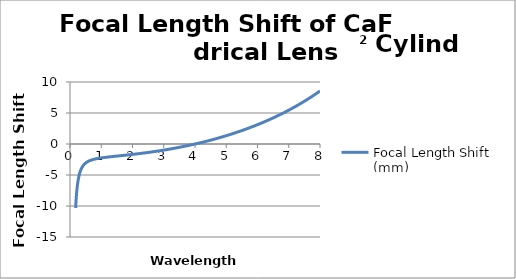
| Category | Focal Length Shift (mm) |
|---|---|
| 0.18 | -10.332 |
| 0.181 | -10.232 |
| 0.182 | -10.133 |
| 0.183 | -10.036 |
| 0.184 | -9.941 |
| 0.185 | -9.848 |
| 0.186 | -9.756 |
| 0.187 | -9.667 |
| 0.188 | -9.579 |
| 0.189 | -9.492 |
| 0.19 | -9.407 |
| 0.191 | -9.324 |
| 0.192 | -9.242 |
| 0.193 | -9.161 |
| 0.194 | -9.082 |
| 0.195 | -9.004 |
| 0.196 | -8.928 |
| 0.197 | -8.853 |
| 0.198 | -8.779 |
| 0.199 | -8.707 |
| 0.2 | -8.635 |
| 0.201 | -8.565 |
| 0.202 | -8.496 |
| 0.203 | -8.428 |
| 0.204 | -8.362 |
| 0.205 | -8.296 |
| 0.206 | -8.232 |
| 0.207 | -8.168 |
| 0.208 | -8.106 |
| 0.209 | -8.044 |
| 0.21 | -7.984 |
| 0.211 | -7.924 |
| 0.212 | -7.865 |
| 0.213 | -7.808 |
| 0.214 | -7.751 |
| 0.215 | -7.695 |
| 0.216 | -7.64 |
| 0.217 | -7.585 |
| 0.218 | -7.532 |
| 0.219 | -7.479 |
| 0.22 | -7.427 |
| 0.221 | -7.376 |
| 0.222 | -7.326 |
| 0.223 | -7.276 |
| 0.224 | -7.227 |
| 0.225 | -7.179 |
| 0.226 | -7.132 |
| 0.227 | -7.085 |
| 0.228 | -7.039 |
| 0.229 | -6.993 |
| 0.23 | -6.948 |
| 0.231 | -6.904 |
| 0.232 | -6.861 |
| 0.233 | -6.818 |
| 0.234 | -6.775 |
| 0.235 | -6.733 |
| 0.236 | -6.692 |
| 0.237 | -6.651 |
| 0.238 | -6.611 |
| 0.239 | -6.572 |
| 0.24 | -6.533 |
| 0.241 | -6.494 |
| 0.242 | -6.456 |
| 0.243 | -6.419 |
| 0.244 | -6.382 |
| 0.245 | -6.345 |
| 0.246 | -6.309 |
| 0.247 | -6.273 |
| 0.248 | -6.238 |
| 0.249 | -6.203 |
| 0.25 | -6.169 |
| 0.251 | -6.135 |
| 0.252 | -6.102 |
| 0.253 | -6.069 |
| 0.254 | -6.036 |
| 0.255 | -6.004 |
| 0.256 | -5.973 |
| 0.257 | -5.941 |
| 0.258 | -5.91 |
| 0.259 | -5.88 |
| 0.26 | -5.849 |
| 0.261 | -5.82 |
| 0.262 | -5.79 |
| 0.263 | -5.761 |
| 0.264 | -5.732 |
| 0.265 | -5.704 |
| 0.266 | -5.676 |
| 0.267 | -5.648 |
| 0.268 | -5.62 |
| 0.269 | -5.593 |
| 0.27 | -5.566 |
| 0.271 | -5.54 |
| 0.272 | -5.514 |
| 0.273 | -5.488 |
| 0.274 | -5.462 |
| 0.275 | -5.437 |
| 0.276 | -5.412 |
| 0.277 | -5.387 |
| 0.278 | -5.363 |
| 0.279 | -5.339 |
| 0.28 | -5.315 |
| 0.281 | -5.291 |
| 0.282 | -5.268 |
| 0.283 | -5.245 |
| 0.284 | -5.222 |
| 0.285 | -5.199 |
| 0.286 | -5.177 |
| 0.287 | -5.155 |
| 0.288 | -5.133 |
| 0.289 | -5.111 |
| 0.29 | -5.09 |
| 0.291 | -5.069 |
| 0.292 | -5.048 |
| 0.293 | -5.027 |
| 0.294 | -5.007 |
| 0.295 | -4.986 |
| 0.296 | -4.966 |
| 0.297 | -4.946 |
| 0.298 | -4.927 |
| 0.299 | -4.907 |
| 0.3 | -4.888 |
| 0.301 | -4.869 |
| 0.302 | -4.85 |
| 0.303 | -4.831 |
| 0.304 | -4.813 |
| 0.305 | -4.795 |
| 0.306 | -4.777 |
| 0.307 | -4.759 |
| 0.308 | -4.741 |
| 0.309 | -4.723 |
| 0.31 | -4.706 |
| 0.311 | -4.689 |
| 0.312 | -4.672 |
| 0.313 | -4.655 |
| 0.314 | -4.638 |
| 0.315 | -4.622 |
| 0.316 | -4.605 |
| 0.317 | -4.589 |
| 0.318 | -4.573 |
| 0.319 | -4.557 |
| 0.32 | -4.541 |
| 0.321 | -4.526 |
| 0.322 | -4.51 |
| 0.323 | -4.495 |
| 0.324 | -4.48 |
| 0.325 | -4.465 |
| 0.326 | -4.45 |
| 0.327 | -4.435 |
| 0.328 | -4.421 |
| 0.329 | -4.406 |
| 0.33 | -4.392 |
| 0.331 | -4.378 |
| 0.332 | -4.364 |
| 0.333 | -4.35 |
| 0.334 | -4.336 |
| 0.335 | -4.322 |
| 0.336 | -4.309 |
| 0.337 | -4.295 |
| 0.338 | -4.282 |
| 0.339 | -4.269 |
| 0.34 | -4.256 |
| 0.341 | -4.243 |
| 0.342 | -4.23 |
| 0.343 | -4.217 |
| 0.344 | -4.205 |
| 0.345 | -4.192 |
| 0.346 | -4.18 |
| 0.347 | -4.168 |
| 0.348 | -4.156 |
| 0.349 | -4.144 |
| 0.35 | -4.132 |
| 0.351 | -4.12 |
| 0.352 | -4.108 |
| 0.353 | -4.096 |
| 0.354 | -4.085 |
| 0.355 | -4.073 |
| 0.356 | -4.062 |
| 0.357 | -4.051 |
| 0.358 | -4.04 |
| 0.359 | -4.029 |
| 0.36 | -4.018 |
| 0.361 | -4.007 |
| 0.362 | -3.996 |
| 0.363 | -3.985 |
| 0.364 | -3.975 |
| 0.365 | -3.964 |
| 0.366 | -3.954 |
| 0.367 | -3.943 |
| 0.368 | -3.933 |
| 0.369 | -3.923 |
| 0.37 | -3.913 |
| 0.371 | -3.903 |
| 0.372 | -3.893 |
| 0.373 | -3.883 |
| 0.374 | -3.873 |
| 0.375 | -3.864 |
| 0.376 | -3.854 |
| 0.377 | -3.845 |
| 0.378 | -3.835 |
| 0.379 | -3.826 |
| 0.38 | -3.817 |
| 0.381 | -3.807 |
| 0.382 | -3.798 |
| 0.383 | -3.789 |
| 0.384 | -3.78 |
| 0.385 | -3.771 |
| 0.386 | -3.762 |
| 0.387 | -3.754 |
| 0.388 | -3.745 |
| 0.389 | -3.736 |
| 0.39 | -3.728 |
| 0.391 | -3.719 |
| 0.392 | -3.711 |
| 0.393 | -3.702 |
| 0.394 | -3.694 |
| 0.395 | -3.686 |
| 0.396 | -3.677 |
| 0.397 | -3.669 |
| 0.398 | -3.661 |
| 0.399 | -3.653 |
| 0.4 | -3.645 |
| 0.401 | -3.637 |
| 0.402 | -3.63 |
| 0.403 | -3.622 |
| 0.404 | -3.614 |
| 0.405 | -3.606 |
| 0.406 | -3.599 |
| 0.407 | -3.591 |
| 0.408 | -3.584 |
| 0.409 | -3.576 |
| 0.41 | -3.569 |
| 0.411 | -3.562 |
| 0.412 | -3.554 |
| 0.413 | -3.547 |
| 0.414 | -3.54 |
| 0.415 | -3.533 |
| 0.416 | -3.526 |
| 0.417 | -3.519 |
| 0.418 | -3.512 |
| 0.419 | -3.505 |
| 0.42 | -3.498 |
| 0.421 | -3.491 |
| 0.422 | -3.484 |
| 0.423 | -3.478 |
| 0.424 | -3.471 |
| 0.425 | -3.464 |
| 0.426 | -3.458 |
| 0.427 | -3.451 |
| 0.428 | -3.445 |
| 0.429 | -3.438 |
| 0.43 | -3.432 |
| 0.431 | -3.426 |
| 0.432 | -3.419 |
| 0.433 | -3.413 |
| 0.434 | -3.407 |
| 0.435 | -3.401 |
| 0.436 | -3.394 |
| 0.437 | -3.388 |
| 0.438 | -3.382 |
| 0.439 | -3.376 |
| 0.44 | -3.37 |
| 0.441 | -3.364 |
| 0.442 | -3.358 |
| 0.443 | -3.353 |
| 0.444 | -3.347 |
| 0.445 | -3.341 |
| 0.446 | -3.335 |
| 0.447 | -3.33 |
| 0.448 | -3.324 |
| 0.449 | -3.318 |
| 0.45 | -3.313 |
| 0.451 | -3.307 |
| 0.452 | -3.302 |
| 0.453 | -3.296 |
| 0.454 | -3.291 |
| 0.455 | -3.285 |
| 0.456 | -3.28 |
| 0.457 | -3.275 |
| 0.458 | -3.269 |
| 0.459 | -3.264 |
| 0.46 | -3.259 |
| 0.461 | -3.254 |
| 0.462 | -3.248 |
| 0.463 | -3.243 |
| 0.464 | -3.238 |
| 0.465 | -3.233 |
| 0.466 | -3.228 |
| 0.467 | -3.223 |
| 0.468 | -3.218 |
| 0.469 | -3.213 |
| 0.47 | -3.208 |
| 0.471 | -3.203 |
| 0.472 | -3.199 |
| 0.473 | -3.194 |
| 0.474 | -3.189 |
| 0.475 | -3.184 |
| 0.476 | -3.179 |
| 0.477 | -3.175 |
| 0.478 | -3.17 |
| 0.479 | -3.165 |
| 0.48 | -3.161 |
| 0.481 | -3.156 |
| 0.482 | -3.152 |
| 0.483 | -3.147 |
| 0.484 | -3.143 |
| 0.485 | -3.138 |
| 0.486 | -3.134 |
| 0.487 | -3.129 |
| 0.488 | -3.125 |
| 0.489 | -3.121 |
| 0.49 | -3.116 |
| 0.491 | -3.112 |
| 0.492 | -3.108 |
| 0.493 | -3.103 |
| 0.494 | -3.099 |
| 0.495 | -3.095 |
| 0.496 | -3.091 |
| 0.497 | -3.086 |
| 0.498 | -3.082 |
| 0.499 | -3.078 |
| 0.5 | -3.074 |
| 0.501 | -3.07 |
| 0.502 | -3.066 |
| 0.503 | -3.062 |
| 0.504 | -3.058 |
| 0.505 | -3.054 |
| 0.506 | -3.05 |
| 0.507 | -3.046 |
| 0.508 | -3.042 |
| 0.509 | -3.038 |
| 0.51 | -3.034 |
| 0.511 | -3.031 |
| 0.512 | -3.027 |
| 0.513 | -3.023 |
| 0.514 | -3.019 |
| 0.515 | -3.015 |
| 0.516 | -3.012 |
| 0.517 | -3.008 |
| 0.518 | -3.004 |
| 0.519 | -3.001 |
| 0.52 | -2.997 |
| 0.521 | -2.993 |
| 0.522 | -2.99 |
| 0.523 | -2.986 |
| 0.524 | -2.983 |
| 0.525 | -2.979 |
| 0.526 | -2.975 |
| 0.527 | -2.972 |
| 0.528 | -2.968 |
| 0.529 | -2.965 |
| 0.53 | -2.962 |
| 0.531 | -2.958 |
| 0.532 | -2.955 |
| 0.533 | -2.951 |
| 0.534 | -2.948 |
| 0.535 | -2.945 |
| 0.536 | -2.941 |
| 0.537 | -2.938 |
| 0.538 | -2.935 |
| 0.539 | -2.931 |
| 0.54 | -2.928 |
| 0.541 | -2.925 |
| 0.542 | -2.921 |
| 0.543 | -2.918 |
| 0.544 | -2.915 |
| 0.545 | -2.912 |
| 0.546 | -2.909 |
| 0.547 | -2.906 |
| 0.548 | -2.902 |
| 0.549 | -2.899 |
| 0.55 | -2.896 |
| 0.551 | -2.893 |
| 0.552 | -2.89 |
| 0.553 | -2.887 |
| 0.554 | -2.884 |
| 0.555 | -2.881 |
| 0.556 | -2.878 |
| 0.557 | -2.875 |
| 0.558 | -2.872 |
| 0.559 | -2.869 |
| 0.56 | -2.866 |
| 0.561 | -2.863 |
| 0.562 | -2.86 |
| 0.563 | -2.857 |
| 0.564 | -2.854 |
| 0.565 | -2.851 |
| 0.566 | -2.849 |
| 0.567 | -2.846 |
| 0.568 | -2.843 |
| 0.569 | -2.84 |
| 0.57 | -2.837 |
| 0.571 | -2.834 |
| 0.572 | -2.832 |
| 0.573 | -2.829 |
| 0.574 | -2.826 |
| 0.575 | -2.823 |
| 0.576 | -2.821 |
| 0.577 | -2.818 |
| 0.578 | -2.815 |
| 0.579 | -2.813 |
| 0.58 | -2.81 |
| 0.581 | -2.807 |
| 0.582 | -2.805 |
| 0.583 | -2.802 |
| 0.584 | -2.799 |
| 0.585 | -2.797 |
| 0.586 | -2.794 |
| 0.587 | -2.792 |
| 0.588 | -2.789 |
| 0.589 | -2.786 |
| 0.59 | -2.784 |
| 0.591 | -2.781 |
| 0.592 | -2.779 |
| 0.593 | -2.776 |
| 0.594 | -2.774 |
| 0.595 | -2.771 |
| 0.596 | -2.769 |
| 0.597 | -2.766 |
| 0.598 | -2.764 |
| 0.599 | -2.761 |
| 0.6 | -2.759 |
| 0.601 | -2.757 |
| 0.602 | -2.754 |
| 0.603 | -2.752 |
| 0.604 | -2.749 |
| 0.605 | -2.747 |
| 0.606 | -2.745 |
| 0.607 | -2.742 |
| 0.608 | -2.74 |
| 0.609 | -2.738 |
| 0.61 | -2.735 |
| 0.611 | -2.733 |
| 0.612 | -2.731 |
| 0.613 | -2.728 |
| 0.614 | -2.726 |
| 0.615 | -2.724 |
| 0.616 | -2.722 |
| 0.617 | -2.719 |
| 0.618 | -2.717 |
| 0.619 | -2.715 |
| 0.62 | -2.713 |
| 0.621 | -2.71 |
| 0.622 | -2.708 |
| 0.623 | -2.706 |
| 0.624 | -2.704 |
| 0.625 | -2.702 |
| 0.626 | -2.699 |
| 0.627 | -2.697 |
| 0.628 | -2.695 |
| 0.629 | -2.693 |
| 0.63 | -2.691 |
| 0.631 | -2.689 |
| 0.632 | -2.687 |
| 0.633 | -2.685 |
| 0.634 | -2.683 |
| 0.635 | -2.68 |
| 0.636 | -2.678 |
| 0.637 | -2.676 |
| 0.638 | -2.674 |
| 0.639 | -2.672 |
| 0.64 | -2.67 |
| 0.641 | -2.668 |
| 0.642 | -2.666 |
| 0.643 | -2.664 |
| 0.644 | -2.662 |
| 0.645 | -2.66 |
| 0.646 | -2.658 |
| 0.647 | -2.656 |
| 0.648 | -2.654 |
| 0.649 | -2.652 |
| 0.65 | -2.65 |
| 0.651 | -2.648 |
| 0.652 | -2.646 |
| 0.653 | -2.644 |
| 0.654 | -2.643 |
| 0.655 | -2.641 |
| 0.656 | -2.639 |
| 0.657 | -2.637 |
| 0.658 | -2.635 |
| 0.659 | -2.633 |
| 0.66 | -2.631 |
| 0.661 | -2.629 |
| 0.662 | -2.627 |
| 0.663 | -2.626 |
| 0.664 | -2.624 |
| 0.665 | -2.622 |
| 0.666 | -2.62 |
| 0.667 | -2.618 |
| 0.668 | -2.616 |
| 0.669 | -2.615 |
| 0.67 | -2.613 |
| 0.671 | -2.611 |
| 0.672 | -2.609 |
| 0.673 | -2.607 |
| 0.674 | -2.606 |
| 0.675 | -2.604 |
| 0.676 | -2.602 |
| 0.677 | -2.6 |
| 0.678 | -2.599 |
| 0.679 | -2.597 |
| 0.68 | -2.595 |
| 0.681 | -2.593 |
| 0.682 | -2.592 |
| 0.683 | -2.59 |
| 0.684 | -2.588 |
| 0.685 | -2.587 |
| 0.686 | -2.585 |
| 0.687 | -2.583 |
| 0.688 | -2.582 |
| 0.689 | -2.58 |
| 0.69 | -2.578 |
| 0.691 | -2.577 |
| 0.692 | -2.575 |
| 0.693 | -2.573 |
| 0.694 | -2.572 |
| 0.695 | -2.57 |
| 0.696 | -2.568 |
| 0.697 | -2.567 |
| 0.698 | -2.565 |
| 0.699 | -2.563 |
| 0.7 | -2.562 |
| 0.701 | -2.56 |
| 0.702 | -2.559 |
| 0.703 | -2.557 |
| 0.704 | -2.556 |
| 0.705 | -2.554 |
| 0.706 | -2.552 |
| 0.707 | -2.551 |
| 0.708 | -2.549 |
| 0.709 | -2.548 |
| 0.71 | -2.546 |
| 0.711 | -2.545 |
| 0.712 | -2.543 |
| 0.713 | -2.542 |
| 0.714 | -2.54 |
| 0.715 | -2.538 |
| 0.716 | -2.537 |
| 0.717 | -2.535 |
| 0.718 | -2.534 |
| 0.719 | -2.532 |
| 0.72 | -2.531 |
| 0.721 | -2.529 |
| 0.722 | -2.528 |
| 0.723 | -2.526 |
| 0.724 | -2.525 |
| 0.725 | -2.524 |
| 0.726 | -2.522 |
| 0.727 | -2.521 |
| 0.728 | -2.519 |
| 0.729 | -2.518 |
| 0.73 | -2.516 |
| 0.731 | -2.515 |
| 0.732 | -2.513 |
| 0.733 | -2.512 |
| 0.734 | -2.511 |
| 0.735 | -2.509 |
| 0.736 | -2.508 |
| 0.737 | -2.506 |
| 0.738 | -2.505 |
| 0.739 | -2.503 |
| 0.74 | -2.502 |
| 0.741 | -2.501 |
| 0.742 | -2.499 |
| 0.743 | -2.498 |
| 0.744 | -2.497 |
| 0.745 | -2.495 |
| 0.746 | -2.494 |
| 0.747 | -2.492 |
| 0.748 | -2.491 |
| 0.749 | -2.49 |
| 0.75 | -2.488 |
| 0.751 | -2.487 |
| 0.752 | -2.486 |
| 0.753 | -2.484 |
| 0.754 | -2.483 |
| 0.755 | -2.482 |
| 0.756 | -2.48 |
| 0.757 | -2.479 |
| 0.758 | -2.478 |
| 0.759 | -2.476 |
| 0.76 | -2.475 |
| 0.761 | -2.474 |
| 0.762 | -2.473 |
| 0.763 | -2.471 |
| 0.764 | -2.47 |
| 0.765 | -2.469 |
| 0.766 | -2.467 |
| 0.767 | -2.466 |
| 0.768 | -2.465 |
| 0.769 | -2.464 |
| 0.77 | -2.462 |
| 0.771 | -2.461 |
| 0.772 | -2.46 |
| 0.773 | -2.458 |
| 0.774 | -2.457 |
| 0.775 | -2.456 |
| 0.776 | -2.455 |
| 0.777 | -2.454 |
| 0.778 | -2.452 |
| 0.779 | -2.451 |
| 0.78 | -2.45 |
| 0.781 | -2.449 |
| 0.782 | -2.447 |
| 0.783 | -2.446 |
| 0.784 | -2.445 |
| 0.785 | -2.444 |
| 0.786 | -2.443 |
| 0.787 | -2.441 |
| 0.788 | -2.44 |
| 0.789 | -2.439 |
| 0.79 | -2.438 |
| 0.791 | -2.437 |
| 0.792 | -2.435 |
| 0.793 | -2.434 |
| 0.794 | -2.433 |
| 0.795 | -2.432 |
| 0.796 | -2.431 |
| 0.797 | -2.429 |
| 0.798 | -2.428 |
| 0.799 | -2.427 |
| 0.8 | -2.426 |
| 0.801 | -2.425 |
| 0.802 | -2.424 |
| 0.803 | -2.423 |
| 0.804 | -2.421 |
| 0.805 | -2.42 |
| 0.806 | -2.419 |
| 0.807 | -2.418 |
| 0.808 | -2.417 |
| 0.809 | -2.416 |
| 0.81 | -2.415 |
| 0.811 | -2.413 |
| 0.812 | -2.412 |
| 0.813 | -2.411 |
| 0.814 | -2.41 |
| 0.815 | -2.409 |
| 0.816 | -2.408 |
| 0.817 | -2.407 |
| 0.818 | -2.406 |
| 0.819 | -2.405 |
| 0.82 | -2.404 |
| 0.821 | -2.402 |
| 0.822 | -2.401 |
| 0.823 | -2.4 |
| 0.824 | -2.399 |
| 0.825 | -2.398 |
| 0.826 | -2.397 |
| 0.827 | -2.396 |
| 0.828 | -2.395 |
| 0.829 | -2.394 |
| 0.83 | -2.393 |
| 0.831 | -2.392 |
| 0.832 | -2.391 |
| 0.833 | -2.39 |
| 0.834 | -2.389 |
| 0.835 | -2.387 |
| 0.836 | -2.386 |
| 0.837 | -2.385 |
| 0.838 | -2.384 |
| 0.839 | -2.383 |
| 0.84 | -2.382 |
| 0.841 | -2.381 |
| 0.842 | -2.38 |
| 0.843 | -2.379 |
| 0.844 | -2.378 |
| 0.845 | -2.377 |
| 0.846 | -2.376 |
| 0.847 | -2.375 |
| 0.848 | -2.374 |
| 0.849 | -2.373 |
| 0.85 | -2.372 |
| 0.851 | -2.371 |
| 0.852 | -2.37 |
| 0.853 | -2.369 |
| 0.854 | -2.368 |
| 0.855 | -2.367 |
| 0.856 | -2.366 |
| 0.857 | -2.365 |
| 0.858 | -2.364 |
| 0.859 | -2.363 |
| 0.86 | -2.362 |
| 0.861 | -2.361 |
| 0.862 | -2.36 |
| 0.863 | -2.359 |
| 0.864 | -2.358 |
| 0.865 | -2.357 |
| 0.866 | -2.356 |
| 0.867 | -2.355 |
| 0.868 | -2.354 |
| 0.869 | -2.353 |
| 0.87 | -2.352 |
| 0.871 | -2.351 |
| 0.872 | -2.35 |
| 0.873 | -2.349 |
| 0.874 | -2.349 |
| 0.875 | -2.348 |
| 0.876 | -2.347 |
| 0.877 | -2.346 |
| 0.878 | -2.345 |
| 0.879 | -2.344 |
| 0.88 | -2.343 |
| 0.881 | -2.342 |
| 0.882 | -2.341 |
| 0.883 | -2.34 |
| 0.884 | -2.339 |
| 0.885 | -2.338 |
| 0.886 | -2.337 |
| 0.887 | -2.336 |
| 0.888 | -2.335 |
| 0.889 | -2.335 |
| 0.89 | -2.334 |
| 0.891 | -2.333 |
| 0.892 | -2.332 |
| 0.893 | -2.331 |
| 0.894 | -2.33 |
| 0.895 | -2.329 |
| 0.896 | -2.328 |
| 0.897 | -2.327 |
| 0.898 | -2.326 |
| 0.899 | -2.325 |
| 0.9 | -2.325 |
| 0.901 | -2.324 |
| 0.902 | -2.323 |
| 0.903 | -2.322 |
| 0.904 | -2.321 |
| 0.905 | -2.32 |
| 0.906 | -2.319 |
| 0.907 | -2.318 |
| 0.908 | -2.317 |
| 0.909 | -2.317 |
| 0.91 | -2.316 |
| 0.911 | -2.315 |
| 0.912 | -2.314 |
| 0.913 | -2.313 |
| 0.914 | -2.312 |
| 0.915 | -2.311 |
| 0.916 | -2.31 |
| 0.917 | -2.31 |
| 0.918 | -2.309 |
| 0.919 | -2.308 |
| 0.92 | -2.307 |
| 0.921 | -2.306 |
| 0.922 | -2.305 |
| 0.923 | -2.304 |
| 0.924 | -2.304 |
| 0.925 | -2.303 |
| 0.926 | -2.302 |
| 0.927 | -2.301 |
| 0.928 | -2.3 |
| 0.929 | -2.299 |
| 0.93 | -2.298 |
| 0.931 | -2.298 |
| 0.932 | -2.297 |
| 0.933 | -2.296 |
| 0.934 | -2.295 |
| 0.935 | -2.294 |
| 0.936 | -2.293 |
| 0.937 | -2.293 |
| 0.938 | -2.292 |
| 0.939 | -2.291 |
| 0.94 | -2.29 |
| 0.941 | -2.289 |
| 0.942 | -2.289 |
| 0.943 | -2.288 |
| 0.944 | -2.287 |
| 0.945 | -2.286 |
| 0.946 | -2.285 |
| 0.947 | -2.284 |
| 0.948 | -2.284 |
| 0.949 | -2.283 |
| 0.95 | -2.282 |
| 0.951 | -2.281 |
| 0.952 | -2.28 |
| 0.953 | -2.28 |
| 0.954 | -2.279 |
| 0.955 | -2.278 |
| 0.956 | -2.277 |
| 0.957 | -2.276 |
| 0.958 | -2.276 |
| 0.959 | -2.275 |
| 0.96 | -2.274 |
| 0.961 | -2.273 |
| 0.962 | -2.272 |
| 0.963 | -2.272 |
| 0.964 | -2.271 |
| 0.965 | -2.27 |
| 0.966 | -2.269 |
| 0.967 | -2.268 |
| 0.968 | -2.268 |
| 0.969 | -2.267 |
| 0.97 | -2.266 |
| 0.971 | -2.265 |
| 0.972 | -2.265 |
| 0.973 | -2.264 |
| 0.974 | -2.263 |
| 0.975 | -2.262 |
| 0.976 | -2.261 |
| 0.977 | -2.261 |
| 0.978 | -2.26 |
| 0.979 | -2.259 |
| 0.98 | -2.258 |
| 0.981 | -2.258 |
| 0.982 | -2.257 |
| 0.983 | -2.256 |
| 0.984 | -2.255 |
| 0.985 | -2.255 |
| 0.986 | -2.254 |
| 0.987 | -2.253 |
| 0.988 | -2.252 |
| 0.989 | -2.252 |
| 0.99 | -2.251 |
| 0.991 | -2.25 |
| 0.992 | -2.249 |
| 0.993 | -2.249 |
| 0.994 | -2.248 |
| 0.995 | -2.247 |
| 0.996 | -2.246 |
| 0.997 | -2.246 |
| 0.998 | -2.245 |
| 0.999 | -2.244 |
| 1.0 | -2.243 |
| 1.001 | -2.243 |
| 1.002 | -2.242 |
| 1.003 | -2.241 |
| 1.004 | -2.24 |
| 1.005 | -2.24 |
| 1.006 | -2.239 |
| 1.007 | -2.238 |
| 1.008 | -2.237 |
| 1.009 | -2.237 |
| 1.01 | -2.236 |
| 1.011 | -2.235 |
| 1.012 | -2.235 |
| 1.013 | -2.234 |
| 1.014 | -2.233 |
| 1.015 | -2.232 |
| 1.016 | -2.232 |
| 1.017 | -2.231 |
| 1.018 | -2.23 |
| 1.019 | -2.23 |
| 1.02 | -2.229 |
| 1.021 | -2.228 |
| 1.022 | -2.227 |
| 1.023 | -2.227 |
| 1.024 | -2.226 |
| 1.025 | -2.225 |
| 1.026 | -2.224 |
| 1.027 | -2.224 |
| 1.028 | -2.223 |
| 1.029 | -2.222 |
| 1.03 | -2.222 |
| 1.031 | -2.221 |
| 1.032 | -2.22 |
| 1.033 | -2.22 |
| 1.034 | -2.219 |
| 1.035 | -2.218 |
| 1.036 | -2.217 |
| 1.037 | -2.217 |
| 1.038 | -2.216 |
| 1.039 | -2.215 |
| 1.04 | -2.215 |
| 1.041 | -2.214 |
| 1.042 | -2.213 |
| 1.043 | -2.213 |
| 1.044 | -2.212 |
| 1.045 | -2.211 |
| 1.046 | -2.21 |
| 1.047 | -2.21 |
| 1.048 | -2.209 |
| 1.049 | -2.208 |
| 1.05 | -2.208 |
| 1.051 | -2.207 |
| 1.052 | -2.206 |
| 1.053 | -2.206 |
| 1.054 | -2.205 |
| 1.055 | -2.204 |
| 1.056 | -2.204 |
| 1.057 | -2.203 |
| 1.058 | -2.202 |
| 1.059 | -2.202 |
| 1.06 | -2.201 |
| 1.061 | -2.2 |
| 1.062 | -2.2 |
| 1.063 | -2.199 |
| 1.064 | -2.198 |
| 1.065 | -2.198 |
| 1.066 | -2.197 |
| 1.067 | -2.196 |
| 1.068 | -2.196 |
| 1.069 | -2.195 |
| 1.07 | -2.194 |
| 1.071 | -2.194 |
| 1.072 | -2.193 |
| 1.073 | -2.192 |
| 1.074 | -2.192 |
| 1.075 | -2.191 |
| 1.076 | -2.19 |
| 1.077 | -2.19 |
| 1.078 | -2.189 |
| 1.079 | -2.188 |
| 1.08 | -2.188 |
| 1.081 | -2.187 |
| 1.082 | -2.186 |
| 1.083 | -2.186 |
| 1.084 | -2.185 |
| 1.085 | -2.184 |
| 1.086 | -2.184 |
| 1.087 | -2.183 |
| 1.088 | -2.182 |
| 1.089 | -2.182 |
| 1.09 | -2.181 |
| 1.091 | -2.18 |
| 1.092 | -2.18 |
| 1.093 | -2.179 |
| 1.094 | -2.178 |
| 1.095 | -2.178 |
| 1.096 | -2.177 |
| 1.097 | -2.176 |
| 1.098 | -2.176 |
| 1.099 | -2.175 |
| 1.1 | -2.175 |
| 1.101 | -2.174 |
| 1.102 | -2.173 |
| 1.103 | -2.173 |
| 1.104 | -2.172 |
| 1.105 | -2.171 |
| 1.106 | -2.171 |
| 1.107 | -2.17 |
| 1.108 | -2.169 |
| 1.109 | -2.169 |
| 1.11 | -2.168 |
| 1.111 | -2.167 |
| 1.112 | -2.167 |
| 1.113 | -2.166 |
| 1.114 | -2.166 |
| 1.115 | -2.165 |
| 1.116 | -2.164 |
| 1.117 | -2.164 |
| 1.118 | -2.163 |
| 1.119 | -2.162 |
| 1.12 | -2.162 |
| 1.121 | -2.161 |
| 1.122 | -2.16 |
| 1.123 | -2.16 |
| 1.124 | -2.159 |
| 1.125 | -2.159 |
| 1.126 | -2.158 |
| 1.127 | -2.157 |
| 1.128 | -2.157 |
| 1.129 | -2.156 |
| 1.13 | -2.155 |
| 1.131 | -2.155 |
| 1.132 | -2.154 |
| 1.133 | -2.154 |
| 1.134 | -2.153 |
| 1.135 | -2.152 |
| 1.136 | -2.152 |
| 1.137 | -2.151 |
| 1.138 | -2.151 |
| 1.139 | -2.15 |
| 1.14 | -2.149 |
| 1.141 | -2.149 |
| 1.142 | -2.148 |
| 1.143 | -2.147 |
| 1.144 | -2.147 |
| 1.145 | -2.146 |
| 1.146 | -2.146 |
| 1.147 | -2.145 |
| 1.148 | -2.144 |
| 1.149 | -2.144 |
| 1.15 | -2.143 |
| 1.151 | -2.143 |
| 1.152 | -2.142 |
| 1.153 | -2.141 |
| 1.154 | -2.141 |
| 1.155 | -2.14 |
| 1.156 | -2.139 |
| 1.157 | -2.139 |
| 1.158 | -2.138 |
| 1.159 | -2.138 |
| 1.16 | -2.137 |
| 1.161 | -2.136 |
| 1.162 | -2.136 |
| 1.163 | -2.135 |
| 1.164 | -2.135 |
| 1.165 | -2.134 |
| 1.166 | -2.133 |
| 1.167 | -2.133 |
| 1.168 | -2.132 |
| 1.169 | -2.132 |
| 1.17 | -2.131 |
| 1.171 | -2.13 |
| 1.172 | -2.13 |
| 1.173 | -2.129 |
| 1.174 | -2.129 |
| 1.175 | -2.128 |
| 1.176 | -2.127 |
| 1.177 | -2.127 |
| 1.178 | -2.126 |
| 1.179 | -2.126 |
| 1.18 | -2.125 |
| 1.181 | -2.124 |
| 1.182 | -2.124 |
| 1.183 | -2.123 |
| 1.184 | -2.123 |
| 1.185 | -2.122 |
| 1.186 | -2.121 |
| 1.187 | -2.121 |
| 1.188 | -2.12 |
| 1.189 | -2.12 |
| 1.19 | -2.119 |
| 1.191 | -2.119 |
| 1.192 | -2.118 |
| 1.193 | -2.117 |
| 1.194 | -2.117 |
| 1.195 | -2.116 |
| 1.196 | -2.116 |
| 1.197 | -2.115 |
| 1.198 | -2.114 |
| 1.199 | -2.114 |
| 1.2 | -2.113 |
| 1.201 | -2.113 |
| 1.202 | -2.112 |
| 1.203 | -2.111 |
| 1.204 | -2.111 |
| 1.205 | -2.11 |
| 1.206 | -2.11 |
| 1.207 | -2.109 |
| 1.208 | -2.109 |
| 1.209 | -2.108 |
| 1.21 | -2.107 |
| 1.211 | -2.107 |
| 1.212 | -2.106 |
| 1.213 | -2.106 |
| 1.214 | -2.105 |
| 1.215 | -2.104 |
| 1.216 | -2.104 |
| 1.217 | -2.103 |
| 1.218 | -2.103 |
| 1.219 | -2.102 |
| 1.22 | -2.102 |
| 1.221 | -2.101 |
| 1.222 | -2.1 |
| 1.223 | -2.1 |
| 1.224 | -2.099 |
| 1.225 | -2.099 |
| 1.226 | -2.098 |
| 1.227 | -2.098 |
| 1.228 | -2.097 |
| 1.229 | -2.096 |
| 1.23 | -2.096 |
| 1.231 | -2.095 |
| 1.232 | -2.095 |
| 1.233 | -2.094 |
| 1.234 | -2.094 |
| 1.235 | -2.093 |
| 1.236 | -2.092 |
| 1.237 | -2.092 |
| 1.238 | -2.091 |
| 1.239 | -2.091 |
| 1.24 | -2.09 |
| 1.241 | -2.09 |
| 1.242 | -2.089 |
| 1.243 | -2.088 |
| 1.244 | -2.088 |
| 1.245 | -2.087 |
| 1.246 | -2.087 |
| 1.247 | -2.086 |
| 1.248 | -2.086 |
| 1.249 | -2.085 |
| 1.25 | -2.084 |
| 1.251 | -2.084 |
| 1.252 | -2.083 |
| 1.253 | -2.083 |
| 1.254 | -2.082 |
| 1.255 | -2.082 |
| 1.256 | -2.081 |
| 1.257 | -2.08 |
| 1.258 | -2.08 |
| 1.259 | -2.079 |
| 1.26 | -2.079 |
| 1.261 | -2.078 |
| 1.262 | -2.078 |
| 1.263 | -2.077 |
| 1.264 | -2.077 |
| 1.265 | -2.076 |
| 1.266 | -2.075 |
| 1.267 | -2.075 |
| 1.268 | -2.074 |
| 1.269 | -2.074 |
| 1.27 | -2.073 |
| 1.271 | -2.073 |
| 1.272 | -2.072 |
| 1.273 | -2.071 |
| 1.274 | -2.071 |
| 1.275 | -2.07 |
| 1.276 | -2.07 |
| 1.277 | -2.069 |
| 1.278 | -2.069 |
| 1.279 | -2.068 |
| 1.28 | -2.068 |
| 1.281 | -2.067 |
| 1.282 | -2.066 |
| 1.283 | -2.066 |
| 1.284 | -2.065 |
| 1.285 | -2.065 |
| 1.286 | -2.064 |
| 1.287 | -2.064 |
| 1.288 | -2.063 |
| 1.289 | -2.063 |
| 1.29 | -2.062 |
| 1.291 | -2.061 |
| 1.292 | -2.061 |
| 1.293 | -2.06 |
| 1.294 | -2.06 |
| 1.295 | -2.059 |
| 1.296 | -2.059 |
| 1.297 | -2.058 |
| 1.298 | -2.058 |
| 1.299 | -2.057 |
| 1.3 | -2.056 |
| 1.301 | -2.056 |
| 1.302 | -2.055 |
| 1.303 | -2.055 |
| 1.304 | -2.054 |
| 1.305 | -2.054 |
| 1.306 | -2.053 |
| 1.307 | -2.053 |
| 1.308 | -2.052 |
| 1.309 | -2.052 |
| 1.31 | -2.051 |
| 1.311 | -2.05 |
| 1.312 | -2.05 |
| 1.313 | -2.049 |
| 1.314 | -2.049 |
| 1.315 | -2.048 |
| 1.316 | -2.048 |
| 1.317 | -2.047 |
| 1.318 | -2.047 |
| 1.319 | -2.046 |
| 1.32 | -2.045 |
| 1.321 | -2.045 |
| 1.322 | -2.044 |
| 1.323 | -2.044 |
| 1.324 | -2.043 |
| 1.325 | -2.043 |
| 1.326 | -2.042 |
| 1.327 | -2.042 |
| 1.328 | -2.041 |
| 1.329 | -2.041 |
| 1.33 | -2.04 |
| 1.331 | -2.039 |
| 1.332 | -2.039 |
| 1.333 | -2.038 |
| 1.334 | -2.038 |
| 1.335 | -2.037 |
| 1.336 | -2.037 |
| 1.337 | -2.036 |
| 1.338 | -2.036 |
| 1.339 | -2.035 |
| 1.34 | -2.035 |
| 1.341 | -2.034 |
| 1.342 | -2.033 |
| 1.343 | -2.033 |
| 1.344 | -2.032 |
| 1.345 | -2.032 |
| 1.346 | -2.031 |
| 1.347 | -2.031 |
| 1.348 | -2.03 |
| 1.349 | -2.03 |
| 1.35 | -2.029 |
| 1.351 | -2.029 |
| 1.352 | -2.028 |
| 1.353 | -2.028 |
| 1.354 | -2.027 |
| 1.355 | -2.026 |
| 1.356 | -2.026 |
| 1.357 | -2.025 |
| 1.358 | -2.025 |
| 1.359 | -2.024 |
| 1.36 | -2.024 |
| 1.361 | -2.023 |
| 1.362 | -2.023 |
| 1.363 | -2.022 |
| 1.364 | -2.022 |
| 1.365 | -2.021 |
| 1.366 | -2.021 |
| 1.367 | -2.02 |
| 1.368 | -2.019 |
| 1.369 | -2.019 |
| 1.37 | -2.018 |
| 1.371 | -2.018 |
| 1.372 | -2.017 |
| 1.373 | -2.017 |
| 1.374 | -2.016 |
| 1.375 | -2.016 |
| 1.376 | -2.015 |
| 1.377 | -2.015 |
| 1.378 | -2.014 |
| 1.379 | -2.014 |
| 1.38 | -2.013 |
| 1.381 | -2.012 |
| 1.382 | -2.012 |
| 1.383 | -2.011 |
| 1.384 | -2.011 |
| 1.385 | -2.01 |
| 1.386 | -2.01 |
| 1.387 | -2.009 |
| 1.388 | -2.009 |
| 1.389 | -2.008 |
| 1.39 | -2.008 |
| 1.391 | -2.007 |
| 1.392 | -2.007 |
| 1.393 | -2.006 |
| 1.394 | -2.005 |
| 1.395 | -2.005 |
| 1.396 | -2.004 |
| 1.397 | -2.004 |
| 1.398 | -2.003 |
| 1.399 | -2.003 |
| 1.4 | -2.002 |
| 1.401 | -2.002 |
| 1.402 | -2.001 |
| 1.403 | -2.001 |
| 1.404 | -2 |
| 1.405 | -2 |
| 1.406 | -1.999 |
| 1.407 | -1.999 |
| 1.408 | -1.998 |
| 1.409 | -1.997 |
| 1.41 | -1.997 |
| 1.411 | -1.996 |
| 1.412 | -1.996 |
| 1.413 | -1.995 |
| 1.414 | -1.995 |
| 1.415 | -1.994 |
| 1.416 | -1.994 |
| 1.417 | -1.993 |
| 1.418 | -1.993 |
| 1.419 | -1.992 |
| 1.42 | -1.992 |
| 1.421 | -1.991 |
| 1.422 | -1.991 |
| 1.423 | -1.99 |
| 1.424 | -1.989 |
| 1.425 | -1.989 |
| 1.426 | -1.988 |
| 1.427 | -1.988 |
| 1.428 | -1.987 |
| 1.429 | -1.987 |
| 1.43 | -1.986 |
| 1.431 | -1.986 |
| 1.432 | -1.985 |
| 1.433 | -1.985 |
| 1.434 | -1.984 |
| 1.435 | -1.984 |
| 1.436 | -1.983 |
| 1.437 | -1.983 |
| 1.438 | -1.982 |
| 1.439 | -1.982 |
| 1.44 | -1.981 |
| 1.441 | -1.98 |
| 1.442 | -1.98 |
| 1.443 | -1.979 |
| 1.444 | -1.979 |
| 1.445 | -1.978 |
| 1.446 | -1.978 |
| 1.447 | -1.977 |
| 1.448 | -1.977 |
| 1.449 | -1.976 |
| 1.45 | -1.976 |
| 1.451 | -1.975 |
| 1.452 | -1.975 |
| 1.453 | -1.974 |
| 1.454 | -1.974 |
| 1.455 | -1.973 |
| 1.456 | -1.973 |
| 1.457 | -1.972 |
| 1.458 | -1.971 |
| 1.459 | -1.971 |
| 1.46 | -1.97 |
| 1.461 | -1.97 |
| 1.462 | -1.969 |
| 1.463 | -1.969 |
| 1.464 | -1.968 |
| 1.465 | -1.968 |
| 1.466 | -1.967 |
| 1.467 | -1.967 |
| 1.468 | -1.966 |
| 1.469 | -1.966 |
| 1.47 | -1.965 |
| 1.471 | -1.965 |
| 1.472 | -1.964 |
| 1.473 | -1.964 |
| 1.474 | -1.963 |
| 1.475 | -1.962 |
| 1.476 | -1.962 |
| 1.477 | -1.961 |
| 1.478 | -1.961 |
| 1.479 | -1.96 |
| 1.48 | -1.96 |
| 1.481 | -1.959 |
| 1.482 | -1.959 |
| 1.483 | -1.958 |
| 1.484 | -1.958 |
| 1.485 | -1.957 |
| 1.486 | -1.957 |
| 1.487 | -1.956 |
| 1.488 | -1.956 |
| 1.489 | -1.955 |
| 1.49 | -1.955 |
| 1.491 | -1.954 |
| 1.492 | -1.954 |
| 1.493 | -1.953 |
| 1.494 | -1.952 |
| 1.495 | -1.952 |
| 1.496 | -1.951 |
| 1.497 | -1.951 |
| 1.498 | -1.95 |
| 1.499 | -1.95 |
| 1.5 | -1.949 |
| 1.501 | -1.949 |
| 1.502 | -1.948 |
| 1.503 | -1.948 |
| 1.504 | -1.947 |
| 1.505 | -1.947 |
| 1.506 | -1.946 |
| 1.507 | -1.946 |
| 1.508 | -1.945 |
| 1.509 | -1.945 |
| 1.51 | -1.944 |
| 1.511 | -1.943 |
| 1.512 | -1.943 |
| 1.513 | -1.942 |
| 1.514 | -1.942 |
| 1.515 | -1.941 |
| 1.516 | -1.941 |
| 1.517 | -1.94 |
| 1.518 | -1.94 |
| 1.519 | -1.939 |
| 1.52 | -1.939 |
| 1.521 | -1.938 |
| 1.522 | -1.938 |
| 1.523 | -1.937 |
| 1.524 | -1.937 |
| 1.525 | -1.936 |
| 1.526 | -1.936 |
| 1.527 | -1.935 |
| 1.528 | -1.935 |
| 1.529 | -1.934 |
| 1.53 | -1.933 |
| 1.531 | -1.933 |
| 1.532 | -1.932 |
| 1.533 | -1.932 |
| 1.534 | -1.931 |
| 1.535 | -1.931 |
| 1.536 | -1.93 |
| 1.537 | -1.93 |
| 1.538 | -1.929 |
| 1.539 | -1.929 |
| 1.54 | -1.928 |
| 1.541 | -1.928 |
| 1.542 | -1.927 |
| 1.543 | -1.927 |
| 1.544 | -1.926 |
| 1.545 | -1.926 |
| 1.546 | -1.925 |
| 1.547 | -1.925 |
| 1.548 | -1.924 |
| 1.549 | -1.923 |
| 1.55 | -1.923 |
| 1.551 | -1.922 |
| 1.552 | -1.922 |
| 1.553 | -1.921 |
| 1.554 | -1.921 |
| 1.555 | -1.92 |
| 1.556 | -1.92 |
| 1.557 | -1.919 |
| 1.558 | -1.919 |
| 1.559 | -1.918 |
| 1.56 | -1.918 |
| 1.561 | -1.917 |
| 1.562 | -1.917 |
| 1.563 | -1.916 |
| 1.564 | -1.916 |
| 1.565 | -1.915 |
| 1.566 | -1.914 |
| 1.567 | -1.914 |
| 1.568 | -1.913 |
| 1.569 | -1.913 |
| 1.57 | -1.912 |
| 1.571 | -1.912 |
| 1.572 | -1.911 |
| 1.573 | -1.911 |
| 1.574 | -1.91 |
| 1.575 | -1.91 |
| 1.576 | -1.909 |
| 1.577 | -1.909 |
| 1.578 | -1.908 |
| 1.579 | -1.908 |
| 1.58 | -1.907 |
| 1.581 | -1.907 |
| 1.582 | -1.906 |
| 1.583 | -1.906 |
| 1.584 | -1.905 |
| 1.585 | -1.904 |
| 1.586 | -1.904 |
| 1.587 | -1.903 |
| 1.588 | -1.903 |
| 1.589 | -1.902 |
| 1.59 | -1.902 |
| 1.591 | -1.901 |
| 1.592 | -1.901 |
| 1.593 | -1.9 |
| 1.594 | -1.9 |
| 1.595 | -1.899 |
| 1.596 | -1.899 |
| 1.597 | -1.898 |
| 1.598 | -1.898 |
| 1.599 | -1.897 |
| 1.6 | -1.897 |
| 1.601 | -1.896 |
| 1.602 | -1.895 |
| 1.603 | -1.895 |
| 1.604 | -1.894 |
| 1.605 | -1.894 |
| 1.606 | -1.893 |
| 1.607 | -1.893 |
| 1.608 | -1.892 |
| 1.609 | -1.892 |
| 1.61 | -1.891 |
| 1.611 | -1.891 |
| 1.612 | -1.89 |
| 1.613 | -1.89 |
| 1.614 | -1.889 |
| 1.615 | -1.889 |
| 1.616 | -1.888 |
| 1.617 | -1.888 |
| 1.618 | -1.887 |
| 1.619 | -1.886 |
| 1.62 | -1.886 |
| 1.621 | -1.885 |
| 1.622 | -1.885 |
| 1.623 | -1.884 |
| 1.624 | -1.884 |
| 1.625 | -1.883 |
| 1.626 | -1.883 |
| 1.627 | -1.882 |
| 1.628 | -1.882 |
| 1.629 | -1.881 |
| 1.63 | -1.881 |
| 1.631 | -1.88 |
| 1.632 | -1.88 |
| 1.633 | -1.879 |
| 1.634 | -1.879 |
| 1.635 | -1.878 |
| 1.636 | -1.877 |
| 1.637 | -1.877 |
| 1.638 | -1.876 |
| 1.639 | -1.876 |
| 1.64 | -1.875 |
| 1.641 | -1.875 |
| 1.642 | -1.874 |
| 1.643 | -1.874 |
| 1.644 | -1.873 |
| 1.645 | -1.873 |
| 1.646 | -1.872 |
| 1.647 | -1.872 |
| 1.648 | -1.871 |
| 1.649 | -1.871 |
| 1.65 | -1.87 |
| 1.651 | -1.87 |
| 1.652 | -1.869 |
| 1.653 | -1.868 |
| 1.654 | -1.868 |
| 1.655 | -1.867 |
| 1.656 | -1.867 |
| 1.657 | -1.866 |
| 1.658 | -1.866 |
| 1.659 | -1.865 |
| 1.66 | -1.865 |
| 1.661 | -1.864 |
| 1.662 | -1.864 |
| 1.663 | -1.863 |
| 1.664 | -1.863 |
| 1.665 | -1.862 |
| 1.666 | -1.862 |
| 1.667 | -1.861 |
| 1.668 | -1.86 |
| 1.669 | -1.86 |
| 1.67 | -1.859 |
| 1.671 | -1.859 |
| 1.672 | -1.858 |
| 1.673 | -1.858 |
| 1.674 | -1.857 |
| 1.675 | -1.857 |
| 1.676 | -1.856 |
| 1.677 | -1.856 |
| 1.678 | -1.855 |
| 1.679 | -1.855 |
| 1.68 | -1.854 |
| 1.681 | -1.854 |
| 1.682 | -1.853 |
| 1.683 | -1.852 |
| 1.684 | -1.852 |
| 1.685 | -1.851 |
| 1.686 | -1.851 |
| 1.687 | -1.85 |
| 1.688 | -1.85 |
| 1.689 | -1.849 |
| 1.69 | -1.849 |
| 1.691 | -1.848 |
| 1.692 | -1.848 |
| 1.693 | -1.847 |
| 1.694 | -1.847 |
| 1.695 | -1.846 |
| 1.696 | -1.846 |
| 1.697 | -1.845 |
| 1.698 | -1.844 |
| 1.699 | -1.844 |
| 1.7 | -1.843 |
| 1.701 | -1.843 |
| 1.702 | -1.842 |
| 1.703 | -1.842 |
| 1.704 | -1.841 |
| 1.705 | -1.841 |
| 1.706 | -1.84 |
| 1.707 | -1.84 |
| 1.708 | -1.839 |
| 1.709 | -1.839 |
| 1.71 | -1.838 |
| 1.711 | -1.837 |
| 1.712 | -1.837 |
| 1.713 | -1.836 |
| 1.714 | -1.836 |
| 1.715 | -1.835 |
| 1.716 | -1.835 |
| 1.717 | -1.834 |
| 1.718 | -1.834 |
| 1.719 | -1.833 |
| 1.72 | -1.833 |
| 1.721 | -1.832 |
| 1.722 | -1.832 |
| 1.723 | -1.831 |
| 1.724 | -1.831 |
| 1.725 | -1.83 |
| 1.726 | -1.829 |
| 1.727 | -1.829 |
| 1.728 | -1.828 |
| 1.729 | -1.828 |
| 1.73 | -1.827 |
| 1.731 | -1.827 |
| 1.732 | -1.826 |
| 1.733 | -1.826 |
| 1.734 | -1.825 |
| 1.735 | -1.825 |
| 1.736 | -1.824 |
| 1.737 | -1.824 |
| 1.738 | -1.823 |
| 1.739 | -1.822 |
| 1.74 | -1.822 |
| 1.741 | -1.821 |
| 1.742 | -1.821 |
| 1.743 | -1.82 |
| 1.744 | -1.82 |
| 1.745 | -1.819 |
| 1.746 | -1.819 |
| 1.747 | -1.818 |
| 1.748 | -1.818 |
| 1.749 | -1.817 |
| 1.75 | -1.816 |
| 1.751 | -1.816 |
| 1.752 | -1.815 |
| 1.753 | -1.815 |
| 1.754 | -1.814 |
| 1.755 | -1.814 |
| 1.756 | -1.813 |
| 1.757 | -1.813 |
| 1.758 | -1.812 |
| 1.759 | -1.812 |
| 1.76 | -1.811 |
| 1.761 | -1.811 |
| 1.762 | -1.81 |
| 1.763 | -1.809 |
| 1.764 | -1.809 |
| 1.765 | -1.808 |
| 1.766 | -1.808 |
| 1.767 | -1.807 |
| 1.768 | -1.807 |
| 1.769 | -1.806 |
| 1.77 | -1.806 |
| 1.771 | -1.805 |
| 1.772 | -1.805 |
| 1.773 | -1.804 |
| 1.774 | -1.803 |
| 1.775 | -1.803 |
| 1.776 | -1.802 |
| 1.777 | -1.802 |
| 1.778 | -1.801 |
| 1.779 | -1.801 |
| 1.78 | -1.8 |
| 1.781 | -1.8 |
| 1.782 | -1.799 |
| 1.783 | -1.799 |
| 1.784 | -1.798 |
| 1.785 | -1.797 |
| 1.786 | -1.797 |
| 1.787 | -1.796 |
| 1.788 | -1.796 |
| 1.789 | -1.795 |
| 1.79 | -1.795 |
| 1.791 | -1.794 |
| 1.792 | -1.794 |
| 1.793 | -1.793 |
| 1.794 | -1.793 |
| 1.795 | -1.792 |
| 1.796 | -1.791 |
| 1.797 | -1.791 |
| 1.798 | -1.79 |
| 1.799 | -1.79 |
| 1.8 | -1.789 |
| 1.801 | -1.789 |
| 1.802 | -1.788 |
| 1.803 | -1.788 |
| 1.804 | -1.787 |
| 1.805 | -1.787 |
| 1.806 | -1.786 |
| 1.807 | -1.785 |
| 1.808 | -1.785 |
| 1.809 | -1.784 |
| 1.81 | -1.784 |
| 1.811 | -1.783 |
| 1.812 | -1.783 |
| 1.813 | -1.782 |
| 1.814 | -1.782 |
| 1.815 | -1.781 |
| 1.816 | -1.781 |
| 1.817 | -1.78 |
| 1.818 | -1.779 |
| 1.819 | -1.779 |
| 1.82 | -1.778 |
| 1.821 | -1.778 |
| 1.822 | -1.777 |
| 1.823 | -1.777 |
| 1.824 | -1.776 |
| 1.825 | -1.776 |
| 1.826 | -1.775 |
| 1.827 | -1.774 |
| 1.828 | -1.774 |
| 1.829 | -1.773 |
| 1.83 | -1.773 |
| 1.831 | -1.772 |
| 1.832 | -1.772 |
| 1.833 | -1.771 |
| 1.834 | -1.771 |
| 1.835 | -1.77 |
| 1.836 | -1.77 |
| 1.837 | -1.769 |
| 1.838 | -1.768 |
| 1.839 | -1.768 |
| 1.84 | -1.767 |
| 1.841 | -1.767 |
| 1.842 | -1.766 |
| 1.843 | -1.766 |
| 1.844 | -1.765 |
| 1.845 | -1.765 |
| 1.846 | -1.764 |
| 1.847 | -1.763 |
| 1.848 | -1.763 |
| 1.849 | -1.762 |
| 1.85 | -1.762 |
| 1.851 | -1.761 |
| 1.852 | -1.761 |
| 1.853 | -1.76 |
| 1.854 | -1.76 |
| 1.855 | -1.759 |
| 1.856 | -1.758 |
| 1.857 | -1.758 |
| 1.858 | -1.757 |
| 1.859 | -1.757 |
| 1.86 | -1.756 |
| 1.861 | -1.756 |
| 1.862 | -1.755 |
| 1.863 | -1.755 |
| 1.864 | -1.754 |
| 1.865 | -1.753 |
| 1.866 | -1.753 |
| 1.867 | -1.752 |
| 1.868 | -1.752 |
| 1.869 | -1.751 |
| 1.87 | -1.751 |
| 1.871 | -1.75 |
| 1.872 | -1.75 |
| 1.873 | -1.749 |
| 1.874 | -1.748 |
| 1.875 | -1.748 |
| 1.876 | -1.747 |
| 1.877 | -1.747 |
| 1.878 | -1.746 |
| 1.879 | -1.746 |
| 1.88 | -1.745 |
| 1.881 | -1.745 |
| 1.882 | -1.744 |
| 1.883 | -1.743 |
| 1.884 | -1.743 |
| 1.885 | -1.742 |
| 1.886 | -1.742 |
| 1.887 | -1.741 |
| 1.888 | -1.741 |
| 1.889 | -1.74 |
| 1.89 | -1.74 |
| 1.891 | -1.739 |
| 1.892 | -1.738 |
| 1.893 | -1.738 |
| 1.894 | -1.737 |
| 1.895 | -1.737 |
| 1.896 | -1.736 |
| 1.897 | -1.736 |
| 1.898 | -1.735 |
| 1.899 | -1.734 |
| 1.9 | -1.734 |
| 1.901 | -1.733 |
| 1.902 | -1.733 |
| 1.903 | -1.732 |
| 1.904 | -1.732 |
| 1.905 | -1.731 |
| 1.906 | -1.731 |
| 1.907 | -1.73 |
| 1.908 | -1.729 |
| 1.909 | -1.729 |
| 1.91 | -1.728 |
| 1.911 | -1.728 |
| 1.912 | -1.727 |
| 1.913 | -1.727 |
| 1.914 | -1.726 |
| 1.915 | -1.725 |
| 1.916 | -1.725 |
| 1.917 | -1.724 |
| 1.918 | -1.724 |
| 1.919 | -1.723 |
| 1.92 | -1.723 |
| 1.921 | -1.722 |
| 1.922 | -1.722 |
| 1.923 | -1.721 |
| 1.924 | -1.72 |
| 1.925 | -1.72 |
| 1.926 | -1.719 |
| 1.927 | -1.719 |
| 1.928 | -1.718 |
| 1.929 | -1.718 |
| 1.93 | -1.717 |
| 1.931 | -1.716 |
| 1.932 | -1.716 |
| 1.933 | -1.715 |
| 1.934 | -1.715 |
| 1.935 | -1.714 |
| 1.936 | -1.714 |
| 1.937 | -1.713 |
| 1.938 | -1.712 |
| 1.939 | -1.712 |
| 1.94 | -1.711 |
| 1.941 | -1.711 |
| 1.942 | -1.71 |
| 1.943 | -1.71 |
| 1.944 | -1.709 |
| 1.945 | -1.708 |
| 1.946 | -1.708 |
| 1.947 | -1.707 |
| 1.948 | -1.707 |
| 1.949 | -1.706 |
| 1.95 | -1.706 |
| 1.951 | -1.705 |
| 1.952 | -1.704 |
| 1.953 | -1.704 |
| 1.954 | -1.703 |
| 1.955 | -1.703 |
| 1.956 | -1.702 |
| 1.957 | -1.702 |
| 1.958 | -1.701 |
| 1.959 | -1.7 |
| 1.96 | -1.7 |
| 1.961 | -1.699 |
| 1.962 | -1.699 |
| 1.963 | -1.698 |
| 1.964 | -1.698 |
| 1.965 | -1.697 |
| 1.966 | -1.696 |
| 1.967 | -1.696 |
| 1.968 | -1.695 |
| 1.969 | -1.695 |
| 1.97 | -1.694 |
| 1.971 | -1.694 |
| 1.972 | -1.693 |
| 1.973 | -1.692 |
| 1.974 | -1.692 |
| 1.975 | -1.691 |
| 1.976 | -1.691 |
| 1.977 | -1.69 |
| 1.978 | -1.69 |
| 1.979 | -1.689 |
| 1.98 | -1.688 |
| 1.981 | -1.688 |
| 1.982 | -1.687 |
| 1.983 | -1.687 |
| 1.984 | -1.686 |
| 1.985 | -1.686 |
| 1.986 | -1.685 |
| 1.987 | -1.684 |
| 1.988 | -1.684 |
| 1.989 | -1.683 |
| 1.99 | -1.683 |
| 1.991 | -1.682 |
| 1.992 | -1.682 |
| 1.993 | -1.681 |
| 1.994 | -1.68 |
| 1.995 | -1.68 |
| 1.996 | -1.679 |
| 1.997 | -1.679 |
| 1.998 | -1.678 |
| 1.999 | -1.677 |
| 2.0 | -1.677 |
| 2.001 | -1.676 |
| 2.002 | -1.676 |
| 2.003 | -1.675 |
| 2.004 | -1.675 |
| 2.005 | -1.674 |
| 2.006 | -1.673 |
| 2.007 | -1.673 |
| 2.008 | -1.672 |
| 2.009 | -1.672 |
| 2.01 | -1.671 |
| 2.011 | -1.671 |
| 2.012 | -1.67 |
| 2.013 | -1.669 |
| 2.014 | -1.669 |
| 2.015 | -1.668 |
| 2.016 | -1.668 |
| 2.017 | -1.667 |
| 2.018 | -1.666 |
| 2.019 | -1.666 |
| 2.02 | -1.665 |
| 2.021 | -1.665 |
| 2.022 | -1.664 |
| 2.023 | -1.664 |
| 2.024 | -1.663 |
| 2.025 | -1.662 |
| 2.026 | -1.662 |
| 2.027 | -1.661 |
| 2.028 | -1.661 |
| 2.029 | -1.66 |
| 2.03 | -1.659 |
| 2.031 | -1.659 |
| 2.032 | -1.658 |
| 2.033 | -1.658 |
| 2.034 | -1.657 |
| 2.035 | -1.657 |
| 2.036 | -1.656 |
| 2.037 | -1.655 |
| 2.038 | -1.655 |
| 2.039 | -1.654 |
| 2.04 | -1.654 |
| 2.041 | -1.653 |
| 2.042 | -1.652 |
| 2.043 | -1.652 |
| 2.044 | -1.651 |
| 2.045 | -1.651 |
| 2.046 | -1.65 |
| 2.047 | -1.649 |
| 2.048 | -1.649 |
| 2.049 | -1.648 |
| 2.05 | -1.648 |
| 2.051 | -1.647 |
| 2.052 | -1.647 |
| 2.053 | -1.646 |
| 2.054 | -1.645 |
| 2.055 | -1.645 |
| 2.056 | -1.644 |
| 2.057 | -1.644 |
| 2.058 | -1.643 |
| 2.059 | -1.642 |
| 2.06 | -1.642 |
| 2.061 | -1.641 |
| 2.062 | -1.641 |
| 2.063 | -1.64 |
| 2.064 | -1.639 |
| 2.065 | -1.639 |
| 2.066 | -1.638 |
| 2.067 | -1.638 |
| 2.068 | -1.637 |
| 2.069 | -1.636 |
| 2.07 | -1.636 |
| 2.071 | -1.635 |
| 2.072 | -1.635 |
| 2.073 | -1.634 |
| 2.074 | -1.634 |
| 2.075 | -1.633 |
| 2.076 | -1.632 |
| 2.077 | -1.632 |
| 2.078 | -1.631 |
| 2.079 | -1.631 |
| 2.08 | -1.63 |
| 2.081 | -1.629 |
| 2.082 | -1.629 |
| 2.083 | -1.628 |
| 2.084 | -1.628 |
| 2.085 | -1.627 |
| 2.086 | -1.626 |
| 2.087 | -1.626 |
| 2.088 | -1.625 |
| 2.089 | -1.625 |
| 2.09 | -1.624 |
| 2.091 | -1.623 |
| 2.092 | -1.623 |
| 2.093 | -1.622 |
| 2.094 | -1.622 |
| 2.095 | -1.621 |
| 2.096 | -1.62 |
| 2.097 | -1.62 |
| 2.098 | -1.619 |
| 2.099 | -1.619 |
| 2.1 | -1.618 |
| 2.101 | -1.617 |
| 2.102 | -1.617 |
| 2.103 | -1.616 |
| 2.104 | -1.616 |
| 2.105 | -1.615 |
| 2.106 | -1.614 |
| 2.107 | -1.614 |
| 2.108 | -1.613 |
| 2.109 | -1.613 |
| 2.11 | -1.612 |
| 2.111 | -1.611 |
| 2.112 | -1.611 |
| 2.113 | -1.61 |
| 2.114 | -1.61 |
| 2.115 | -1.609 |
| 2.116 | -1.608 |
| 2.117 | -1.608 |
| 2.118 | -1.607 |
| 2.119 | -1.607 |
| 2.12 | -1.606 |
| 2.121 | -1.605 |
| 2.122 | -1.605 |
| 2.123 | -1.604 |
| 2.124 | -1.604 |
| 2.125 | -1.603 |
| 2.126 | -1.602 |
| 2.127 | -1.602 |
| 2.128 | -1.601 |
| 2.129 | -1.601 |
| 2.13 | -1.6 |
| 2.131 | -1.599 |
| 2.132 | -1.599 |
| 2.133 | -1.598 |
| 2.134 | -1.598 |
| 2.135 | -1.597 |
| 2.136 | -1.596 |
| 2.137 | -1.596 |
| 2.138 | -1.595 |
| 2.139 | -1.595 |
| 2.14 | -1.594 |
| 2.141 | -1.593 |
| 2.142 | -1.593 |
| 2.143 | -1.592 |
| 2.144 | -1.592 |
| 2.145 | -1.591 |
| 2.146 | -1.59 |
| 2.147 | -1.59 |
| 2.148 | -1.589 |
| 2.149 | -1.588 |
| 2.15 | -1.588 |
| 2.151 | -1.587 |
| 2.152 | -1.587 |
| 2.153 | -1.586 |
| 2.154 | -1.585 |
| 2.155 | -1.585 |
| 2.156 | -1.584 |
| 2.157 | -1.584 |
| 2.158 | -1.583 |
| 2.159 | -1.582 |
| 2.16 | -1.582 |
| 2.161 | -1.581 |
| 2.162 | -1.581 |
| 2.163 | -1.58 |
| 2.164 | -1.579 |
| 2.165 | -1.579 |
| 2.166 | -1.578 |
| 2.167 | -1.578 |
| 2.168 | -1.577 |
| 2.169 | -1.576 |
| 2.17 | -1.576 |
| 2.171 | -1.575 |
| 2.172 | -1.574 |
| 2.173 | -1.574 |
| 2.174 | -1.573 |
| 2.175 | -1.573 |
| 2.176 | -1.572 |
| 2.177 | -1.571 |
| 2.178 | -1.571 |
| 2.179 | -1.57 |
| 2.18 | -1.57 |
| 2.181 | -1.569 |
| 2.182 | -1.568 |
| 2.183 | -1.568 |
| 2.184 | -1.567 |
| 2.185 | -1.566 |
| 2.186 | -1.566 |
| 2.187 | -1.565 |
| 2.188 | -1.565 |
| 2.189 | -1.564 |
| 2.19 | -1.563 |
| 2.191 | -1.563 |
| 2.192 | -1.562 |
| 2.193 | -1.562 |
| 2.194 | -1.561 |
| 2.195 | -1.56 |
| 2.196 | -1.56 |
| 2.197 | -1.559 |
| 2.198 | -1.558 |
| 2.199 | -1.558 |
| 2.2 | -1.557 |
| 2.201 | -1.557 |
| 2.202 | -1.556 |
| 2.203 | -1.555 |
| 2.204 | -1.555 |
| 2.205 | -1.554 |
| 2.206 | -1.553 |
| 2.207 | -1.553 |
| 2.208 | -1.552 |
| 2.209 | -1.552 |
| 2.21 | -1.551 |
| 2.211 | -1.55 |
| 2.212 | -1.55 |
| 2.213 | -1.549 |
| 2.214 | -1.548 |
| 2.215 | -1.548 |
| 2.216 | -1.547 |
| 2.217 | -1.547 |
| 2.218 | -1.546 |
| 2.219 | -1.545 |
| 2.22 | -1.545 |
| 2.221 | -1.544 |
| 2.222 | -1.544 |
| 2.223 | -1.543 |
| 2.224 | -1.542 |
| 2.225 | -1.542 |
| 2.226 | -1.541 |
| 2.227 | -1.54 |
| 2.228 | -1.54 |
| 2.229 | -1.539 |
| 2.23 | -1.538 |
| 2.231 | -1.538 |
| 2.232 | -1.537 |
| 2.233 | -1.537 |
| 2.234 | -1.536 |
| 2.235 | -1.535 |
| 2.236 | -1.535 |
| 2.237 | -1.534 |
| 2.238 | -1.533 |
| 2.239 | -1.533 |
| 2.24 | -1.532 |
| 2.241 | -1.532 |
| 2.242 | -1.531 |
| 2.243 | -1.53 |
| 2.244 | -1.53 |
| 2.245 | -1.529 |
| 2.246 | -1.528 |
| 2.247 | -1.528 |
| 2.248 | -1.527 |
| 2.249 | -1.527 |
| 2.25 | -1.526 |
| 2.251 | -1.525 |
| 2.252 | -1.525 |
| 2.253 | -1.524 |
| 2.254 | -1.523 |
| 2.255 | -1.523 |
| 2.256 | -1.522 |
| 2.257 | -1.522 |
| 2.258 | -1.521 |
| 2.259 | -1.52 |
| 2.26 | -1.52 |
| 2.261 | -1.519 |
| 2.262 | -1.518 |
| 2.263 | -1.518 |
| 2.264 | -1.517 |
| 2.265 | -1.516 |
| 2.266 | -1.516 |
| 2.267 | -1.515 |
| 2.268 | -1.515 |
| 2.269 | -1.514 |
| 2.27 | -1.513 |
| 2.271 | -1.513 |
| 2.272 | -1.512 |
| 2.273 | -1.511 |
| 2.274 | -1.511 |
| 2.275 | -1.51 |
| 2.276 | -1.509 |
| 2.277 | -1.509 |
| 2.278 | -1.508 |
| 2.279 | -1.508 |
| 2.28 | -1.507 |
| 2.281 | -1.506 |
| 2.282 | -1.506 |
| 2.283 | -1.505 |
| 2.284 | -1.504 |
| 2.285 | -1.504 |
| 2.286 | -1.503 |
| 2.287 | -1.502 |
| 2.288 | -1.502 |
| 2.289 | -1.501 |
| 2.29 | -1.501 |
| 2.291 | -1.5 |
| 2.292 | -1.499 |
| 2.293 | -1.499 |
| 2.294 | -1.498 |
| 2.295 | -1.497 |
| 2.296 | -1.497 |
| 2.297 | -1.496 |
| 2.298 | -1.495 |
| 2.299 | -1.495 |
| 2.3 | -1.494 |
| 2.301 | -1.493 |
| 2.302 | -1.493 |
| 2.303 | -1.492 |
| 2.304 | -1.492 |
| 2.305 | -1.491 |
| 2.306 | -1.49 |
| 2.307 | -1.49 |
| 2.308 | -1.489 |
| 2.309 | -1.488 |
| 2.31 | -1.488 |
| 2.311 | -1.487 |
| 2.312 | -1.486 |
| 2.313 | -1.486 |
| 2.314 | -1.485 |
| 2.315 | -1.484 |
| 2.316 | -1.484 |
| 2.317 | -1.483 |
| 2.318 | -1.483 |
| 2.319 | -1.482 |
| 2.32 | -1.481 |
| 2.321 | -1.481 |
| 2.322 | -1.48 |
| 2.323 | -1.479 |
| 2.324 | -1.479 |
| 2.325 | -1.478 |
| 2.326 | -1.477 |
| 2.327 | -1.477 |
| 2.328 | -1.476 |
| 2.329 | -1.475 |
| 2.33 | -1.475 |
| 2.331 | -1.474 |
| 2.332 | -1.473 |
| 2.333 | -1.473 |
| 2.334 | -1.472 |
| 2.335 | -1.472 |
| 2.336 | -1.471 |
| 2.337 | -1.47 |
| 2.338 | -1.47 |
| 2.339 | -1.469 |
| 2.34 | -1.468 |
| 2.341 | -1.468 |
| 2.342 | -1.467 |
| 2.343 | -1.466 |
| 2.344 | -1.466 |
| 2.345 | -1.465 |
| 2.346 | -1.464 |
| 2.347 | -1.464 |
| 2.348 | -1.463 |
| 2.349 | -1.462 |
| 2.35 | -1.462 |
| 2.351 | -1.461 |
| 2.352 | -1.46 |
| 2.353 | -1.46 |
| 2.354 | -1.459 |
| 2.355 | -1.458 |
| 2.356 | -1.458 |
| 2.357 | -1.457 |
| 2.358 | -1.456 |
| 2.359 | -1.456 |
| 2.36 | -1.455 |
| 2.361 | -1.455 |
| 2.362 | -1.454 |
| 2.363 | -1.453 |
| 2.364 | -1.453 |
| 2.365 | -1.452 |
| 2.366 | -1.451 |
| 2.367 | -1.451 |
| 2.368 | -1.45 |
| 2.369 | -1.449 |
| 2.37 | -1.449 |
| 2.371 | -1.448 |
| 2.372 | -1.447 |
| 2.373 | -1.447 |
| 2.374 | -1.446 |
| 2.375 | -1.445 |
| 2.376 | -1.445 |
| 2.377 | -1.444 |
| 2.378 | -1.443 |
| 2.379 | -1.443 |
| 2.38 | -1.442 |
| 2.381 | -1.441 |
| 2.382 | -1.441 |
| 2.383 | -1.44 |
| 2.384 | -1.439 |
| 2.385 | -1.439 |
| 2.386 | -1.438 |
| 2.387 | -1.437 |
| 2.388 | -1.437 |
| 2.389 | -1.436 |
| 2.39 | -1.435 |
| 2.391 | -1.435 |
| 2.392 | -1.434 |
| 2.393 | -1.433 |
| 2.394 | -1.433 |
| 2.395 | -1.432 |
| 2.396 | -1.431 |
| 2.397 | -1.431 |
| 2.398 | -1.43 |
| 2.399 | -1.429 |
| 2.4 | -1.429 |
| 2.401 | -1.428 |
| 2.402 | -1.427 |
| 2.403 | -1.427 |
| 2.404 | -1.426 |
| 2.405 | -1.425 |
| 2.406 | -1.425 |
| 2.407 | -1.424 |
| 2.408 | -1.423 |
| 2.409 | -1.423 |
| 2.41 | -1.422 |
| 2.411 | -1.421 |
| 2.412 | -1.421 |
| 2.413 | -1.42 |
| 2.414 | -1.419 |
| 2.415 | -1.419 |
| 2.416 | -1.418 |
| 2.417 | -1.417 |
| 2.418 | -1.417 |
| 2.419 | -1.416 |
| 2.42 | -1.415 |
| 2.421 | -1.415 |
| 2.422 | -1.414 |
| 2.423 | -1.413 |
| 2.424 | -1.413 |
| 2.425 | -1.412 |
| 2.426 | -1.411 |
| 2.427 | -1.411 |
| 2.428 | -1.41 |
| 2.429 | -1.409 |
| 2.43 | -1.409 |
| 2.431 | -1.408 |
| 2.432 | -1.407 |
| 2.433 | -1.407 |
| 2.434 | -1.406 |
| 2.435 | -1.405 |
| 2.436 | -1.405 |
| 2.437 | -1.404 |
| 2.438 | -1.403 |
| 2.439 | -1.403 |
| 2.44 | -1.402 |
| 2.441 | -1.401 |
| 2.442 | -1.401 |
| 2.443 | -1.4 |
| 2.444 | -1.399 |
| 2.445 | -1.399 |
| 2.446 | -1.398 |
| 2.447 | -1.397 |
| 2.448 | -1.397 |
| 2.449 | -1.396 |
| 2.45 | -1.395 |
| 2.451 | -1.394 |
| 2.452 | -1.394 |
| 2.453 | -1.393 |
| 2.454 | -1.392 |
| 2.455 | -1.392 |
| 2.456 | -1.391 |
| 2.457 | -1.39 |
| 2.458 | -1.39 |
| 2.459 | -1.389 |
| 2.46 | -1.388 |
| 2.461 | -1.388 |
| 2.462 | -1.387 |
| 2.463 | -1.386 |
| 2.464 | -1.386 |
| 2.465 | -1.385 |
| 2.466 | -1.384 |
| 2.467 | -1.384 |
| 2.468 | -1.383 |
| 2.469 | -1.382 |
| 2.47 | -1.382 |
| 2.471 | -1.381 |
| 2.472 | -1.38 |
| 2.473 | -1.38 |
| 2.474 | -1.379 |
| 2.475 | -1.378 |
| 2.476 | -1.377 |
| 2.477 | -1.377 |
| 2.478 | -1.376 |
| 2.479 | -1.375 |
| 2.48 | -1.375 |
| 2.481 | -1.374 |
| 2.482 | -1.373 |
| 2.483 | -1.373 |
| 2.484 | -1.372 |
| 2.485 | -1.371 |
| 2.486 | -1.371 |
| 2.487 | -1.37 |
| 2.488 | -1.369 |
| 2.489 | -1.369 |
| 2.49 | -1.368 |
| 2.491 | -1.367 |
| 2.492 | -1.366 |
| 2.493 | -1.366 |
| 2.494 | -1.365 |
| 2.495 | -1.364 |
| 2.496 | -1.364 |
| 2.497 | -1.363 |
| 2.498 | -1.362 |
| 2.499 | -1.362 |
| 2.5 | -1.361 |
| 2.501 | -1.36 |
| 2.502 | -1.36 |
| 2.503 | -1.359 |
| 2.504 | -1.358 |
| 2.505 | -1.358 |
| 2.506 | -1.357 |
| 2.507 | -1.356 |
| 2.508 | -1.355 |
| 2.509 | -1.355 |
| 2.51 | -1.354 |
| 2.511 | -1.353 |
| 2.512 | -1.353 |
| 2.513 | -1.352 |
| 2.514 | -1.351 |
| 2.515 | -1.351 |
| 2.516 | -1.35 |
| 2.517 | -1.349 |
| 2.518 | -1.348 |
| 2.519 | -1.348 |
| 2.52 | -1.347 |
| 2.521 | -1.346 |
| 2.522 | -1.346 |
| 2.523 | -1.345 |
| 2.524 | -1.344 |
| 2.525 | -1.344 |
| 2.526 | -1.343 |
| 2.527 | -1.342 |
| 2.528 | -1.342 |
| 2.529 | -1.341 |
| 2.53 | -1.34 |
| 2.531 | -1.339 |
| 2.532 | -1.339 |
| 2.533 | -1.338 |
| 2.534 | -1.337 |
| 2.535 | -1.337 |
| 2.536 | -1.336 |
| 2.537 | -1.335 |
| 2.538 | -1.335 |
| 2.539 | -1.334 |
| 2.54 | -1.333 |
| 2.541 | -1.332 |
| 2.542 | -1.332 |
| 2.543 | -1.331 |
| 2.544 | -1.33 |
| 2.545 | -1.33 |
| 2.546 | -1.329 |
| 2.547 | -1.328 |
| 2.548 | -1.328 |
| 2.549 | -1.327 |
| 2.55 | -1.326 |
| 2.551 | -1.325 |
| 2.552 | -1.325 |
| 2.553 | -1.324 |
| 2.554 | -1.323 |
| 2.555 | -1.323 |
| 2.556 | -1.322 |
| 2.557 | -1.321 |
| 2.558 | -1.32 |
| 2.559 | -1.32 |
| 2.56 | -1.319 |
| 2.561 | -1.318 |
| 2.562 | -1.318 |
| 2.563 | -1.317 |
| 2.564 | -1.316 |
| 2.565 | -1.316 |
| 2.566 | -1.315 |
| 2.567 | -1.314 |
| 2.568 | -1.313 |
| 2.569 | -1.313 |
| 2.57 | -1.312 |
| 2.571 | -1.311 |
| 2.572 | -1.311 |
| 2.573 | -1.31 |
| 2.574 | -1.309 |
| 2.575 | -1.308 |
| 2.576 | -1.308 |
| 2.577 | -1.307 |
| 2.578 | -1.306 |
| 2.579 | -1.306 |
| 2.58 | -1.305 |
| 2.581 | -1.304 |
| 2.582 | -1.303 |
| 2.583 | -1.303 |
| 2.584 | -1.302 |
| 2.585 | -1.301 |
| 2.586 | -1.301 |
| 2.587 | -1.3 |
| 2.588 | -1.299 |
| 2.589 | -1.298 |
| 2.59 | -1.298 |
| 2.591 | -1.297 |
| 2.592 | -1.296 |
| 2.593 | -1.296 |
| 2.594 | -1.295 |
| 2.595 | -1.294 |
| 2.596 | -1.294 |
| 2.597 | -1.293 |
| 2.598 | -1.292 |
| 2.599 | -1.291 |
| 2.6 | -1.291 |
| 2.601 | -1.29 |
| 2.602 | -1.289 |
| 2.603 | -1.288 |
| 2.604 | -1.288 |
| 2.605 | -1.287 |
| 2.606 | -1.286 |
| 2.607 | -1.286 |
| 2.608 | -1.285 |
| 2.609 | -1.284 |
| 2.61 | -1.283 |
| 2.611 | -1.283 |
| 2.612 | -1.282 |
| 2.613 | -1.281 |
| 2.614 | -1.281 |
| 2.615 | -1.28 |
| 2.616 | -1.279 |
| 2.617 | -1.278 |
| 2.618 | -1.278 |
| 2.619 | -1.277 |
| 2.62 | -1.276 |
| 2.621 | -1.276 |
| 2.622 | -1.275 |
| 2.623 | -1.274 |
| 2.624 | -1.273 |
| 2.625 | -1.273 |
| 2.626 | -1.272 |
| 2.627 | -1.271 |
| 2.628 | -1.27 |
| 2.629 | -1.27 |
| 2.63 | -1.269 |
| 2.631 | -1.268 |
| 2.632 | -1.268 |
| 2.633 | -1.267 |
| 2.634 | -1.266 |
| 2.635 | -1.265 |
| 2.636 | -1.265 |
| 2.637 | -1.264 |
| 2.638 | -1.263 |
| 2.639 | -1.262 |
| 2.64 | -1.262 |
| 2.641 | -1.261 |
| 2.642 | -1.26 |
| 2.643 | -1.26 |
| 2.644 | -1.259 |
| 2.645 | -1.258 |
| 2.646 | -1.257 |
| 2.647 | -1.257 |
| 2.648 | -1.256 |
| 2.649 | -1.255 |
| 2.65 | -1.254 |
| 2.651 | -1.254 |
| 2.652 | -1.253 |
| 2.653 | -1.252 |
| 2.654 | -1.252 |
| 2.655 | -1.251 |
| 2.656 | -1.25 |
| 2.657 | -1.249 |
| 2.658 | -1.249 |
| 2.659 | -1.248 |
| 2.66 | -1.247 |
| 2.661 | -1.246 |
| 2.662 | -1.246 |
| 2.663 | -1.245 |
| 2.664 | -1.244 |
| 2.665 | -1.244 |
| 2.666 | -1.243 |
| 2.667 | -1.242 |
| 2.668 | -1.241 |
| 2.669 | -1.241 |
| 2.67 | -1.24 |
| 2.671 | -1.239 |
| 2.672 | -1.238 |
| 2.673 | -1.238 |
| 2.674 | -1.237 |
| 2.675 | -1.236 |
| 2.676 | -1.235 |
| 2.677 | -1.235 |
| 2.678 | -1.234 |
| 2.679 | -1.233 |
| 2.68 | -1.232 |
| 2.681 | -1.232 |
| 2.682 | -1.231 |
| 2.683 | -1.23 |
| 2.684 | -1.23 |
| 2.685 | -1.229 |
| 2.686 | -1.228 |
| 2.687 | -1.227 |
| 2.688 | -1.227 |
| 2.689 | -1.226 |
| 2.69 | -1.225 |
| 2.691 | -1.224 |
| 2.692 | -1.224 |
| 2.693 | -1.223 |
| 2.694 | -1.222 |
| 2.695 | -1.221 |
| 2.696 | -1.221 |
| 2.697 | -1.22 |
| 2.698 | -1.219 |
| 2.699 | -1.218 |
| 2.7 | -1.218 |
| 2.701 | -1.217 |
| 2.702 | -1.216 |
| 2.703 | -1.215 |
| 2.704 | -1.215 |
| 2.705 | -1.214 |
| 2.706 | -1.213 |
| 2.707 | -1.212 |
| 2.708 | -1.212 |
| 2.709 | -1.211 |
| 2.71 | -1.21 |
| 2.711 | -1.21 |
| 2.712 | -1.209 |
| 2.713 | -1.208 |
| 2.714 | -1.207 |
| 2.715 | -1.207 |
| 2.716 | -1.206 |
| 2.717 | -1.205 |
| 2.718 | -1.204 |
| 2.719 | -1.204 |
| 2.72 | -1.203 |
| 2.721 | -1.202 |
| 2.722 | -1.201 |
| 2.723 | -1.201 |
| 2.724 | -1.2 |
| 2.725 | -1.199 |
| 2.726 | -1.198 |
| 2.727 | -1.198 |
| 2.728 | -1.197 |
| 2.729 | -1.196 |
| 2.73 | -1.195 |
| 2.731 | -1.195 |
| 2.732 | -1.194 |
| 2.733 | -1.193 |
| 2.734 | -1.192 |
| 2.735 | -1.192 |
| 2.736 | -1.191 |
| 2.737 | -1.19 |
| 2.738 | -1.189 |
| 2.739 | -1.189 |
| 2.74 | -1.188 |
| 2.741 | -1.187 |
| 2.742 | -1.186 |
| 2.743 | -1.186 |
| 2.744 | -1.185 |
| 2.745 | -1.184 |
| 2.746 | -1.183 |
| 2.747 | -1.182 |
| 2.748 | -1.182 |
| 2.749 | -1.181 |
| 2.75 | -1.18 |
| 2.751 | -1.179 |
| 2.752 | -1.179 |
| 2.753 | -1.178 |
| 2.754 | -1.177 |
| 2.755 | -1.176 |
| 2.756 | -1.176 |
| 2.757 | -1.175 |
| 2.758 | -1.174 |
| 2.759 | -1.173 |
| 2.76 | -1.173 |
| 2.761 | -1.172 |
| 2.762 | -1.171 |
| 2.763 | -1.17 |
| 2.764 | -1.17 |
| 2.765 | -1.169 |
| 2.766 | -1.168 |
| 2.767 | -1.167 |
| 2.768 | -1.167 |
| 2.769 | -1.166 |
| 2.77 | -1.165 |
| 2.771 | -1.164 |
| 2.772 | -1.164 |
| 2.773 | -1.163 |
| 2.774 | -1.162 |
| 2.775 | -1.161 |
| 2.776 | -1.16 |
| 2.777 | -1.16 |
| 2.778 | -1.159 |
| 2.779 | -1.158 |
| 2.78 | -1.157 |
| 2.781 | -1.157 |
| 2.782 | -1.156 |
| 2.783 | -1.155 |
| 2.784 | -1.154 |
| 2.785 | -1.154 |
| 2.786 | -1.153 |
| 2.787 | -1.152 |
| 2.788 | -1.151 |
| 2.789 | -1.151 |
| 2.79 | -1.15 |
| 2.791 | -1.149 |
| 2.792 | -1.148 |
| 2.793 | -1.147 |
| 2.794 | -1.147 |
| 2.795 | -1.146 |
| 2.796 | -1.145 |
| 2.797 | -1.144 |
| 2.798 | -1.144 |
| 2.799 | -1.143 |
| 2.8 | -1.142 |
| 2.801 | -1.141 |
| 2.802 | -1.141 |
| 2.803 | -1.14 |
| 2.804 | -1.139 |
| 2.805 | -1.138 |
| 2.806 | -1.137 |
| 2.807 | -1.137 |
| 2.808 | -1.136 |
| 2.809 | -1.135 |
| 2.81 | -1.134 |
| 2.811 | -1.134 |
| 2.812 | -1.133 |
| 2.813 | -1.132 |
| 2.814 | -1.131 |
| 2.815 | -1.13 |
| 2.816 | -1.13 |
| 2.817 | -1.129 |
| 2.818 | -1.128 |
| 2.819 | -1.127 |
| 2.82 | -1.127 |
| 2.821 | -1.126 |
| 2.822 | -1.125 |
| 2.823 | -1.124 |
| 2.824 | -1.124 |
| 2.825 | -1.123 |
| 2.826 | -1.122 |
| 2.827 | -1.121 |
| 2.828 | -1.12 |
| 2.829 | -1.12 |
| 2.83 | -1.119 |
| 2.831 | -1.118 |
| 2.832 | -1.117 |
| 2.833 | -1.117 |
| 2.834 | -1.116 |
| 2.835 | -1.115 |
| 2.836 | -1.114 |
| 2.837 | -1.113 |
| 2.838 | -1.113 |
| 2.839 | -1.112 |
| 2.84 | -1.111 |
| 2.841 | -1.11 |
| 2.842 | -1.109 |
| 2.843 | -1.109 |
| 2.844 | -1.108 |
| 2.845 | -1.107 |
| 2.846 | -1.106 |
| 2.847 | -1.106 |
| 2.848 | -1.105 |
| 2.849 | -1.104 |
| 2.85 | -1.103 |
| 2.851 | -1.102 |
| 2.852 | -1.102 |
| 2.853 | -1.101 |
| 2.854 | -1.1 |
| 2.855 | -1.099 |
| 2.856 | -1.099 |
| 2.857 | -1.098 |
| 2.858 | -1.097 |
| 2.859 | -1.096 |
| 2.86 | -1.095 |
| 2.861 | -1.095 |
| 2.862 | -1.094 |
| 2.863 | -1.093 |
| 2.864 | -1.092 |
| 2.865 | -1.091 |
| 2.866 | -1.091 |
| 2.867 | -1.09 |
| 2.868 | -1.089 |
| 2.869 | -1.088 |
| 2.87 | -1.087 |
| 2.871 | -1.087 |
| 2.872 | -1.086 |
| 2.873 | -1.085 |
| 2.874 | -1.084 |
| 2.875 | -1.084 |
| 2.876 | -1.083 |
| 2.877 | -1.082 |
| 2.878 | -1.081 |
| 2.879 | -1.08 |
| 2.88 | -1.08 |
| 2.881 | -1.079 |
| 2.882 | -1.078 |
| 2.883 | -1.077 |
| 2.884 | -1.076 |
| 2.885 | -1.076 |
| 2.886 | -1.075 |
| 2.887 | -1.074 |
| 2.888 | -1.073 |
| 2.889 | -1.072 |
| 2.89 | -1.072 |
| 2.891 | -1.071 |
| 2.892 | -1.07 |
| 2.893 | -1.069 |
| 2.894 | -1.068 |
| 2.895 | -1.068 |
| 2.896 | -1.067 |
| 2.897 | -1.066 |
| 2.898 | -1.065 |
| 2.899 | -1.064 |
| 2.9 | -1.064 |
| 2.901 | -1.063 |
| 2.902 | -1.062 |
| 2.903 | -1.061 |
| 2.904 | -1.06 |
| 2.905 | -1.06 |
| 2.906 | -1.059 |
| 2.907 | -1.058 |
| 2.908 | -1.057 |
| 2.909 | -1.056 |
| 2.91 | -1.056 |
| 2.911 | -1.055 |
| 2.912 | -1.054 |
| 2.913 | -1.053 |
| 2.914 | -1.052 |
| 2.915 | -1.052 |
| 2.916 | -1.051 |
| 2.917 | -1.05 |
| 2.918 | -1.049 |
| 2.919 | -1.048 |
| 2.92 | -1.048 |
| 2.921 | -1.047 |
| 2.922 | -1.046 |
| 2.923 | -1.045 |
| 2.924 | -1.044 |
| 2.925 | -1.044 |
| 2.926 | -1.043 |
| 2.927 | -1.042 |
| 2.928 | -1.041 |
| 2.929 | -1.04 |
| 2.93 | -1.04 |
| 2.931 | -1.039 |
| 2.932 | -1.038 |
| 2.933 | -1.037 |
| 2.934 | -1.036 |
| 2.935 | -1.036 |
| 2.936 | -1.035 |
| 2.937 | -1.034 |
| 2.938 | -1.033 |
| 2.939 | -1.032 |
| 2.94 | -1.032 |
| 2.941 | -1.031 |
| 2.942 | -1.03 |
| 2.943 | -1.029 |
| 2.944 | -1.028 |
| 2.945 | -1.027 |
| 2.946 | -1.027 |
| 2.947 | -1.026 |
| 2.948 | -1.025 |
| 2.949 | -1.024 |
| 2.95 | -1.023 |
| 2.951 | -1.023 |
| 2.952 | -1.022 |
| 2.953 | -1.021 |
| 2.954 | -1.02 |
| 2.955 | -1.019 |
| 2.956 | -1.019 |
| 2.957 | -1.018 |
| 2.958 | -1.017 |
| 2.959 | -1.016 |
| 2.96 | -1.015 |
| 2.961 | -1.014 |
| 2.962 | -1.014 |
| 2.963 | -1.013 |
| 2.964 | -1.012 |
| 2.965 | -1.011 |
| 2.966 | -1.01 |
| 2.967 | -1.01 |
| 2.968 | -1.009 |
| 2.969 | -1.008 |
| 2.97 | -1.007 |
| 2.971 | -1.006 |
| 2.972 | -1.005 |
| 2.973 | -1.005 |
| 2.974 | -1.004 |
| 2.975 | -1.003 |
| 2.976 | -1.002 |
| 2.977 | -1.001 |
| 2.978 | -1.001 |
| 2.979 | -1 |
| 2.98 | -0.999 |
| 2.981 | -0.998 |
| 2.982 | -0.997 |
| 2.983 | -0.996 |
| 2.984 | -0.996 |
| 2.985 | -0.995 |
| 2.986 | -0.994 |
| 2.987 | -0.993 |
| 2.988 | -0.992 |
| 2.989 | -0.992 |
| 2.99 | -0.991 |
| 2.991 | -0.99 |
| 2.992 | -0.989 |
| 2.993 | -0.988 |
| 2.994 | -0.987 |
| 2.995 | -0.987 |
| 2.996 | -0.986 |
| 2.997 | -0.985 |
| 2.998 | -0.984 |
| 2.999 | -0.983 |
| 3.0 | -0.982 |
| 3.001 | -0.982 |
| 3.002 | -0.981 |
| 3.003 | -0.98 |
| 3.004 | -0.979 |
| 3.005 | -0.978 |
| 3.006 | -0.977 |
| 3.007 | -0.977 |
| 3.008 | -0.976 |
| 3.009 | -0.975 |
| 3.01 | -0.974 |
| 3.011 | -0.973 |
| 3.012 | -0.973 |
| 3.013 | -0.972 |
| 3.014 | -0.971 |
| 3.015 | -0.97 |
| 3.016 | -0.969 |
| 3.017 | -0.968 |
| 3.018 | -0.968 |
| 3.019 | -0.967 |
| 3.02 | -0.966 |
| 3.021 | -0.965 |
| 3.022 | -0.964 |
| 3.023 | -0.963 |
| 3.024 | -0.963 |
| 3.025 | -0.962 |
| 3.026 | -0.961 |
| 3.027 | -0.96 |
| 3.028 | -0.959 |
| 3.029 | -0.958 |
| 3.03 | -0.958 |
| 3.031 | -0.957 |
| 3.032 | -0.956 |
| 3.033 | -0.955 |
| 3.034 | -0.954 |
| 3.035 | -0.953 |
| 3.036 | -0.952 |
| 3.037 | -0.952 |
| 3.038 | -0.951 |
| 3.039 | -0.95 |
| 3.04 | -0.949 |
| 3.041 | -0.948 |
| 3.042 | -0.947 |
| 3.043 | -0.947 |
| 3.044 | -0.946 |
| 3.045 | -0.945 |
| 3.046 | -0.944 |
| 3.047 | -0.943 |
| 3.048 | -0.942 |
| 3.049 | -0.942 |
| 3.05 | -0.941 |
| 3.051 | -0.94 |
| 3.052 | -0.939 |
| 3.053 | -0.938 |
| 3.054 | -0.937 |
| 3.055 | -0.937 |
| 3.056 | -0.936 |
| 3.057 | -0.935 |
| 3.058 | -0.934 |
| 3.059 | -0.933 |
| 3.06 | -0.932 |
| 3.061 | -0.931 |
| 3.062 | -0.931 |
| 3.063 | -0.93 |
| 3.064 | -0.929 |
| 3.065 | -0.928 |
| 3.066 | -0.927 |
| 3.067 | -0.926 |
| 3.068 | -0.926 |
| 3.069 | -0.925 |
| 3.07 | -0.924 |
| 3.071 | -0.923 |
| 3.072 | -0.922 |
| 3.073 | -0.921 |
| 3.074 | -0.92 |
| 3.075 | -0.92 |
| 3.076 | -0.919 |
| 3.077 | -0.918 |
| 3.078 | -0.917 |
| 3.079 | -0.916 |
| 3.08 | -0.915 |
| 3.081 | -0.915 |
| 3.082 | -0.914 |
| 3.083 | -0.913 |
| 3.084 | -0.912 |
| 3.085 | -0.911 |
| 3.086 | -0.91 |
| 3.087 | -0.909 |
| 3.088 | -0.909 |
| 3.089 | -0.908 |
| 3.09 | -0.907 |
| 3.091 | -0.906 |
| 3.092 | -0.905 |
| 3.093 | -0.904 |
| 3.094 | -0.903 |
| 3.095 | -0.903 |
| 3.096 | -0.902 |
| 3.097 | -0.901 |
| 3.098 | -0.9 |
| 3.099 | -0.899 |
| 3.1 | -0.898 |
| 3.101 | -0.897 |
| 3.102 | -0.897 |
| 3.103 | -0.896 |
| 3.104 | -0.895 |
| 3.105 | -0.894 |
| 3.106 | -0.893 |
| 3.107 | -0.892 |
| 3.108 | -0.891 |
| 3.109 | -0.891 |
| 3.11 | -0.89 |
| 3.111 | -0.889 |
| 3.112 | -0.888 |
| 3.113 | -0.887 |
| 3.114 | -0.886 |
| 3.115 | -0.885 |
| 3.116 | -0.885 |
| 3.117 | -0.884 |
| 3.118 | -0.883 |
| 3.119 | -0.882 |
| 3.12 | -0.881 |
| 3.121 | -0.88 |
| 3.122 | -0.879 |
| 3.123 | -0.879 |
| 3.124 | -0.878 |
| 3.125 | -0.877 |
| 3.126 | -0.876 |
| 3.127 | -0.875 |
| 3.128 | -0.874 |
| 3.129 | -0.873 |
| 3.13 | -0.872 |
| 3.131 | -0.872 |
| 3.132 | -0.871 |
| 3.133 | -0.87 |
| 3.134 | -0.869 |
| 3.135 | -0.868 |
| 3.136 | -0.867 |
| 3.137 | -0.866 |
| 3.138 | -0.866 |
| 3.139 | -0.865 |
| 3.14 | -0.864 |
| 3.141 | -0.863 |
| 3.142 | -0.862 |
| 3.143 | -0.861 |
| 3.144 | -0.86 |
| 3.145 | -0.859 |
| 3.146 | -0.859 |
| 3.147 | -0.858 |
| 3.148 | -0.857 |
| 3.149 | -0.856 |
| 3.15 | -0.855 |
| 3.151 | -0.854 |
| 3.152 | -0.853 |
| 3.153 | -0.853 |
| 3.154 | -0.852 |
| 3.155 | -0.851 |
| 3.156 | -0.85 |
| 3.157 | -0.849 |
| 3.158 | -0.848 |
| 3.159 | -0.847 |
| 3.16 | -0.846 |
| 3.161 | -0.846 |
| 3.162 | -0.845 |
| 3.163 | -0.844 |
| 3.164 | -0.843 |
| 3.165 | -0.842 |
| 3.166 | -0.841 |
| 3.167 | -0.84 |
| 3.168 | -0.839 |
| 3.169 | -0.839 |
| 3.17 | -0.838 |
| 3.171 | -0.837 |
| 3.172 | -0.836 |
| 3.173 | -0.835 |
| 3.174 | -0.834 |
| 3.175 | -0.833 |
| 3.176 | -0.832 |
| 3.177 | -0.832 |
| 3.178 | -0.831 |
| 3.179 | -0.83 |
| 3.18 | -0.829 |
| 3.181 | -0.828 |
| 3.182 | -0.827 |
| 3.183 | -0.826 |
| 3.184 | -0.825 |
| 3.185 | -0.824 |
| 3.186 | -0.824 |
| 3.187 | -0.823 |
| 3.188 | -0.822 |
| 3.189 | -0.821 |
| 3.19 | -0.82 |
| 3.191 | -0.819 |
| 3.192 | -0.818 |
| 3.193 | -0.817 |
| 3.194 | -0.817 |
| 3.195 | -0.816 |
| 3.196 | -0.815 |
| 3.197 | -0.814 |
| 3.198 | -0.813 |
| 3.199 | -0.812 |
| 3.2 | -0.811 |
| 3.201 | -0.81 |
| 3.202 | -0.809 |
| 3.203 | -0.809 |
| 3.204 | -0.808 |
| 3.205 | -0.807 |
| 3.206 | -0.806 |
| 3.207 | -0.805 |
| 3.208 | -0.804 |
| 3.209 | -0.803 |
| 3.21 | -0.802 |
| 3.211 | -0.801 |
| 3.212 | -0.801 |
| 3.213 | -0.8 |
| 3.214 | -0.799 |
| 3.215 | -0.798 |
| 3.216 | -0.797 |
| 3.217 | -0.796 |
| 3.218 | -0.795 |
| 3.219 | -0.794 |
| 3.22 | -0.793 |
| 3.221 | -0.793 |
| 3.222 | -0.792 |
| 3.223 | -0.791 |
| 3.224 | -0.79 |
| 3.225 | -0.789 |
| 3.226 | -0.788 |
| 3.227 | -0.787 |
| 3.228 | -0.786 |
| 3.229 | -0.785 |
| 3.23 | -0.784 |
| 3.231 | -0.784 |
| 3.232 | -0.783 |
| 3.233 | -0.782 |
| 3.234 | -0.781 |
| 3.235 | -0.78 |
| 3.236 | -0.779 |
| 3.237 | -0.778 |
| 3.238 | -0.777 |
| 3.239 | -0.776 |
| 3.24 | -0.776 |
| 3.241 | -0.775 |
| 3.242 | -0.774 |
| 3.243 | -0.773 |
| 3.244 | -0.772 |
| 3.245 | -0.771 |
| 3.246 | -0.77 |
| 3.247 | -0.769 |
| 3.248 | -0.768 |
| 3.249 | -0.767 |
| 3.25 | -0.767 |
| 3.251 | -0.766 |
| 3.252 | -0.765 |
| 3.253 | -0.764 |
| 3.254 | -0.763 |
| 3.255 | -0.762 |
| 3.256 | -0.761 |
| 3.257 | -0.76 |
| 3.258 | -0.759 |
| 3.259 | -0.758 |
| 3.26 | -0.758 |
| 3.261 | -0.757 |
| 3.262 | -0.756 |
| 3.263 | -0.755 |
| 3.264 | -0.754 |
| 3.265 | -0.753 |
| 3.266 | -0.752 |
| 3.267 | -0.751 |
| 3.268 | -0.75 |
| 3.269 | -0.749 |
| 3.27 | -0.748 |
| 3.271 | -0.748 |
| 3.272 | -0.747 |
| 3.273 | -0.746 |
| 3.274 | -0.745 |
| 3.275 | -0.744 |
| 3.276 | -0.743 |
| 3.277 | -0.742 |
| 3.278 | -0.741 |
| 3.279 | -0.74 |
| 3.28 | -0.739 |
| 3.281 | -0.738 |
| 3.282 | -0.738 |
| 3.283 | -0.737 |
| 3.284 | -0.736 |
| 3.285 | -0.735 |
| 3.286 | -0.734 |
| 3.287 | -0.733 |
| 3.288 | -0.732 |
| 3.289 | -0.731 |
| 3.29 | -0.73 |
| 3.291 | -0.729 |
| 3.292 | -0.728 |
| 3.293 | -0.727 |
| 3.294 | -0.727 |
| 3.295 | -0.726 |
| 3.296 | -0.725 |
| 3.297 | -0.724 |
| 3.298 | -0.723 |
| 3.299 | -0.722 |
| 3.3 | -0.721 |
| 3.301 | -0.72 |
| 3.302 | -0.719 |
| 3.303 | -0.718 |
| 3.304 | -0.717 |
| 3.305 | -0.716 |
| 3.306 | -0.716 |
| 3.307 | -0.715 |
| 3.308 | -0.714 |
| 3.309 | -0.713 |
| 3.31 | -0.712 |
| 3.311 | -0.711 |
| 3.312 | -0.71 |
| 3.313 | -0.709 |
| 3.314 | -0.708 |
| 3.315 | -0.707 |
| 3.316 | -0.706 |
| 3.317 | -0.705 |
| 3.318 | -0.705 |
| 3.319 | -0.704 |
| 3.32 | -0.703 |
| 3.321 | -0.702 |
| 3.322 | -0.701 |
| 3.323 | -0.7 |
| 3.324 | -0.699 |
| 3.325 | -0.698 |
| 3.326 | -0.697 |
| 3.327 | -0.696 |
| 3.328 | -0.695 |
| 3.329 | -0.694 |
| 3.33 | -0.693 |
| 3.331 | -0.693 |
| 3.332 | -0.692 |
| 3.333 | -0.691 |
| 3.334 | -0.69 |
| 3.335 | -0.689 |
| 3.336 | -0.688 |
| 3.337 | -0.687 |
| 3.338 | -0.686 |
| 3.339 | -0.685 |
| 3.34 | -0.684 |
| 3.341 | -0.683 |
| 3.342 | -0.682 |
| 3.343 | -0.681 |
| 3.344 | -0.68 |
| 3.345 | -0.68 |
| 3.346 | -0.679 |
| 3.347 | -0.678 |
| 3.348 | -0.677 |
| 3.349 | -0.676 |
| 3.35 | -0.675 |
| 3.351 | -0.674 |
| 3.352 | -0.673 |
| 3.353 | -0.672 |
| 3.354 | -0.671 |
| 3.355 | -0.67 |
| 3.356 | -0.669 |
| 3.357 | -0.668 |
| 3.358 | -0.667 |
| 3.359 | -0.666 |
| 3.36 | -0.666 |
| 3.361 | -0.665 |
| 3.362 | -0.664 |
| 3.363 | -0.663 |
| 3.364 | -0.662 |
| 3.365 | -0.661 |
| 3.366 | -0.66 |
| 3.367 | -0.659 |
| 3.368 | -0.658 |
| 3.369 | -0.657 |
| 3.37 | -0.656 |
| 3.371 | -0.655 |
| 3.372 | -0.654 |
| 3.373 | -0.653 |
| 3.374 | -0.652 |
| 3.375 | -0.651 |
| 3.376 | -0.651 |
| 3.377 | -0.65 |
| 3.378 | -0.649 |
| 3.379 | -0.648 |
| 3.38 | -0.647 |
| 3.381 | -0.646 |
| 3.382 | -0.645 |
| 3.383 | -0.644 |
| 3.384 | -0.643 |
| 3.385 | -0.642 |
| 3.386 | -0.641 |
| 3.387 | -0.64 |
| 3.388 | -0.639 |
| 3.389 | -0.638 |
| 3.39 | -0.637 |
| 3.391 | -0.636 |
| 3.392 | -0.635 |
| 3.393 | -0.634 |
| 3.394 | -0.634 |
| 3.395 | -0.633 |
| 3.396 | -0.632 |
| 3.397 | -0.631 |
| 3.398 | -0.63 |
| 3.399 | -0.629 |
| 3.4 | -0.628 |
| 3.401 | -0.627 |
| 3.402 | -0.626 |
| 3.403 | -0.625 |
| 3.404 | -0.624 |
| 3.405 | -0.623 |
| 3.406 | -0.622 |
| 3.407 | -0.621 |
| 3.408 | -0.62 |
| 3.409 | -0.619 |
| 3.41 | -0.618 |
| 3.411 | -0.617 |
| 3.412 | -0.616 |
| 3.413 | -0.616 |
| 3.414 | -0.615 |
| 3.415 | -0.614 |
| 3.416 | -0.613 |
| 3.417 | -0.612 |
| 3.418 | -0.611 |
| 3.419 | -0.61 |
| 3.42 | -0.609 |
| 3.421 | -0.608 |
| 3.422 | -0.607 |
| 3.423 | -0.606 |
| 3.424 | -0.605 |
| 3.425 | -0.604 |
| 3.426 | -0.603 |
| 3.427 | -0.602 |
| 3.428 | -0.601 |
| 3.429 | -0.6 |
| 3.43 | -0.599 |
| 3.431 | -0.598 |
| 3.432 | -0.597 |
| 3.433 | -0.596 |
| 3.434 | -0.595 |
| 3.435 | -0.594 |
| 3.436 | -0.594 |
| 3.437 | -0.593 |
| 3.438 | -0.592 |
| 3.439 | -0.591 |
| 3.44 | -0.59 |
| 3.441 | -0.589 |
| 3.442 | -0.588 |
| 3.443 | -0.587 |
| 3.444 | -0.586 |
| 3.445 | -0.585 |
| 3.446 | -0.584 |
| 3.447 | -0.583 |
| 3.448 | -0.582 |
| 3.449 | -0.581 |
| 3.45 | -0.58 |
| 3.451 | -0.579 |
| 3.452 | -0.578 |
| 3.453 | -0.577 |
| 3.454 | -0.576 |
| 3.455 | -0.575 |
| 3.456 | -0.574 |
| 3.457 | -0.573 |
| 3.458 | -0.572 |
| 3.459 | -0.571 |
| 3.46 | -0.57 |
| 3.461 | -0.569 |
| 3.462 | -0.568 |
| 3.463 | -0.568 |
| 3.464 | -0.567 |
| 3.465 | -0.566 |
| 3.466 | -0.565 |
| 3.467 | -0.564 |
| 3.468 | -0.563 |
| 3.469 | -0.562 |
| 3.47 | -0.561 |
| 3.471 | -0.56 |
| 3.472 | -0.559 |
| 3.473 | -0.558 |
| 3.474 | -0.557 |
| 3.475 | -0.556 |
| 3.476 | -0.555 |
| 3.477 | -0.554 |
| 3.478 | -0.553 |
| 3.479 | -0.552 |
| 3.48 | -0.551 |
| 3.481 | -0.55 |
| 3.482 | -0.549 |
| 3.483 | -0.548 |
| 3.484 | -0.547 |
| 3.485 | -0.546 |
| 3.486 | -0.545 |
| 3.487 | -0.544 |
| 3.488 | -0.543 |
| 3.489 | -0.542 |
| 3.49 | -0.541 |
| 3.491 | -0.54 |
| 3.492 | -0.539 |
| 3.493 | -0.538 |
| 3.494 | -0.537 |
| 3.495 | -0.536 |
| 3.496 | -0.535 |
| 3.497 | -0.534 |
| 3.498 | -0.533 |
| 3.499 | -0.532 |
| 3.5 | -0.531 |
| 3.501 | -0.53 |
| 3.502 | -0.53 |
| 3.503 | -0.529 |
| 3.504 | -0.528 |
| 3.505 | -0.527 |
| 3.506 | -0.526 |
| 3.507 | -0.525 |
| 3.508 | -0.524 |
| 3.509 | -0.523 |
| 3.51 | -0.522 |
| 3.511 | -0.521 |
| 3.512 | -0.52 |
| 3.513 | -0.519 |
| 3.514 | -0.518 |
| 3.515 | -0.517 |
| 3.516 | -0.516 |
| 3.517 | -0.515 |
| 3.518 | -0.514 |
| 3.519 | -0.513 |
| 3.52 | -0.512 |
| 3.521 | -0.511 |
| 3.522 | -0.51 |
| 3.523 | -0.509 |
| 3.524 | -0.508 |
| 3.525 | -0.507 |
| 3.526 | -0.506 |
| 3.527 | -0.505 |
| 3.528 | -0.504 |
| 3.529 | -0.503 |
| 3.53 | -0.502 |
| 3.531 | -0.501 |
| 3.532 | -0.5 |
| 3.533 | -0.499 |
| 3.534 | -0.498 |
| 3.535 | -0.497 |
| 3.536 | -0.496 |
| 3.537 | -0.495 |
| 3.538 | -0.494 |
| 3.539 | -0.493 |
| 3.54 | -0.492 |
| 3.541 | -0.491 |
| 3.542 | -0.49 |
| 3.543 | -0.489 |
| 3.544 | -0.488 |
| 3.545 | -0.487 |
| 3.546 | -0.486 |
| 3.547 | -0.485 |
| 3.548 | -0.484 |
| 3.549 | -0.483 |
| 3.55 | -0.482 |
| 3.551 | -0.481 |
| 3.552 | -0.48 |
| 3.553 | -0.479 |
| 3.554 | -0.478 |
| 3.555 | -0.477 |
| 3.556 | -0.476 |
| 3.557 | -0.475 |
| 3.558 | -0.474 |
| 3.559 | -0.473 |
| 3.56 | -0.472 |
| 3.561 | -0.471 |
| 3.562 | -0.47 |
| 3.563 | -0.469 |
| 3.564 | -0.468 |
| 3.565 | -0.467 |
| 3.566 | -0.466 |
| 3.567 | -0.465 |
| 3.568 | -0.464 |
| 3.569 | -0.463 |
| 3.57 | -0.462 |
| 3.571 | -0.461 |
| 3.572 | -0.46 |
| 3.573 | -0.459 |
| 3.574 | -0.458 |
| 3.575 | -0.457 |
| 3.576 | -0.456 |
| 3.577 | -0.455 |
| 3.578 | -0.454 |
| 3.579 | -0.453 |
| 3.58 | -0.452 |
| 3.581 | -0.451 |
| 3.582 | -0.45 |
| 3.583 | -0.449 |
| 3.584 | -0.448 |
| 3.585 | -0.447 |
| 3.586 | -0.446 |
| 3.587 | -0.445 |
| 3.588 | -0.444 |
| 3.589 | -0.443 |
| 3.59 | -0.442 |
| 3.591 | -0.441 |
| 3.592 | -0.44 |
| 3.593 | -0.439 |
| 3.594 | -0.438 |
| 3.595 | -0.437 |
| 3.596 | -0.436 |
| 3.597 | -0.435 |
| 3.598 | -0.434 |
| 3.599 | -0.433 |
| 3.6 | -0.432 |
| 3.601 | -0.431 |
| 3.602 | -0.43 |
| 3.603 | -0.429 |
| 3.604 | -0.428 |
| 3.605 | -0.427 |
| 3.606 | -0.426 |
| 3.607 | -0.425 |
| 3.608 | -0.424 |
| 3.609 | -0.423 |
| 3.61 | -0.422 |
| 3.611 | -0.421 |
| 3.612 | -0.42 |
| 3.613 | -0.419 |
| 3.614 | -0.418 |
| 3.615 | -0.417 |
| 3.616 | -0.416 |
| 3.617 | -0.415 |
| 3.618 | -0.414 |
| 3.619 | -0.413 |
| 3.62 | -0.412 |
| 3.621 | -0.411 |
| 3.622 | -0.41 |
| 3.623 | -0.408 |
| 3.624 | -0.407 |
| 3.625 | -0.406 |
| 3.626 | -0.405 |
| 3.627 | -0.404 |
| 3.628 | -0.403 |
| 3.629 | -0.402 |
| 3.63 | -0.401 |
| 3.631 | -0.4 |
| 3.632 | -0.399 |
| 3.633 | -0.398 |
| 3.634 | -0.397 |
| 3.635 | -0.396 |
| 3.636 | -0.395 |
| 3.637 | -0.394 |
| 3.638 | -0.393 |
| 3.639 | -0.392 |
| 3.64 | -0.391 |
| 3.641 | -0.39 |
| 3.642 | -0.389 |
| 3.643 | -0.388 |
| 3.644 | -0.387 |
| 3.645 | -0.386 |
| 3.646 | -0.385 |
| 3.647 | -0.384 |
| 3.648 | -0.383 |
| 3.649 | -0.382 |
| 3.65 | -0.381 |
| 3.651 | -0.38 |
| 3.652 | -0.379 |
| 3.653 | -0.378 |
| 3.654 | -0.377 |
| 3.655 | -0.376 |
| 3.656 | -0.375 |
| 3.657 | -0.374 |
| 3.658 | -0.373 |
| 3.659 | -0.372 |
| 3.66 | -0.371 |
| 3.661 | -0.37 |
| 3.662 | -0.368 |
| 3.663 | -0.367 |
| 3.664 | -0.366 |
| 3.665 | -0.365 |
| 3.666 | -0.364 |
| 3.667 | -0.363 |
| 3.668 | -0.362 |
| 3.669 | -0.361 |
| 3.67 | -0.36 |
| 3.671 | -0.359 |
| 3.672 | -0.358 |
| 3.673 | -0.357 |
| 3.674 | -0.356 |
| 3.675 | -0.355 |
| 3.676 | -0.354 |
| 3.677 | -0.353 |
| 3.678 | -0.352 |
| 3.679 | -0.351 |
| 3.68 | -0.35 |
| 3.681 | -0.349 |
| 3.682 | -0.348 |
| 3.683 | -0.347 |
| 3.684 | -0.346 |
| 3.685 | -0.345 |
| 3.686 | -0.344 |
| 3.687 | -0.343 |
| 3.688 | -0.342 |
| 3.689 | -0.34 |
| 3.69 | -0.339 |
| 3.691 | -0.338 |
| 3.692 | -0.337 |
| 3.693 | -0.336 |
| 3.694 | -0.335 |
| 3.695 | -0.334 |
| 3.696 | -0.333 |
| 3.697 | -0.332 |
| 3.698 | -0.331 |
| 3.699 | -0.33 |
| 3.7 | -0.329 |
| 3.701 | -0.328 |
| 3.702 | -0.327 |
| 3.703 | -0.326 |
| 3.704 | -0.325 |
| 3.705 | -0.324 |
| 3.706 | -0.323 |
| 3.707 | -0.322 |
| 3.708 | -0.321 |
| 3.709 | -0.32 |
| 3.71 | -0.319 |
| 3.711 | -0.317 |
| 3.712 | -0.316 |
| 3.713 | -0.315 |
| 3.714 | -0.314 |
| 3.715 | -0.313 |
| 3.716 | -0.312 |
| 3.717 | -0.311 |
| 3.718 | -0.31 |
| 3.719 | -0.309 |
| 3.72 | -0.308 |
| 3.721 | -0.307 |
| 3.722 | -0.306 |
| 3.723 | -0.305 |
| 3.724 | -0.304 |
| 3.725 | -0.303 |
| 3.726 | -0.302 |
| 3.727 | -0.301 |
| 3.728 | -0.3 |
| 3.729 | -0.299 |
| 3.73 | -0.297 |
| 3.731 | -0.296 |
| 3.732 | -0.295 |
| 3.733 | -0.294 |
| 3.734 | -0.293 |
| 3.735 | -0.292 |
| 3.736 | -0.291 |
| 3.737 | -0.29 |
| 3.738 | -0.289 |
| 3.739 | -0.288 |
| 3.74 | -0.287 |
| 3.741 | -0.286 |
| 3.742 | -0.285 |
| 3.743 | -0.284 |
| 3.744 | -0.283 |
| 3.745 | -0.282 |
| 3.746 | -0.281 |
| 3.747 | -0.279 |
| 3.748 | -0.278 |
| 3.749 | -0.277 |
| 3.75 | -0.276 |
| 3.751 | -0.275 |
| 3.752 | -0.274 |
| 3.753 | -0.273 |
| 3.754 | -0.272 |
| 3.755 | -0.271 |
| 3.756 | -0.27 |
| 3.757 | -0.269 |
| 3.758 | -0.268 |
| 3.759 | -0.267 |
| 3.76 | -0.266 |
| 3.761 | -0.265 |
| 3.762 | -0.264 |
| 3.763 | -0.262 |
| 3.764 | -0.261 |
| 3.765 | -0.26 |
| 3.766 | -0.259 |
| 3.767 | -0.258 |
| 3.768 | -0.257 |
| 3.769 | -0.256 |
| 3.77 | -0.255 |
| 3.771 | -0.254 |
| 3.772 | -0.253 |
| 3.773 | -0.252 |
| 3.774 | -0.251 |
| 3.775 | -0.25 |
| 3.776 | -0.249 |
| 3.777 | -0.247 |
| 3.778 | -0.246 |
| 3.779 | -0.245 |
| 3.78 | -0.244 |
| 3.781 | -0.243 |
| 3.782 | -0.242 |
| 3.783 | -0.241 |
| 3.784 | -0.24 |
| 3.785 | -0.239 |
| 3.786 | -0.238 |
| 3.787 | -0.237 |
| 3.788 | -0.236 |
| 3.789 | -0.235 |
| 3.79 | -0.234 |
| 3.791 | -0.232 |
| 3.792 | -0.231 |
| 3.793 | -0.23 |
| 3.794 | -0.229 |
| 3.795 | -0.228 |
| 3.796 | -0.227 |
| 3.797 | -0.226 |
| 3.798 | -0.225 |
| 3.799 | -0.224 |
| 3.8 | -0.223 |
| 3.801 | -0.222 |
| 3.802 | -0.221 |
| 3.803 | -0.22 |
| 3.804 | -0.218 |
| 3.805 | -0.217 |
| 3.806 | -0.216 |
| 3.807 | -0.215 |
| 3.808 | -0.214 |
| 3.809 | -0.213 |
| 3.81 | -0.212 |
| 3.811 | -0.211 |
| 3.812 | -0.21 |
| 3.813 | -0.209 |
| 3.814 | -0.208 |
| 3.815 | -0.207 |
| 3.816 | -0.205 |
| 3.817 | -0.204 |
| 3.818 | -0.203 |
| 3.819 | -0.202 |
| 3.82 | -0.201 |
| 3.821 | -0.2 |
| 3.822 | -0.199 |
| 3.823 | -0.198 |
| 3.824 | -0.197 |
| 3.825 | -0.196 |
| 3.826 | -0.195 |
| 3.827 | -0.193 |
| 3.828 | -0.192 |
| 3.829 | -0.191 |
| 3.83 | -0.19 |
| 3.831 | -0.189 |
| 3.832 | -0.188 |
| 3.833 | -0.187 |
| 3.834 | -0.186 |
| 3.835 | -0.185 |
| 3.836 | -0.184 |
| 3.837 | -0.183 |
| 3.838 | -0.182 |
| 3.839 | -0.18 |
| 3.84 | -0.179 |
| 3.841 | -0.178 |
| 3.842 | -0.177 |
| 3.843 | -0.176 |
| 3.844 | -0.175 |
| 3.845 | -0.174 |
| 3.846 | -0.173 |
| 3.847 | -0.172 |
| 3.848 | -0.171 |
| 3.849 | -0.169 |
| 3.85 | -0.168 |
| 3.851 | -0.167 |
| 3.852 | -0.166 |
| 3.853 | -0.165 |
| 3.854 | -0.164 |
| 3.855 | -0.163 |
| 3.856 | -0.162 |
| 3.857 | -0.161 |
| 3.858 | -0.16 |
| 3.859 | -0.158 |
| 3.86 | -0.157 |
| 3.861 | -0.156 |
| 3.862 | -0.155 |
| 3.863 | -0.154 |
| 3.864 | -0.153 |
| 3.865 | -0.152 |
| 3.866 | -0.151 |
| 3.867 | -0.15 |
| 3.868 | -0.149 |
| 3.869 | -0.147 |
| 3.87 | -0.146 |
| 3.871 | -0.145 |
| 3.872 | -0.144 |
| 3.873 | -0.143 |
| 3.874 | -0.142 |
| 3.875 | -0.141 |
| 3.876 | -0.14 |
| 3.877 | -0.139 |
| 3.878 | -0.138 |
| 3.879 | -0.136 |
| 3.88 | -0.135 |
| 3.881 | -0.134 |
| 3.882 | -0.133 |
| 3.883 | -0.132 |
| 3.884 | -0.131 |
| 3.885 | -0.13 |
| 3.886 | -0.129 |
| 3.887 | -0.128 |
| 3.888 | -0.126 |
| 3.889 | -0.125 |
| 3.89 | -0.124 |
| 3.891 | -0.123 |
| 3.892 | -0.122 |
| 3.893 | -0.121 |
| 3.894 | -0.12 |
| 3.895 | -0.119 |
| 3.896 | -0.118 |
| 3.897 | -0.116 |
| 3.898 | -0.115 |
| 3.899 | -0.114 |
| 3.9 | -0.113 |
| 3.901 | -0.112 |
| 3.902 | -0.111 |
| 3.903 | -0.11 |
| 3.904 | -0.109 |
| 3.905 | -0.108 |
| 3.906 | -0.106 |
| 3.907 | -0.105 |
| 3.908 | -0.104 |
| 3.909 | -0.103 |
| 3.91 | -0.102 |
| 3.911 | -0.101 |
| 3.912 | -0.1 |
| 3.913 | -0.099 |
| 3.914 | -0.097 |
| 3.915 | -0.096 |
| 3.916 | -0.095 |
| 3.917 | -0.094 |
| 3.918 | -0.093 |
| 3.919 | -0.092 |
| 3.92 | -0.091 |
| 3.921 | -0.09 |
| 3.922 | -0.089 |
| 3.923 | -0.087 |
| 3.924 | -0.086 |
| 3.925 | -0.085 |
| 3.926 | -0.084 |
| 3.927 | -0.083 |
| 3.928 | -0.082 |
| 3.929 | -0.081 |
| 3.93 | -0.08 |
| 3.931 | -0.078 |
| 3.932 | -0.077 |
| 3.933 | -0.076 |
| 3.934 | -0.075 |
| 3.935 | -0.074 |
| 3.936 | -0.073 |
| 3.937 | -0.072 |
| 3.938 | -0.071 |
| 3.939 | -0.069 |
| 3.94 | -0.068 |
| 3.941 | -0.067 |
| 3.942 | -0.066 |
| 3.943 | -0.065 |
| 3.944 | -0.064 |
| 3.945 | -0.063 |
| 3.946 | -0.062 |
| 3.947 | -0.06 |
| 3.948 | -0.059 |
| 3.949 | -0.058 |
| 3.95 | -0.057 |
| 3.951 | -0.056 |
| 3.952 | -0.055 |
| 3.953 | -0.054 |
| 3.954 | -0.052 |
| 3.955 | -0.051 |
| 3.956 | -0.05 |
| 3.957 | -0.049 |
| 3.958 | -0.048 |
| 3.959 | -0.047 |
| 3.96 | -0.046 |
| 3.961 | -0.045 |
| 3.962 | -0.043 |
| 3.963 | -0.042 |
| 3.964 | -0.041 |
| 3.965 | -0.04 |
| 3.966 | -0.039 |
| 3.967 | -0.038 |
| 3.968 | -0.037 |
| 3.969 | -0.035 |
| 3.97 | -0.034 |
| 3.971 | -0.033 |
| 3.972 | -0.032 |
| 3.973 | -0.031 |
| 3.974 | -0.03 |
| 3.975 | -0.029 |
| 3.976 | -0.027 |
| 3.977 | -0.026 |
| 3.978 | -0.025 |
| 3.979 | -0.024 |
| 3.98 | -0.023 |
| 3.981 | -0.022 |
| 3.982 | -0.021 |
| 3.983 | -0.019 |
| 3.984 | -0.018 |
| 3.985 | -0.017 |
| 3.986 | -0.016 |
| 3.987 | -0.015 |
| 3.988 | -0.014 |
| 3.989 | -0.013 |
| 3.99 | -0.011 |
| 3.991 | -0.01 |
| 3.992 | -0.009 |
| 3.993 | -0.008 |
| 3.994 | -0.007 |
| 3.995 | -0.006 |
| 3.996 | -0.005 |
| 3.997 | -0.003 |
| 3.998 | -0.002 |
| 3.999 | -0.001 |
| 4.0 | 0 |
| 4.001 | 0.001 |
| 4.002 | 0.002 |
| 4.003 | 0.003 |
| 4.004 | 0.005 |
| 4.005 | 0.006 |
| 4.006 | 0.007 |
| 4.007 | 0.008 |
| 4.008 | 0.009 |
| 4.009 | 0.01 |
| 4.01 | 0.012 |
| 4.011 | 0.013 |
| 4.012 | 0.014 |
| 4.013 | 0.015 |
| 4.014 | 0.016 |
| 4.015 | 0.017 |
| 4.016 | 0.018 |
| 4.017 | 0.02 |
| 4.018 | 0.021 |
| 4.019 | 0.022 |
| 4.02 | 0.023 |
| 4.021 | 0.024 |
| 4.022 | 0.025 |
| 4.023 | 0.027 |
| 4.024 | 0.028 |
| 4.025 | 0.029 |
| 4.026 | 0.03 |
| 4.027 | 0.031 |
| 4.028 | 0.032 |
| 4.029 | 0.033 |
| 4.03 | 0.035 |
| 4.031 | 0.036 |
| 4.032 | 0.037 |
| 4.033 | 0.038 |
| 4.034 | 0.039 |
| 4.035 | 0.04 |
| 4.036 | 0.042 |
| 4.037 | 0.043 |
| 4.038 | 0.044 |
| 4.039 | 0.045 |
| 4.04 | 0.046 |
| 4.041 | 0.047 |
| 4.042 | 0.049 |
| 4.043 | 0.05 |
| 4.044 | 0.051 |
| 4.045 | 0.052 |
| 4.046 | 0.053 |
| 4.047 | 0.054 |
| 4.048 | 0.056 |
| 4.049 | 0.057 |
| 4.05 | 0.058 |
| 4.051 | 0.059 |
| 4.052 | 0.06 |
| 4.053 | 0.061 |
| 4.054 | 0.063 |
| 4.055 | 0.064 |
| 4.056 | 0.065 |
| 4.057 | 0.066 |
| 4.058 | 0.067 |
| 4.059 | 0.068 |
| 4.06 | 0.07 |
| 4.061 | 0.071 |
| 4.062 | 0.072 |
| 4.063 | 0.073 |
| 4.064 | 0.074 |
| 4.065 | 0.075 |
| 4.066 | 0.077 |
| 4.067 | 0.078 |
| 4.068 | 0.079 |
| 4.069 | 0.08 |
| 4.07 | 0.081 |
| 4.071 | 0.082 |
| 4.072 | 0.084 |
| 4.073 | 0.085 |
| 4.074 | 0.086 |
| 4.075 | 0.087 |
| 4.076 | 0.088 |
| 4.077 | 0.09 |
| 4.078 | 0.091 |
| 4.079 | 0.092 |
| 4.08 | 0.093 |
| 4.081 | 0.094 |
| 4.082 | 0.095 |
| 4.083 | 0.097 |
| 4.084 | 0.098 |
| 4.085 | 0.099 |
| 4.086 | 0.1 |
| 4.087 | 0.101 |
| 4.088 | 0.102 |
| 4.089 | 0.104 |
| 4.09 | 0.105 |
| 4.091 | 0.106 |
| 4.092 | 0.107 |
| 4.093 | 0.108 |
| 4.094 | 0.11 |
| 4.095 | 0.111 |
| 4.096 | 0.112 |
| 4.097 | 0.113 |
| 4.098 | 0.114 |
| 4.099 | 0.115 |
| 4.1 | 0.117 |
| 4.101 | 0.118 |
| 4.102 | 0.119 |
| 4.103 | 0.12 |
| 4.104 | 0.121 |
| 4.105 | 0.123 |
| 4.106 | 0.124 |
| 4.107 | 0.125 |
| 4.108 | 0.126 |
| 4.109 | 0.127 |
| 4.11 | 0.129 |
| 4.111 | 0.13 |
| 4.112 | 0.131 |
| 4.113 | 0.132 |
| 4.114 | 0.133 |
| 4.115 | 0.134 |
| 4.116 | 0.136 |
| 4.117 | 0.137 |
| 4.118 | 0.138 |
| 4.119 | 0.139 |
| 4.12 | 0.14 |
| 4.121 | 0.142 |
| 4.122 | 0.143 |
| 4.123 | 0.144 |
| 4.124 | 0.145 |
| 4.125 | 0.146 |
| 4.126 | 0.148 |
| 4.127 | 0.149 |
| 4.128 | 0.15 |
| 4.129 | 0.151 |
| 4.13 | 0.152 |
| 4.131 | 0.154 |
| 4.132 | 0.155 |
| 4.133 | 0.156 |
| 4.134 | 0.157 |
| 4.135 | 0.158 |
| 4.136 | 0.16 |
| 4.137 | 0.161 |
| 4.138 | 0.162 |
| 4.139 | 0.163 |
| 4.14 | 0.164 |
| 4.141 | 0.166 |
| 4.142 | 0.167 |
| 4.143 | 0.168 |
| 4.144 | 0.169 |
| 4.145 | 0.17 |
| 4.146 | 0.172 |
| 4.147 | 0.173 |
| 4.148 | 0.174 |
| 4.149 | 0.175 |
| 4.15 | 0.176 |
| 4.151 | 0.178 |
| 4.152 | 0.179 |
| 4.153 | 0.18 |
| 4.154 | 0.181 |
| 4.155 | 0.182 |
| 4.156 | 0.184 |
| 4.157 | 0.185 |
| 4.158 | 0.186 |
| 4.159 | 0.187 |
| 4.16 | 0.188 |
| 4.161 | 0.19 |
| 4.162 | 0.191 |
| 4.163 | 0.192 |
| 4.164 | 0.193 |
| 4.165 | 0.194 |
| 4.166 | 0.196 |
| 4.167 | 0.197 |
| 4.168 | 0.198 |
| 4.169 | 0.199 |
| 4.17 | 0.2 |
| 4.171 | 0.202 |
| 4.172 | 0.203 |
| 4.173 | 0.204 |
| 4.174 | 0.205 |
| 4.175 | 0.207 |
| 4.176 | 0.208 |
| 4.177 | 0.209 |
| 4.178 | 0.21 |
| 4.179 | 0.211 |
| 4.18 | 0.213 |
| 4.181 | 0.214 |
| 4.182 | 0.215 |
| 4.183 | 0.216 |
| 4.184 | 0.217 |
| 4.185 | 0.219 |
| 4.186 | 0.22 |
| 4.187 | 0.221 |
| 4.188 | 0.222 |
| 4.189 | 0.224 |
| 4.19 | 0.225 |
| 4.191 | 0.226 |
| 4.192 | 0.227 |
| 4.193 | 0.228 |
| 4.194 | 0.23 |
| 4.195 | 0.231 |
| 4.196 | 0.232 |
| 4.197 | 0.233 |
| 4.198 | 0.235 |
| 4.199 | 0.236 |
| 4.2 | 0.237 |
| 4.201 | 0.238 |
| 4.202 | 0.239 |
| 4.203 | 0.241 |
| 4.204 | 0.242 |
| 4.205 | 0.243 |
| 4.206 | 0.244 |
| 4.207 | 0.246 |
| 4.208 | 0.247 |
| 4.209 | 0.248 |
| 4.21 | 0.249 |
| 4.211 | 0.25 |
| 4.212 | 0.252 |
| 4.213 | 0.253 |
| 4.214 | 0.254 |
| 4.215 | 0.255 |
| 4.216 | 0.257 |
| 4.217 | 0.258 |
| 4.218 | 0.259 |
| 4.219 | 0.26 |
| 4.22 | 0.261 |
| 4.221 | 0.263 |
| 4.222 | 0.264 |
| 4.223 | 0.265 |
| 4.224 | 0.266 |
| 4.225 | 0.268 |
| 4.226 | 0.269 |
| 4.227 | 0.27 |
| 4.228 | 0.271 |
| 4.229 | 0.273 |
| 4.23 | 0.274 |
| 4.231 | 0.275 |
| 4.232 | 0.276 |
| 4.233 | 0.277 |
| 4.234 | 0.279 |
| 4.235 | 0.28 |
| 4.236 | 0.281 |
| 4.237 | 0.282 |
| 4.238 | 0.284 |
| 4.239 | 0.285 |
| 4.24 | 0.286 |
| 4.241 | 0.287 |
| 4.242 | 0.289 |
| 4.243 | 0.29 |
| 4.244 | 0.291 |
| 4.245 | 0.292 |
| 4.246 | 0.294 |
| 4.247 | 0.295 |
| 4.248 | 0.296 |
| 4.249 | 0.297 |
| 4.25 | 0.298 |
| 4.251 | 0.3 |
| 4.252 | 0.301 |
| 4.253 | 0.302 |
| 4.254 | 0.303 |
| 4.255 | 0.305 |
| 4.256 | 0.306 |
| 4.257 | 0.307 |
| 4.258 | 0.308 |
| 4.259 | 0.31 |
| 4.26 | 0.311 |
| 4.261 | 0.312 |
| 4.262 | 0.313 |
| 4.263 | 0.315 |
| 4.264 | 0.316 |
| 4.265 | 0.317 |
| 4.266 | 0.318 |
| 4.267 | 0.32 |
| 4.268 | 0.321 |
| 4.269 | 0.322 |
| 4.27 | 0.323 |
| 4.271 | 0.325 |
| 4.272 | 0.326 |
| 4.273 | 0.327 |
| 4.274 | 0.328 |
| 4.275 | 0.33 |
| 4.276 | 0.331 |
| 4.277 | 0.332 |
| 4.278 | 0.333 |
| 4.279 | 0.335 |
| 4.28 | 0.336 |
| 4.281 | 0.337 |
| 4.282 | 0.338 |
| 4.283 | 0.34 |
| 4.284 | 0.341 |
| 4.285 | 0.342 |
| 4.286 | 0.343 |
| 4.287 | 0.345 |
| 4.288 | 0.346 |
| 4.289 | 0.347 |
| 4.29 | 0.348 |
| 4.291 | 0.35 |
| 4.292 | 0.351 |
| 4.293 | 0.352 |
| 4.294 | 0.353 |
| 4.295 | 0.355 |
| 4.296 | 0.356 |
| 4.297 | 0.357 |
| 4.298 | 0.358 |
| 4.299 | 0.36 |
| 4.3 | 0.361 |
| 4.301 | 0.362 |
| 4.302 | 0.363 |
| 4.303 | 0.365 |
| 4.304 | 0.366 |
| 4.305 | 0.367 |
| 4.306 | 0.368 |
| 4.307 | 0.37 |
| 4.308 | 0.371 |
| 4.309 | 0.372 |
| 4.31 | 0.374 |
| 4.311 | 0.375 |
| 4.312 | 0.376 |
| 4.313 | 0.377 |
| 4.314 | 0.379 |
| 4.315 | 0.38 |
| 4.316 | 0.381 |
| 4.317 | 0.382 |
| 4.318 | 0.384 |
| 4.319 | 0.385 |
| 4.32 | 0.386 |
| 4.321 | 0.387 |
| 4.322 | 0.389 |
| 4.323 | 0.39 |
| 4.324 | 0.391 |
| 4.325 | 0.393 |
| 4.326 | 0.394 |
| 4.327 | 0.395 |
| 4.328 | 0.396 |
| 4.329 | 0.398 |
| 4.33 | 0.399 |
| 4.331 | 0.4 |
| 4.332 | 0.401 |
| 4.333 | 0.403 |
| 4.334 | 0.404 |
| 4.335 | 0.405 |
| 4.336 | 0.406 |
| 4.337 | 0.408 |
| 4.338 | 0.409 |
| 4.339 | 0.41 |
| 4.34 | 0.412 |
| 4.341 | 0.413 |
| 4.342 | 0.414 |
| 4.343 | 0.415 |
| 4.344 | 0.417 |
| 4.345 | 0.418 |
| 4.346 | 0.419 |
| 4.347 | 0.42 |
| 4.348 | 0.422 |
| 4.349 | 0.423 |
| 4.35 | 0.424 |
| 4.351 | 0.426 |
| 4.352 | 0.427 |
| 4.353 | 0.428 |
| 4.354 | 0.429 |
| 4.355 | 0.431 |
| 4.356 | 0.432 |
| 4.357 | 0.433 |
| 4.358 | 0.435 |
| 4.359 | 0.436 |
| 4.36 | 0.437 |
| 4.361 | 0.438 |
| 4.362 | 0.44 |
| 4.363 | 0.441 |
| 4.364 | 0.442 |
| 4.365 | 0.444 |
| 4.366 | 0.445 |
| 4.367 | 0.446 |
| 4.368 | 0.447 |
| 4.369 | 0.449 |
| 4.37 | 0.45 |
| 4.371 | 0.451 |
| 4.372 | 0.453 |
| 4.373 | 0.454 |
| 4.374 | 0.455 |
| 4.375 | 0.456 |
| 4.376 | 0.458 |
| 4.377 | 0.459 |
| 4.378 | 0.46 |
| 4.379 | 0.462 |
| 4.38 | 0.463 |
| 4.381 | 0.464 |
| 4.382 | 0.465 |
| 4.383 | 0.467 |
| 4.384 | 0.468 |
| 4.385 | 0.469 |
| 4.386 | 0.471 |
| 4.387 | 0.472 |
| 4.388 | 0.473 |
| 4.389 | 0.474 |
| 4.39 | 0.476 |
| 4.391 | 0.477 |
| 4.392 | 0.478 |
| 4.393 | 0.48 |
| 4.394 | 0.481 |
| 4.395 | 0.482 |
| 4.396 | 0.483 |
| 4.397 | 0.485 |
| 4.398 | 0.486 |
| 4.399 | 0.487 |
| 4.4 | 0.489 |
| 4.401 | 0.49 |
| 4.402 | 0.491 |
| 4.403 | 0.493 |
| 4.404 | 0.494 |
| 4.405 | 0.495 |
| 4.406 | 0.496 |
| 4.407 | 0.498 |
| 4.408 | 0.499 |
| 4.409 | 0.5 |
| 4.41 | 0.502 |
| 4.411 | 0.503 |
| 4.412 | 0.504 |
| 4.413 | 0.506 |
| 4.414 | 0.507 |
| 4.415 | 0.508 |
| 4.416 | 0.509 |
| 4.417 | 0.511 |
| 4.418 | 0.512 |
| 4.419 | 0.513 |
| 4.42 | 0.515 |
| 4.421 | 0.516 |
| 4.422 | 0.517 |
| 4.423 | 0.519 |
| 4.424 | 0.52 |
| 4.425 | 0.521 |
| 4.426 | 0.523 |
| 4.427 | 0.524 |
| 4.428 | 0.525 |
| 4.429 | 0.526 |
| 4.43 | 0.528 |
| 4.431 | 0.529 |
| 4.432 | 0.53 |
| 4.433 | 0.532 |
| 4.434 | 0.533 |
| 4.435 | 0.534 |
| 4.436 | 0.536 |
| 4.437 | 0.537 |
| 4.438 | 0.538 |
| 4.439 | 0.54 |
| 4.44 | 0.541 |
| 4.441 | 0.542 |
| 4.442 | 0.543 |
| 4.443 | 0.545 |
| 4.444 | 0.546 |
| 4.445 | 0.547 |
| 4.446 | 0.549 |
| 4.447 | 0.55 |
| 4.448 | 0.551 |
| 4.449 | 0.553 |
| 4.45 | 0.554 |
| 4.451 | 0.555 |
| 4.452 | 0.557 |
| 4.453 | 0.558 |
| 4.454 | 0.559 |
| 4.455 | 0.561 |
| 4.456 | 0.562 |
| 4.457 | 0.563 |
| 4.458 | 0.565 |
| 4.459 | 0.566 |
| 4.46 | 0.567 |
| 4.461 | 0.568 |
| 4.462 | 0.57 |
| 4.463 | 0.571 |
| 4.464 | 0.572 |
| 4.465 | 0.574 |
| 4.466 | 0.575 |
| 4.467 | 0.576 |
| 4.468 | 0.578 |
| 4.469 | 0.579 |
| 4.47 | 0.58 |
| 4.471 | 0.582 |
| 4.472 | 0.583 |
| 4.473 | 0.584 |
| 4.474 | 0.586 |
| 4.475 | 0.587 |
| 4.476 | 0.588 |
| 4.477 | 0.59 |
| 4.478 | 0.591 |
| 4.479 | 0.592 |
| 4.48 | 0.594 |
| 4.481 | 0.595 |
| 4.482 | 0.596 |
| 4.483 | 0.598 |
| 4.484 | 0.599 |
| 4.485 | 0.6 |
| 4.486 | 0.602 |
| 4.487 | 0.603 |
| 4.488 | 0.604 |
| 4.489 | 0.606 |
| 4.49 | 0.607 |
| 4.491 | 0.608 |
| 4.492 | 0.61 |
| 4.493 | 0.611 |
| 4.494 | 0.612 |
| 4.495 | 0.614 |
| 4.496 | 0.615 |
| 4.497 | 0.616 |
| 4.498 | 0.618 |
| 4.499 | 0.619 |
| 4.5 | 0.62 |
| 4.501 | 0.622 |
| 4.502 | 0.623 |
| 4.503 | 0.624 |
| 4.504 | 0.626 |
| 4.505 | 0.627 |
| 4.506 | 0.628 |
| 4.507 | 0.63 |
| 4.508 | 0.631 |
| 4.509 | 0.632 |
| 4.51 | 0.634 |
| 4.511 | 0.635 |
| 4.512 | 0.636 |
| 4.513 | 0.638 |
| 4.514 | 0.639 |
| 4.515 | 0.64 |
| 4.516 | 0.642 |
| 4.517 | 0.643 |
| 4.518 | 0.644 |
| 4.519 | 0.646 |
| 4.52 | 0.647 |
| 4.521 | 0.648 |
| 4.522 | 0.65 |
| 4.523 | 0.651 |
| 4.524 | 0.652 |
| 4.525 | 0.654 |
| 4.526 | 0.655 |
| 4.527 | 0.656 |
| 4.528 | 0.658 |
| 4.529 | 0.659 |
| 4.53 | 0.66 |
| 4.531 | 0.662 |
| 4.532 | 0.663 |
| 4.533 | 0.665 |
| 4.534 | 0.666 |
| 4.535 | 0.667 |
| 4.536 | 0.669 |
| 4.537 | 0.67 |
| 4.538 | 0.671 |
| 4.539 | 0.673 |
| 4.54 | 0.674 |
| 4.541 | 0.675 |
| 4.542 | 0.677 |
| 4.543 | 0.678 |
| 4.544 | 0.679 |
| 4.545 | 0.681 |
| 4.546 | 0.682 |
| 4.547 | 0.683 |
| 4.548 | 0.685 |
| 4.549 | 0.686 |
| 4.55 | 0.688 |
| 4.551 | 0.689 |
| 4.552 | 0.69 |
| 4.553 | 0.692 |
| 4.554 | 0.693 |
| 4.555 | 0.694 |
| 4.556 | 0.696 |
| 4.557 | 0.697 |
| 4.558 | 0.698 |
| 4.559 | 0.7 |
| 4.56 | 0.701 |
| 4.561 | 0.702 |
| 4.562 | 0.704 |
| 4.563 | 0.705 |
| 4.564 | 0.707 |
| 4.565 | 0.708 |
| 4.566 | 0.709 |
| 4.567 | 0.711 |
| 4.568 | 0.712 |
| 4.569 | 0.713 |
| 4.57 | 0.715 |
| 4.571 | 0.716 |
| 4.572 | 0.717 |
| 4.573 | 0.719 |
| 4.574 | 0.72 |
| 4.575 | 0.722 |
| 4.576 | 0.723 |
| 4.577 | 0.724 |
| 4.578 | 0.726 |
| 4.579 | 0.727 |
| 4.58 | 0.728 |
| 4.581 | 0.73 |
| 4.582 | 0.731 |
| 4.583 | 0.732 |
| 4.584 | 0.734 |
| 4.585 | 0.735 |
| 4.586 | 0.737 |
| 4.587 | 0.738 |
| 4.588 | 0.739 |
| 4.589 | 0.741 |
| 4.59 | 0.742 |
| 4.591 | 0.743 |
| 4.592 | 0.745 |
| 4.593 | 0.746 |
| 4.594 | 0.748 |
| 4.595 | 0.749 |
| 4.596 | 0.75 |
| 4.597 | 0.752 |
| 4.598 | 0.753 |
| 4.599 | 0.754 |
| 4.6 | 0.756 |
| 4.601 | 0.757 |
| 4.602 | 0.759 |
| 4.603 | 0.76 |
| 4.604 | 0.761 |
| 4.605 | 0.763 |
| 4.606 | 0.764 |
| 4.607 | 0.765 |
| 4.608 | 0.767 |
| 4.609 | 0.768 |
| 4.61 | 0.77 |
| 4.611 | 0.771 |
| 4.612 | 0.772 |
| 4.613 | 0.774 |
| 4.614 | 0.775 |
| 4.615 | 0.776 |
| 4.616 | 0.778 |
| 4.617 | 0.779 |
| 4.618 | 0.781 |
| 4.619 | 0.782 |
| 4.62 | 0.783 |
| 4.621 | 0.785 |
| 4.622 | 0.786 |
| 4.623 | 0.788 |
| 4.624 | 0.789 |
| 4.625 | 0.79 |
| 4.626 | 0.792 |
| 4.627 | 0.793 |
| 4.628 | 0.794 |
| 4.629 | 0.796 |
| 4.63 | 0.797 |
| 4.631 | 0.799 |
| 4.632 | 0.8 |
| 4.633 | 0.801 |
| 4.634 | 0.803 |
| 4.635 | 0.804 |
| 4.636 | 0.806 |
| 4.637 | 0.807 |
| 4.638 | 0.808 |
| 4.639 | 0.81 |
| 4.64 | 0.811 |
| 4.641 | 0.812 |
| 4.642 | 0.814 |
| 4.643 | 0.815 |
| 4.644 | 0.817 |
| 4.645 | 0.818 |
| 4.646 | 0.819 |
| 4.647 | 0.821 |
| 4.648 | 0.822 |
| 4.649 | 0.824 |
| 4.65 | 0.825 |
| 4.651 | 0.826 |
| 4.652 | 0.828 |
| 4.653 | 0.829 |
| 4.654 | 0.831 |
| 4.655 | 0.832 |
| 4.656 | 0.833 |
| 4.657 | 0.835 |
| 4.658 | 0.836 |
| 4.659 | 0.838 |
| 4.66 | 0.839 |
| 4.661 | 0.84 |
| 4.662 | 0.842 |
| 4.663 | 0.843 |
| 4.664 | 0.845 |
| 4.665 | 0.846 |
| 4.666 | 0.847 |
| 4.667 | 0.849 |
| 4.668 | 0.85 |
| 4.669 | 0.852 |
| 4.67 | 0.853 |
| 4.671 | 0.854 |
| 4.672 | 0.856 |
| 4.673 | 0.857 |
| 4.674 | 0.859 |
| 4.675 | 0.86 |
| 4.676 | 0.861 |
| 4.677 | 0.863 |
| 4.678 | 0.864 |
| 4.679 | 0.866 |
| 4.68 | 0.867 |
| 4.681 | 0.868 |
| 4.682 | 0.87 |
| 4.683 | 0.871 |
| 4.684 | 0.873 |
| 4.685 | 0.874 |
| 4.686 | 0.876 |
| 4.687 | 0.877 |
| 4.688 | 0.878 |
| 4.689 | 0.88 |
| 4.69 | 0.881 |
| 4.691 | 0.883 |
| 4.692 | 0.884 |
| 4.693 | 0.885 |
| 4.694 | 0.887 |
| 4.695 | 0.888 |
| 4.696 | 0.89 |
| 4.697 | 0.891 |
| 4.698 | 0.892 |
| 4.699 | 0.894 |
| 4.7 | 0.895 |
| 4.701 | 0.897 |
| 4.702 | 0.898 |
| 4.703 | 0.9 |
| 4.704 | 0.901 |
| 4.705 | 0.902 |
| 4.706 | 0.904 |
| 4.707 | 0.905 |
| 4.708 | 0.907 |
| 4.709 | 0.908 |
| 4.71 | 0.909 |
| 4.711 | 0.911 |
| 4.712 | 0.912 |
| 4.713 | 0.914 |
| 4.714 | 0.915 |
| 4.715 | 0.917 |
| 4.716 | 0.918 |
| 4.717 | 0.919 |
| 4.718 | 0.921 |
| 4.719 | 0.922 |
| 4.72 | 0.924 |
| 4.721 | 0.925 |
| 4.722 | 0.927 |
| 4.723 | 0.928 |
| 4.724 | 0.929 |
| 4.725 | 0.931 |
| 4.726 | 0.932 |
| 4.727 | 0.934 |
| 4.728 | 0.935 |
| 4.729 | 0.936 |
| 4.73 | 0.938 |
| 4.731 | 0.939 |
| 4.732 | 0.941 |
| 4.733 | 0.942 |
| 4.734 | 0.944 |
| 4.735 | 0.945 |
| 4.736 | 0.946 |
| 4.737 | 0.948 |
| 4.738 | 0.949 |
| 4.739 | 0.951 |
| 4.74 | 0.952 |
| 4.741 | 0.954 |
| 4.742 | 0.955 |
| 4.743 | 0.957 |
| 4.744 | 0.958 |
| 4.745 | 0.959 |
| 4.746 | 0.961 |
| 4.747 | 0.962 |
| 4.748 | 0.964 |
| 4.749 | 0.965 |
| 4.75 | 0.967 |
| 4.751 | 0.968 |
| 4.752 | 0.969 |
| 4.753 | 0.971 |
| 4.754 | 0.972 |
| 4.755 | 0.974 |
| 4.756 | 0.975 |
| 4.757 | 0.977 |
| 4.758 | 0.978 |
| 4.759 | 0.98 |
| 4.76 | 0.981 |
| 4.761 | 0.982 |
| 4.762 | 0.984 |
| 4.763 | 0.985 |
| 4.764 | 0.987 |
| 4.765 | 0.988 |
| 4.766 | 0.99 |
| 4.767 | 0.991 |
| 4.768 | 0.992 |
| 4.769 | 0.994 |
| 4.77 | 0.995 |
| 4.771 | 0.997 |
| 4.772 | 0.998 |
| 4.773 | 1 |
| 4.774 | 1.001 |
| 4.775 | 1.003 |
| 4.776 | 1.004 |
| 4.777 | 1.005 |
| 4.778 | 1.007 |
| 4.779 | 1.008 |
| 4.78 | 1.01 |
| 4.781 | 1.011 |
| 4.782 | 1.013 |
| 4.783 | 1.014 |
| 4.784 | 1.016 |
| 4.785 | 1.017 |
| 4.786 | 1.019 |
| 4.787 | 1.02 |
| 4.788 | 1.021 |
| 4.789 | 1.023 |
| 4.79 | 1.024 |
| 4.791 | 1.026 |
| 4.792 | 1.027 |
| 4.793 | 1.029 |
| 4.794 | 1.03 |
| 4.795 | 1.032 |
| 4.796 | 1.033 |
| 4.797 | 1.035 |
| 4.798 | 1.036 |
| 4.799 | 1.037 |
| 4.8 | 1.039 |
| 4.801 | 1.04 |
| 4.802 | 1.042 |
| 4.803 | 1.043 |
| 4.804 | 1.045 |
| 4.805 | 1.046 |
| 4.806 | 1.048 |
| 4.807 | 1.049 |
| 4.808 | 1.051 |
| 4.809 | 1.052 |
| 4.81 | 1.053 |
| 4.811 | 1.055 |
| 4.812 | 1.056 |
| 4.813 | 1.058 |
| 4.814 | 1.059 |
| 4.815 | 1.061 |
| 4.816 | 1.062 |
| 4.817 | 1.064 |
| 4.818 | 1.065 |
| 4.819 | 1.067 |
| 4.82 | 1.068 |
| 4.821 | 1.07 |
| 4.822 | 1.071 |
| 4.823 | 1.072 |
| 4.824 | 1.074 |
| 4.825 | 1.075 |
| 4.826 | 1.077 |
| 4.827 | 1.078 |
| 4.828 | 1.08 |
| 4.829 | 1.081 |
| 4.83 | 1.083 |
| 4.831 | 1.084 |
| 4.832 | 1.086 |
| 4.833 | 1.087 |
| 4.834 | 1.089 |
| 4.835 | 1.09 |
| 4.836 | 1.092 |
| 4.837 | 1.093 |
| 4.838 | 1.095 |
| 4.839 | 1.096 |
| 4.84 | 1.097 |
| 4.841 | 1.099 |
| 4.842 | 1.1 |
| 4.843 | 1.102 |
| 4.844 | 1.103 |
| 4.845 | 1.105 |
| 4.846 | 1.106 |
| 4.847 | 1.108 |
| 4.848 | 1.109 |
| 4.849 | 1.111 |
| 4.85 | 1.112 |
| 4.851 | 1.114 |
| 4.852 | 1.115 |
| 4.853 | 1.117 |
| 4.854 | 1.118 |
| 4.855 | 1.12 |
| 4.856 | 1.121 |
| 4.857 | 1.123 |
| 4.858 | 1.124 |
| 4.859 | 1.126 |
| 4.86 | 1.127 |
| 4.861 | 1.129 |
| 4.862 | 1.13 |
| 4.863 | 1.131 |
| 4.864 | 1.133 |
| 4.865 | 1.134 |
| 4.866 | 1.136 |
| 4.867 | 1.137 |
| 4.868 | 1.139 |
| 4.869 | 1.14 |
| 4.87 | 1.142 |
| 4.871 | 1.143 |
| 4.872 | 1.145 |
| 4.873 | 1.146 |
| 4.874 | 1.148 |
| 4.875 | 1.149 |
| 4.876 | 1.151 |
| 4.877 | 1.152 |
| 4.878 | 1.154 |
| 4.879 | 1.155 |
| 4.88 | 1.157 |
| 4.881 | 1.158 |
| 4.882 | 1.16 |
| 4.883 | 1.161 |
| 4.884 | 1.163 |
| 4.885 | 1.164 |
| 4.886 | 1.166 |
| 4.887 | 1.167 |
| 4.888 | 1.169 |
| 4.889 | 1.17 |
| 4.89 | 1.172 |
| 4.891 | 1.173 |
| 4.892 | 1.175 |
| 4.893 | 1.176 |
| 4.894 | 1.178 |
| 4.895 | 1.179 |
| 4.896 | 1.181 |
| 4.897 | 1.182 |
| 4.898 | 1.184 |
| 4.899 | 1.185 |
| 4.9 | 1.187 |
| 4.901 | 1.188 |
| 4.902 | 1.19 |
| 4.903 | 1.191 |
| 4.904 | 1.193 |
| 4.905 | 1.194 |
| 4.906 | 1.196 |
| 4.907 | 1.197 |
| 4.908 | 1.199 |
| 4.909 | 1.2 |
| 4.91 | 1.202 |
| 4.911 | 1.203 |
| 4.912 | 1.205 |
| 4.913 | 1.206 |
| 4.914 | 1.208 |
| 4.915 | 1.209 |
| 4.916 | 1.211 |
| 4.917 | 1.212 |
| 4.918 | 1.214 |
| 4.919 | 1.215 |
| 4.92 | 1.217 |
| 4.921 | 1.218 |
| 4.922 | 1.22 |
| 4.923 | 1.221 |
| 4.924 | 1.223 |
| 4.925 | 1.224 |
| 4.926 | 1.226 |
| 4.927 | 1.227 |
| 4.928 | 1.229 |
| 4.929 | 1.23 |
| 4.93 | 1.232 |
| 4.931 | 1.233 |
| 4.932 | 1.235 |
| 4.933 | 1.236 |
| 4.934 | 1.238 |
| 4.935 | 1.239 |
| 4.936 | 1.241 |
| 4.937 | 1.242 |
| 4.938 | 1.244 |
| 4.939 | 1.245 |
| 4.94 | 1.247 |
| 4.941 | 1.248 |
| 4.942 | 1.25 |
| 4.943 | 1.252 |
| 4.944 | 1.253 |
| 4.945 | 1.255 |
| 4.946 | 1.256 |
| 4.947 | 1.258 |
| 4.948 | 1.259 |
| 4.949 | 1.261 |
| 4.95 | 1.262 |
| 4.951 | 1.264 |
| 4.952 | 1.265 |
| 4.953 | 1.267 |
| 4.954 | 1.268 |
| 4.955 | 1.27 |
| 4.956 | 1.271 |
| 4.957 | 1.273 |
| 4.958 | 1.274 |
| 4.959 | 1.276 |
| 4.96 | 1.277 |
| 4.961 | 1.279 |
| 4.962 | 1.28 |
| 4.963 | 1.282 |
| 4.964 | 1.283 |
| 4.965 | 1.285 |
| 4.966 | 1.287 |
| 4.967 | 1.288 |
| 4.968 | 1.29 |
| 4.969 | 1.291 |
| 4.97 | 1.293 |
| 4.971 | 1.294 |
| 4.972 | 1.296 |
| 4.973 | 1.297 |
| 4.974 | 1.299 |
| 4.975 | 1.3 |
| 4.976 | 1.302 |
| 4.977 | 1.303 |
| 4.978 | 1.305 |
| 4.979 | 1.306 |
| 4.98 | 1.308 |
| 4.981 | 1.309 |
| 4.982 | 1.311 |
| 4.983 | 1.313 |
| 4.984 | 1.314 |
| 4.985 | 1.316 |
| 4.986 | 1.317 |
| 4.987 | 1.319 |
| 4.988 | 1.32 |
| 4.989 | 1.322 |
| 4.99 | 1.323 |
| 4.991 | 1.325 |
| 4.992 | 1.326 |
| 4.993 | 1.328 |
| 4.994 | 1.329 |
| 4.995 | 1.331 |
| 4.996 | 1.333 |
| 4.997 | 1.334 |
| 4.998 | 1.336 |
| 4.999 | 1.337 |
| 5.0 | 1.339 |
| 5.001 | 1.34 |
| 5.002 | 1.342 |
| 5.003 | 1.343 |
| 5.004 | 1.345 |
| 5.005 | 1.346 |
| 5.006 | 1.348 |
| 5.007 | 1.35 |
| 5.008 | 1.351 |
| 5.009 | 1.353 |
| 5.01 | 1.354 |
| 5.011 | 1.356 |
| 5.012 | 1.357 |
| 5.013 | 1.359 |
| 5.014 | 1.36 |
| 5.015 | 1.362 |
| 5.016 | 1.363 |
| 5.017 | 1.365 |
| 5.018 | 1.367 |
| 5.019 | 1.368 |
| 5.02 | 1.37 |
| 5.021 | 1.371 |
| 5.022 | 1.373 |
| 5.023 | 1.374 |
| 5.024 | 1.376 |
| 5.025 | 1.377 |
| 5.026 | 1.379 |
| 5.027 | 1.381 |
| 5.028 | 1.382 |
| 5.029 | 1.384 |
| 5.03 | 1.385 |
| 5.031 | 1.387 |
| 5.032 | 1.388 |
| 5.033 | 1.39 |
| 5.034 | 1.391 |
| 5.035 | 1.393 |
| 5.036 | 1.395 |
| 5.037 | 1.396 |
| 5.038 | 1.398 |
| 5.039 | 1.399 |
| 5.04 | 1.401 |
| 5.041 | 1.402 |
| 5.042 | 1.404 |
| 5.043 | 1.405 |
| 5.044 | 1.407 |
| 5.045 | 1.409 |
| 5.046 | 1.41 |
| 5.047 | 1.412 |
| 5.048 | 1.413 |
| 5.049 | 1.415 |
| 5.05 | 1.416 |
| 5.051 | 1.418 |
| 5.052 | 1.42 |
| 5.053 | 1.421 |
| 5.054 | 1.423 |
| 5.055 | 1.424 |
| 5.056 | 1.426 |
| 5.057 | 1.427 |
| 5.058 | 1.429 |
| 5.059 | 1.43 |
| 5.06 | 1.432 |
| 5.061 | 1.434 |
| 5.062 | 1.435 |
| 5.063 | 1.437 |
| 5.064 | 1.438 |
| 5.065 | 1.44 |
| 5.066 | 1.441 |
| 5.067 | 1.443 |
| 5.068 | 1.445 |
| 5.069 | 1.446 |
| 5.07 | 1.448 |
| 5.071 | 1.449 |
| 5.072 | 1.451 |
| 5.073 | 1.452 |
| 5.074 | 1.454 |
| 5.075 | 1.456 |
| 5.076 | 1.457 |
| 5.077 | 1.459 |
| 5.078 | 1.46 |
| 5.079 | 1.462 |
| 5.08 | 1.464 |
| 5.081 | 1.465 |
| 5.082 | 1.467 |
| 5.083 | 1.468 |
| 5.084 | 1.47 |
| 5.085 | 1.471 |
| 5.086 | 1.473 |
| 5.087 | 1.475 |
| 5.088 | 1.476 |
| 5.089 | 1.478 |
| 5.09 | 1.479 |
| 5.091 | 1.481 |
| 5.092 | 1.482 |
| 5.093 | 1.484 |
| 5.094 | 1.486 |
| 5.095 | 1.487 |
| 5.096 | 1.489 |
| 5.097 | 1.49 |
| 5.098 | 1.492 |
| 5.099 | 1.494 |
| 5.1 | 1.495 |
| 5.101 | 1.497 |
| 5.102 | 1.498 |
| 5.103 | 1.5 |
| 5.104 | 1.501 |
| 5.105 | 1.503 |
| 5.106 | 1.505 |
| 5.107 | 1.506 |
| 5.108 | 1.508 |
| 5.109 | 1.509 |
| 5.11 | 1.511 |
| 5.111 | 1.513 |
| 5.112 | 1.514 |
| 5.113 | 1.516 |
| 5.114 | 1.517 |
| 5.115 | 1.519 |
| 5.116 | 1.521 |
| 5.117 | 1.522 |
| 5.118 | 1.524 |
| 5.119 | 1.525 |
| 5.12 | 1.527 |
| 5.121 | 1.529 |
| 5.122 | 1.53 |
| 5.123 | 1.532 |
| 5.124 | 1.533 |
| 5.125 | 1.535 |
| 5.126 | 1.537 |
| 5.127 | 1.538 |
| 5.128 | 1.54 |
| 5.129 | 1.541 |
| 5.13 | 1.543 |
| 5.131 | 1.545 |
| 5.132 | 1.546 |
| 5.133 | 1.548 |
| 5.134 | 1.549 |
| 5.135 | 1.551 |
| 5.136 | 1.553 |
| 5.137 | 1.554 |
| 5.138 | 1.556 |
| 5.139 | 1.557 |
| 5.14 | 1.559 |
| 5.141 | 1.561 |
| 5.142 | 1.562 |
| 5.143 | 1.564 |
| 5.144 | 1.565 |
| 5.145 | 1.567 |
| 5.146 | 1.569 |
| 5.147 | 1.57 |
| 5.148 | 1.572 |
| 5.149 | 1.573 |
| 5.15 | 1.575 |
| 5.151 | 1.577 |
| 5.152 | 1.578 |
| 5.153 | 1.58 |
| 5.154 | 1.581 |
| 5.155 | 1.583 |
| 5.156 | 1.585 |
| 5.157 | 1.586 |
| 5.158 | 1.588 |
| 5.159 | 1.59 |
| 5.16 | 1.591 |
| 5.161 | 1.593 |
| 5.162 | 1.594 |
| 5.163 | 1.596 |
| 5.164 | 1.598 |
| 5.165 | 1.599 |
| 5.166 | 1.601 |
| 5.167 | 1.602 |
| 5.168 | 1.604 |
| 5.169 | 1.606 |
| 5.17 | 1.607 |
| 5.171 | 1.609 |
| 5.172 | 1.611 |
| 5.173 | 1.612 |
| 5.174 | 1.614 |
| 5.175 | 1.615 |
| 5.176 | 1.617 |
| 5.177 | 1.619 |
| 5.178 | 1.62 |
| 5.179 | 1.622 |
| 5.18 | 1.623 |
| 5.181 | 1.625 |
| 5.182 | 1.627 |
| 5.183 | 1.628 |
| 5.184 | 1.63 |
| 5.185 | 1.632 |
| 5.186 | 1.633 |
| 5.187 | 1.635 |
| 5.188 | 1.636 |
| 5.189 | 1.638 |
| 5.19 | 1.64 |
| 5.191 | 1.641 |
| 5.192 | 1.643 |
| 5.193 | 1.645 |
| 5.194 | 1.646 |
| 5.195 | 1.648 |
| 5.196 | 1.65 |
| 5.197 | 1.651 |
| 5.198 | 1.653 |
| 5.199 | 1.654 |
| 5.2 | 1.656 |
| 5.201 | 1.658 |
| 5.202 | 1.659 |
| 5.203 | 1.661 |
| 5.204 | 1.663 |
| 5.205 | 1.664 |
| 5.206 | 1.666 |
| 5.207 | 1.667 |
| 5.208 | 1.669 |
| 5.209 | 1.671 |
| 5.21 | 1.672 |
| 5.211 | 1.674 |
| 5.212 | 1.676 |
| 5.213 | 1.677 |
| 5.214 | 1.679 |
| 5.215 | 1.681 |
| 5.216 | 1.682 |
| 5.217 | 1.684 |
| 5.218 | 1.685 |
| 5.219 | 1.687 |
| 5.22 | 1.689 |
| 5.221 | 1.69 |
| 5.222 | 1.692 |
| 5.223 | 1.694 |
| 5.224 | 1.695 |
| 5.225 | 1.697 |
| 5.226 | 1.699 |
| 5.227 | 1.7 |
| 5.228 | 1.702 |
| 5.229 | 1.704 |
| 5.23 | 1.705 |
| 5.231 | 1.707 |
| 5.232 | 1.708 |
| 5.233 | 1.71 |
| 5.234 | 1.712 |
| 5.235 | 1.713 |
| 5.236 | 1.715 |
| 5.237 | 1.717 |
| 5.238 | 1.718 |
| 5.239 | 1.72 |
| 5.24 | 1.722 |
| 5.241 | 1.723 |
| 5.242 | 1.725 |
| 5.243 | 1.727 |
| 5.244 | 1.728 |
| 5.245 | 1.73 |
| 5.246 | 1.732 |
| 5.247 | 1.733 |
| 5.248 | 1.735 |
| 5.249 | 1.737 |
| 5.25 | 1.738 |
| 5.251 | 1.74 |
| 5.252 | 1.742 |
| 5.253 | 1.743 |
| 5.254 | 1.745 |
| 5.255 | 1.746 |
| 5.256 | 1.748 |
| 5.257 | 1.75 |
| 5.258 | 1.751 |
| 5.259 | 1.753 |
| 5.26 | 1.755 |
| 5.261 | 1.756 |
| 5.262 | 1.758 |
| 5.263 | 1.76 |
| 5.264 | 1.761 |
| 5.265 | 1.763 |
| 5.266 | 1.765 |
| 5.267 | 1.766 |
| 5.268 | 1.768 |
| 5.269 | 1.77 |
| 5.27 | 1.771 |
| 5.271 | 1.773 |
| 5.272 | 1.775 |
| 5.273 | 1.776 |
| 5.274 | 1.778 |
| 5.275 | 1.78 |
| 5.276 | 1.781 |
| 5.277 | 1.783 |
| 5.278 | 1.785 |
| 5.279 | 1.786 |
| 5.28 | 1.788 |
| 5.281 | 1.79 |
| 5.282 | 1.791 |
| 5.283 | 1.793 |
| 5.284 | 1.795 |
| 5.285 | 1.796 |
| 5.286 | 1.798 |
| 5.287 | 1.8 |
| 5.288 | 1.801 |
| 5.289 | 1.803 |
| 5.29 | 1.805 |
| 5.291 | 1.806 |
| 5.292 | 1.808 |
| 5.293 | 1.81 |
| 5.294 | 1.811 |
| 5.295 | 1.813 |
| 5.296 | 1.815 |
| 5.297 | 1.816 |
| 5.298 | 1.818 |
| 5.299 | 1.82 |
| 5.3 | 1.822 |
| 5.301 | 1.823 |
| 5.302 | 1.825 |
| 5.303 | 1.827 |
| 5.304 | 1.828 |
| 5.305 | 1.83 |
| 5.306 | 1.832 |
| 5.307 | 1.833 |
| 5.308 | 1.835 |
| 5.309 | 1.837 |
| 5.31 | 1.838 |
| 5.311 | 1.84 |
| 5.312 | 1.842 |
| 5.313 | 1.843 |
| 5.314 | 1.845 |
| 5.315 | 1.847 |
| 5.316 | 1.848 |
| 5.317 | 1.85 |
| 5.318 | 1.852 |
| 5.319 | 1.853 |
| 5.32 | 1.855 |
| 5.321 | 1.857 |
| 5.322 | 1.859 |
| 5.323 | 1.86 |
| 5.324 | 1.862 |
| 5.325 | 1.864 |
| 5.326 | 1.865 |
| 5.327 | 1.867 |
| 5.328 | 1.869 |
| 5.329 | 1.87 |
| 5.33 | 1.872 |
| 5.331 | 1.874 |
| 5.332 | 1.875 |
| 5.333 | 1.877 |
| 5.334 | 1.879 |
| 5.335 | 1.881 |
| 5.336 | 1.882 |
| 5.337 | 1.884 |
| 5.338 | 1.886 |
| 5.339 | 1.887 |
| 5.34 | 1.889 |
| 5.341 | 1.891 |
| 5.342 | 1.892 |
| 5.343 | 1.894 |
| 5.344 | 1.896 |
| 5.345 | 1.897 |
| 5.346 | 1.899 |
| 5.347 | 1.901 |
| 5.348 | 1.903 |
| 5.349 | 1.904 |
| 5.35 | 1.906 |
| 5.351 | 1.908 |
| 5.352 | 1.909 |
| 5.353 | 1.911 |
| 5.354 | 1.913 |
| 5.355 | 1.914 |
| 5.356 | 1.916 |
| 5.357 | 1.918 |
| 5.358 | 1.92 |
| 5.359 | 1.921 |
| 5.36 | 1.923 |
| 5.361 | 1.925 |
| 5.362 | 1.926 |
| 5.363 | 1.928 |
| 5.364 | 1.93 |
| 5.365 | 1.932 |
| 5.366 | 1.933 |
| 5.367 | 1.935 |
| 5.368 | 1.937 |
| 5.369 | 1.938 |
| 5.37 | 1.94 |
| 5.371 | 1.942 |
| 5.372 | 1.944 |
| 5.373 | 1.945 |
| 5.374 | 1.947 |
| 5.375 | 1.949 |
| 5.376 | 1.95 |
| 5.377 | 1.952 |
| 5.378 | 1.954 |
| 5.379 | 1.956 |
| 5.38 | 1.957 |
| 5.381 | 1.959 |
| 5.382 | 1.961 |
| 5.383 | 1.962 |
| 5.384 | 1.964 |
| 5.385 | 1.966 |
| 5.386 | 1.968 |
| 5.387 | 1.969 |
| 5.388 | 1.971 |
| 5.389 | 1.973 |
| 5.39 | 1.974 |
| 5.391 | 1.976 |
| 5.392 | 1.978 |
| 5.393 | 1.98 |
| 5.394 | 1.981 |
| 5.395 | 1.983 |
| 5.396 | 1.985 |
| 5.397 | 1.986 |
| 5.398 | 1.988 |
| 5.399 | 1.99 |
| 5.4 | 1.992 |
| 5.401 | 1.993 |
| 5.402 | 1.995 |
| 5.403 | 1.997 |
| 5.404 | 1.999 |
| 5.405 | 2 |
| 5.406 | 2.002 |
| 5.407 | 2.004 |
| 5.408 | 2.005 |
| 5.409 | 2.007 |
| 5.41 | 2.009 |
| 5.411 | 2.011 |
| 5.412 | 2.012 |
| 5.413 | 2.014 |
| 5.414 | 2.016 |
| 5.415 | 2.018 |
| 5.416 | 2.019 |
| 5.417 | 2.021 |
| 5.418 | 2.023 |
| 5.419 | 2.025 |
| 5.42 | 2.026 |
| 5.421 | 2.028 |
| 5.422 | 2.03 |
| 5.423 | 2.031 |
| 5.424 | 2.033 |
| 5.425 | 2.035 |
| 5.426 | 2.037 |
| 5.427 | 2.038 |
| 5.428 | 2.04 |
| 5.429 | 2.042 |
| 5.43 | 2.044 |
| 5.431 | 2.045 |
| 5.432 | 2.047 |
| 5.433 | 2.049 |
| 5.434 | 2.051 |
| 5.435 | 2.052 |
| 5.436 | 2.054 |
| 5.437 | 2.056 |
| 5.438 | 2.058 |
| 5.439 | 2.059 |
| 5.44 | 2.061 |
| 5.441 | 2.063 |
| 5.442 | 2.065 |
| 5.443 | 2.066 |
| 5.444 | 2.068 |
| 5.445 | 2.07 |
| 5.446 | 2.072 |
| 5.447 | 2.073 |
| 5.448 | 2.075 |
| 5.449 | 2.077 |
| 5.45 | 2.079 |
| 5.451 | 2.08 |
| 5.452 | 2.082 |
| 5.453 | 2.084 |
| 5.454 | 2.086 |
| 5.455 | 2.087 |
| 5.456 | 2.089 |
| 5.457 | 2.091 |
| 5.458 | 2.093 |
| 5.459 | 2.094 |
| 5.46 | 2.096 |
| 5.461 | 2.098 |
| 5.462 | 2.1 |
| 5.463 | 2.101 |
| 5.464 | 2.103 |
| 5.465 | 2.105 |
| 5.466 | 2.107 |
| 5.467 | 2.108 |
| 5.468 | 2.11 |
| 5.469 | 2.112 |
| 5.47 | 2.114 |
| 5.471 | 2.115 |
| 5.472 | 2.117 |
| 5.473 | 2.119 |
| 5.474 | 2.121 |
| 5.475 | 2.122 |
| 5.476 | 2.124 |
| 5.477 | 2.126 |
| 5.478 | 2.128 |
| 5.479 | 2.129 |
| 5.48 | 2.131 |
| 5.481 | 2.133 |
| 5.482 | 2.135 |
| 5.483 | 2.136 |
| 5.484 | 2.138 |
| 5.485 | 2.14 |
| 5.486 | 2.142 |
| 5.487 | 2.144 |
| 5.488 | 2.145 |
| 5.489 | 2.147 |
| 5.49 | 2.149 |
| 5.491 | 2.151 |
| 5.492 | 2.152 |
| 5.493 | 2.154 |
| 5.494 | 2.156 |
| 5.495 | 2.158 |
| 5.496 | 2.159 |
| 5.497 | 2.161 |
| 5.498 | 2.163 |
| 5.499 | 2.165 |
| 5.5 | 2.167 |
| 5.501 | 2.168 |
| 5.502 | 2.17 |
| 5.503 | 2.172 |
| 5.504 | 2.174 |
| 5.505 | 2.175 |
| 5.506 | 2.177 |
| 5.507 | 2.179 |
| 5.508 | 2.181 |
| 5.509 | 2.183 |
| 5.51 | 2.184 |
| 5.511 | 2.186 |
| 5.512 | 2.188 |
| 5.513 | 2.19 |
| 5.514 | 2.191 |
| 5.515 | 2.193 |
| 5.516 | 2.195 |
| 5.517 | 2.197 |
| 5.518 | 2.199 |
| 5.519 | 2.2 |
| 5.52 | 2.202 |
| 5.521 | 2.204 |
| 5.522 | 2.206 |
| 5.523 | 2.208 |
| 5.524 | 2.209 |
| 5.525 | 2.211 |
| 5.526 | 2.213 |
| 5.527 | 2.215 |
| 5.528 | 2.216 |
| 5.529 | 2.218 |
| 5.53 | 2.22 |
| 5.531 | 2.222 |
| 5.532 | 2.224 |
| 5.533 | 2.225 |
| 5.534 | 2.227 |
| 5.535 | 2.229 |
| 5.536 | 2.231 |
| 5.537 | 2.233 |
| 5.538 | 2.234 |
| 5.539 | 2.236 |
| 5.54 | 2.238 |
| 5.541 | 2.24 |
| 5.542 | 2.242 |
| 5.543 | 2.243 |
| 5.544 | 2.245 |
| 5.545 | 2.247 |
| 5.546 | 2.249 |
| 5.547 | 2.25 |
| 5.548 | 2.252 |
| 5.549 | 2.254 |
| 5.55 | 2.256 |
| 5.551 | 2.258 |
| 5.552 | 2.259 |
| 5.553 | 2.261 |
| 5.554 | 2.263 |
| 5.555 | 2.265 |
| 5.556 | 2.267 |
| 5.557 | 2.268 |
| 5.558 | 2.27 |
| 5.559 | 2.272 |
| 5.56 | 2.274 |
| 5.561 | 2.276 |
| 5.562 | 2.278 |
| 5.563 | 2.279 |
| 5.564 | 2.281 |
| 5.565 | 2.283 |
| 5.566 | 2.285 |
| 5.567 | 2.287 |
| 5.568 | 2.288 |
| 5.569 | 2.29 |
| 5.57 | 2.292 |
| 5.571 | 2.294 |
| 5.572 | 2.296 |
| 5.573 | 2.297 |
| 5.574 | 2.299 |
| 5.575 | 2.301 |
| 5.576 | 2.303 |
| 5.577 | 2.305 |
| 5.578 | 2.306 |
| 5.579 | 2.308 |
| 5.58 | 2.31 |
| 5.581 | 2.312 |
| 5.582 | 2.314 |
| 5.583 | 2.316 |
| 5.584 | 2.317 |
| 5.585 | 2.319 |
| 5.586 | 2.321 |
| 5.587 | 2.323 |
| 5.588 | 2.325 |
| 5.589 | 2.326 |
| 5.59 | 2.328 |
| 5.591 | 2.33 |
| 5.592 | 2.332 |
| 5.593 | 2.334 |
| 5.594 | 2.335 |
| 5.595 | 2.337 |
| 5.596 | 2.339 |
| 5.597 | 2.341 |
| 5.598 | 2.343 |
| 5.599 | 2.345 |
| 5.6 | 2.346 |
| 5.601 | 2.348 |
| 5.602 | 2.35 |
| 5.603 | 2.352 |
| 5.604 | 2.354 |
| 5.605 | 2.356 |
| 5.606 | 2.357 |
| 5.607 | 2.359 |
| 5.608 | 2.361 |
| 5.609 | 2.363 |
| 5.61 | 2.365 |
| 5.611 | 2.367 |
| 5.612 | 2.368 |
| 5.613 | 2.37 |
| 5.614 | 2.372 |
| 5.615 | 2.374 |
| 5.616 | 2.376 |
| 5.617 | 2.378 |
| 5.618 | 2.379 |
| 5.619 | 2.381 |
| 5.62 | 2.383 |
| 5.621 | 2.385 |
| 5.622 | 2.387 |
| 5.623 | 2.388 |
| 5.624 | 2.39 |
| 5.625 | 2.392 |
| 5.626 | 2.394 |
| 5.627 | 2.396 |
| 5.628 | 2.398 |
| 5.629 | 2.4 |
| 5.63 | 2.401 |
| 5.631 | 2.403 |
| 5.632 | 2.405 |
| 5.633 | 2.407 |
| 5.634 | 2.409 |
| 5.635 | 2.411 |
| 5.636 | 2.412 |
| 5.637 | 2.414 |
| 5.638 | 2.416 |
| 5.639 | 2.418 |
| 5.64 | 2.42 |
| 5.641 | 2.422 |
| 5.642 | 2.423 |
| 5.643 | 2.425 |
| 5.644 | 2.427 |
| 5.645 | 2.429 |
| 5.646 | 2.431 |
| 5.647 | 2.433 |
| 5.648 | 2.435 |
| 5.649 | 2.436 |
| 5.65 | 2.438 |
| 5.651 | 2.44 |
| 5.652 | 2.442 |
| 5.653 | 2.444 |
| 5.654 | 2.446 |
| 5.655 | 2.447 |
| 5.656 | 2.449 |
| 5.657 | 2.451 |
| 5.658 | 2.453 |
| 5.659 | 2.455 |
| 5.66 | 2.457 |
| 5.661 | 2.459 |
| 5.662 | 2.46 |
| 5.663 | 2.462 |
| 5.664 | 2.464 |
| 5.665 | 2.466 |
| 5.666 | 2.468 |
| 5.667 | 2.47 |
| 5.668 | 2.472 |
| 5.669 | 2.473 |
| 5.67 | 2.475 |
| 5.671 | 2.477 |
| 5.672 | 2.479 |
| 5.673 | 2.481 |
| 5.674 | 2.483 |
| 5.675 | 2.485 |
| 5.676 | 2.486 |
| 5.677 | 2.488 |
| 5.678 | 2.49 |
| 5.679 | 2.492 |
| 5.68 | 2.494 |
| 5.681 | 2.496 |
| 5.682 | 2.498 |
| 5.683 | 2.5 |
| 5.684 | 2.501 |
| 5.685 | 2.503 |
| 5.686 | 2.505 |
| 5.687 | 2.507 |
| 5.688 | 2.509 |
| 5.689 | 2.511 |
| 5.69 | 2.513 |
| 5.691 | 2.514 |
| 5.692 | 2.516 |
| 5.693 | 2.518 |
| 5.694 | 2.52 |
| 5.695 | 2.522 |
| 5.696 | 2.524 |
| 5.697 | 2.526 |
| 5.698 | 2.528 |
| 5.699 | 2.529 |
| 5.7 | 2.531 |
| 5.701 | 2.533 |
| 5.702 | 2.535 |
| 5.703 | 2.537 |
| 5.704 | 2.539 |
| 5.705 | 2.541 |
| 5.706 | 2.543 |
| 5.707 | 2.544 |
| 5.708 | 2.546 |
| 5.709 | 2.548 |
| 5.71 | 2.55 |
| 5.711 | 2.552 |
| 5.712 | 2.554 |
| 5.713 | 2.556 |
| 5.714 | 2.558 |
| 5.715 | 2.559 |
| 5.716 | 2.561 |
| 5.717 | 2.563 |
| 5.718 | 2.565 |
| 5.719 | 2.567 |
| 5.72 | 2.569 |
| 5.721 | 2.571 |
| 5.722 | 2.573 |
| 5.723 | 2.575 |
| 5.724 | 2.576 |
| 5.725 | 2.578 |
| 5.726 | 2.58 |
| 5.727 | 2.582 |
| 5.728 | 2.584 |
| 5.729 | 2.586 |
| 5.73 | 2.588 |
| 5.731 | 2.59 |
| 5.732 | 2.592 |
| 5.733 | 2.593 |
| 5.734 | 2.595 |
| 5.735 | 2.597 |
| 5.736 | 2.599 |
| 5.737 | 2.601 |
| 5.738 | 2.603 |
| 5.739 | 2.605 |
| 5.74 | 2.607 |
| 5.741 | 2.609 |
| 5.742 | 2.61 |
| 5.743 | 2.612 |
| 5.744 | 2.614 |
| 5.745 | 2.616 |
| 5.746 | 2.618 |
| 5.747 | 2.62 |
| 5.748 | 2.622 |
| 5.749 | 2.624 |
| 5.75 | 2.626 |
| 5.751 | 2.628 |
| 5.752 | 2.629 |
| 5.753 | 2.631 |
| 5.754 | 2.633 |
| 5.755 | 2.635 |
| 5.756 | 2.637 |
| 5.757 | 2.639 |
| 5.758 | 2.641 |
| 5.759 | 2.643 |
| 5.76 | 2.645 |
| 5.761 | 2.647 |
| 5.762 | 2.648 |
| 5.763 | 2.65 |
| 5.764 | 2.652 |
| 5.765 | 2.654 |
| 5.766 | 2.656 |
| 5.767 | 2.658 |
| 5.768 | 2.66 |
| 5.769 | 2.662 |
| 5.77 | 2.664 |
| 5.771 | 2.666 |
| 5.772 | 2.668 |
| 5.773 | 2.67 |
| 5.774 | 2.671 |
| 5.775 | 2.673 |
| 5.776 | 2.675 |
| 5.777 | 2.677 |
| 5.778 | 2.679 |
| 5.779 | 2.681 |
| 5.78 | 2.683 |
| 5.781 | 2.685 |
| 5.782 | 2.687 |
| 5.783 | 2.689 |
| 5.784 | 2.691 |
| 5.785 | 2.692 |
| 5.786 | 2.694 |
| 5.787 | 2.696 |
| 5.788 | 2.698 |
| 5.789 | 2.7 |
| 5.79 | 2.702 |
| 5.791 | 2.704 |
| 5.792 | 2.706 |
| 5.793 | 2.708 |
| 5.794 | 2.71 |
| 5.795 | 2.712 |
| 5.796 | 2.714 |
| 5.797 | 2.716 |
| 5.798 | 2.717 |
| 5.799 | 2.719 |
| 5.8 | 2.721 |
| 5.801 | 2.723 |
| 5.802 | 2.725 |
| 5.803 | 2.727 |
| 5.804 | 2.729 |
| 5.805 | 2.731 |
| 5.806 | 2.733 |
| 5.807 | 2.735 |
| 5.808 | 2.737 |
| 5.809 | 2.739 |
| 5.81 | 2.741 |
| 5.811 | 2.743 |
| 5.812 | 2.744 |
| 5.813 | 2.746 |
| 5.814 | 2.748 |
| 5.815 | 2.75 |
| 5.816 | 2.752 |
| 5.817 | 2.754 |
| 5.818 | 2.756 |
| 5.819 | 2.758 |
| 5.82 | 2.76 |
| 5.821 | 2.762 |
| 5.822 | 2.764 |
| 5.823 | 2.766 |
| 5.824 | 2.768 |
| 5.825 | 2.77 |
| 5.826 | 2.772 |
| 5.827 | 2.774 |
| 5.828 | 2.775 |
| 5.829 | 2.777 |
| 5.83 | 2.779 |
| 5.831 | 2.781 |
| 5.832 | 2.783 |
| 5.833 | 2.785 |
| 5.834 | 2.787 |
| 5.835 | 2.789 |
| 5.836 | 2.791 |
| 5.837 | 2.793 |
| 5.838 | 2.795 |
| 5.839 | 2.797 |
| 5.84 | 2.799 |
| 5.841 | 2.801 |
| 5.842 | 2.803 |
| 5.843 | 2.805 |
| 5.844 | 2.807 |
| 5.845 | 2.809 |
| 5.846 | 2.811 |
| 5.847 | 2.812 |
| 5.848 | 2.814 |
| 5.849 | 2.816 |
| 5.85 | 2.818 |
| 5.851 | 2.82 |
| 5.852 | 2.822 |
| 5.853 | 2.824 |
| 5.854 | 2.826 |
| 5.855 | 2.828 |
| 5.856 | 2.83 |
| 5.857 | 2.832 |
| 5.858 | 2.834 |
| 5.859 | 2.836 |
| 5.86 | 2.838 |
| 5.861 | 2.84 |
| 5.862 | 2.842 |
| 5.863 | 2.844 |
| 5.864 | 2.846 |
| 5.865 | 2.848 |
| 5.866 | 2.85 |
| 5.867 | 2.852 |
| 5.868 | 2.854 |
| 5.869 | 2.856 |
| 5.87 | 2.857 |
| 5.871 | 2.859 |
| 5.872 | 2.861 |
| 5.873 | 2.863 |
| 5.874 | 2.865 |
| 5.875 | 2.867 |
| 5.876 | 2.869 |
| 5.877 | 2.871 |
| 5.878 | 2.873 |
| 5.879 | 2.875 |
| 5.88 | 2.877 |
| 5.881 | 2.879 |
| 5.882 | 2.881 |
| 5.883 | 2.883 |
| 5.884 | 2.885 |
| 5.885 | 2.887 |
| 5.886 | 2.889 |
| 5.887 | 2.891 |
| 5.888 | 2.893 |
| 5.889 | 2.895 |
| 5.89 | 2.897 |
| 5.891 | 2.899 |
| 5.892 | 2.901 |
| 5.893 | 2.903 |
| 5.894 | 2.905 |
| 5.895 | 2.907 |
| 5.896 | 2.909 |
| 5.897 | 2.911 |
| 5.898 | 2.913 |
| 5.899 | 2.915 |
| 5.9 | 2.917 |
| 5.901 | 2.919 |
| 5.902 | 2.921 |
| 5.903 | 2.923 |
| 5.904 | 2.925 |
| 5.905 | 2.927 |
| 5.906 | 2.929 |
| 5.907 | 2.931 |
| 5.908 | 2.933 |
| 5.909 | 2.934 |
| 5.91 | 2.936 |
| 5.911 | 2.938 |
| 5.912 | 2.94 |
| 5.913 | 2.942 |
| 5.914 | 2.944 |
| 5.915 | 2.946 |
| 5.916 | 2.948 |
| 5.917 | 2.95 |
| 5.918 | 2.952 |
| 5.919 | 2.954 |
| 5.92 | 2.956 |
| 5.921 | 2.958 |
| 5.922 | 2.96 |
| 5.923 | 2.962 |
| 5.924 | 2.964 |
| 5.925 | 2.966 |
| 5.926 | 2.968 |
| 5.927 | 2.97 |
| 5.928 | 2.972 |
| 5.929 | 2.974 |
| 5.93 | 2.976 |
| 5.931 | 2.978 |
| 5.932 | 2.98 |
| 5.933 | 2.982 |
| 5.934 | 2.984 |
| 5.935 | 2.986 |
| 5.936 | 2.988 |
| 5.937 | 2.99 |
| 5.938 | 2.992 |
| 5.939 | 2.994 |
| 5.94 | 2.996 |
| 5.941 | 2.998 |
| 5.942 | 3 |
| 5.943 | 3.002 |
| 5.944 | 3.004 |
| 5.945 | 3.006 |
| 5.946 | 3.008 |
| 5.947 | 3.01 |
| 5.948 | 3.012 |
| 5.949 | 3.014 |
| 5.95 | 3.016 |
| 5.951 | 3.018 |
| 5.952 | 3.02 |
| 5.953 | 3.022 |
| 5.954 | 3.024 |
| 5.955 | 3.026 |
| 5.956 | 3.028 |
| 5.957 | 3.03 |
| 5.958 | 3.032 |
| 5.959 | 3.034 |
| 5.96 | 3.036 |
| 5.961 | 3.038 |
| 5.962 | 3.04 |
| 5.963 | 3.042 |
| 5.964 | 3.044 |
| 5.965 | 3.047 |
| 5.966 | 3.049 |
| 5.967 | 3.051 |
| 5.968 | 3.053 |
| 5.969 | 3.055 |
| 5.97 | 3.057 |
| 5.971 | 3.059 |
| 5.972 | 3.061 |
| 5.973 | 3.063 |
| 5.974 | 3.065 |
| 5.975 | 3.067 |
| 5.976 | 3.069 |
| 5.977 | 3.071 |
| 5.978 | 3.073 |
| 5.979 | 3.075 |
| 5.98 | 3.077 |
| 5.981 | 3.079 |
| 5.982 | 3.081 |
| 5.983 | 3.083 |
| 5.984 | 3.085 |
| 5.985 | 3.087 |
| 5.986 | 3.089 |
| 5.987 | 3.091 |
| 5.988 | 3.093 |
| 5.989 | 3.095 |
| 5.99 | 3.097 |
| 5.991 | 3.099 |
| 5.992 | 3.101 |
| 5.993 | 3.103 |
| 5.994 | 3.105 |
| 5.995 | 3.107 |
| 5.996 | 3.109 |
| 5.997 | 3.111 |
| 5.998 | 3.113 |
| 5.999 | 3.115 |
| 6.0 | 3.117 |
| 6.001 | 3.119 |
| 6.002 | 3.121 |
| 6.003 | 3.124 |
| 6.004 | 3.126 |
| 6.005 | 3.128 |
| 6.006 | 3.13 |
| 6.007 | 3.132 |
| 6.008 | 3.134 |
| 6.009 | 3.136 |
| 6.01 | 3.138 |
| 6.011 | 3.14 |
| 6.012 | 3.142 |
| 6.013 | 3.144 |
| 6.014 | 3.146 |
| 6.015 | 3.148 |
| 6.016 | 3.15 |
| 6.017 | 3.152 |
| 6.018 | 3.154 |
| 6.019 | 3.156 |
| 6.02 | 3.158 |
| 6.021 | 3.16 |
| 6.022 | 3.162 |
| 6.023 | 3.164 |
| 6.024 | 3.166 |
| 6.025 | 3.168 |
| 6.026 | 3.17 |
| 6.027 | 3.173 |
| 6.028 | 3.175 |
| 6.029 | 3.177 |
| 6.03 | 3.179 |
| 6.031 | 3.181 |
| 6.032 | 3.183 |
| 6.033 | 3.185 |
| 6.034 | 3.187 |
| 6.035 | 3.189 |
| 6.036 | 3.191 |
| 6.037 | 3.193 |
| 6.038 | 3.195 |
| 6.039 | 3.197 |
| 6.04 | 3.199 |
| 6.041 | 3.201 |
| 6.042 | 3.203 |
| 6.043 | 3.205 |
| 6.044 | 3.207 |
| 6.045 | 3.21 |
| 6.046 | 3.212 |
| 6.047 | 3.214 |
| 6.048 | 3.216 |
| 6.049 | 3.218 |
| 6.05 | 3.22 |
| 6.051 | 3.222 |
| 6.052 | 3.224 |
| 6.053 | 3.226 |
| 6.054 | 3.228 |
| 6.055 | 3.23 |
| 6.056 | 3.232 |
| 6.057 | 3.234 |
| 6.058 | 3.236 |
| 6.059 | 3.238 |
| 6.06 | 3.24 |
| 6.061 | 3.243 |
| 6.062 | 3.245 |
| 6.063 | 3.247 |
| 6.064 | 3.249 |
| 6.065 | 3.251 |
| 6.066 | 3.253 |
| 6.067 | 3.255 |
| 6.068 | 3.257 |
| 6.069 | 3.259 |
| 6.07 | 3.261 |
| 6.071 | 3.263 |
| 6.072 | 3.265 |
| 6.073 | 3.267 |
| 6.074 | 3.27 |
| 6.075 | 3.272 |
| 6.076 | 3.274 |
| 6.077 | 3.276 |
| 6.078 | 3.278 |
| 6.079 | 3.28 |
| 6.08 | 3.282 |
| 6.081 | 3.284 |
| 6.082 | 3.286 |
| 6.083 | 3.288 |
| 6.084 | 3.29 |
| 6.085 | 3.292 |
| 6.086 | 3.294 |
| 6.087 | 3.297 |
| 6.088 | 3.299 |
| 6.089 | 3.301 |
| 6.09 | 3.303 |
| 6.091 | 3.305 |
| 6.092 | 3.307 |
| 6.093 | 3.309 |
| 6.094 | 3.311 |
| 6.095 | 3.313 |
| 6.096 | 3.315 |
| 6.097 | 3.317 |
| 6.098 | 3.32 |
| 6.099 | 3.322 |
| 6.1 | 3.324 |
| 6.101 | 3.326 |
| 6.102 | 3.328 |
| 6.103 | 3.33 |
| 6.104 | 3.332 |
| 6.105 | 3.334 |
| 6.106 | 3.336 |
| 6.107 | 3.338 |
| 6.108 | 3.34 |
| 6.109 | 3.343 |
| 6.11 | 3.345 |
| 6.111 | 3.347 |
| 6.112 | 3.349 |
| 6.113 | 3.351 |
| 6.114 | 3.353 |
| 6.115 | 3.355 |
| 6.116 | 3.357 |
| 6.117 | 3.359 |
| 6.118 | 3.361 |
| 6.119 | 3.364 |
| 6.12 | 3.366 |
| 6.121 | 3.368 |
| 6.122 | 3.37 |
| 6.123 | 3.372 |
| 6.124 | 3.374 |
| 6.125 | 3.376 |
| 6.126 | 3.378 |
| 6.127 | 3.38 |
| 6.128 | 3.382 |
| 6.129 | 3.385 |
| 6.13 | 3.387 |
| 6.131 | 3.389 |
| 6.132 | 3.391 |
| 6.133 | 3.393 |
| 6.134 | 3.395 |
| 6.135 | 3.397 |
| 6.136 | 3.399 |
| 6.137 | 3.401 |
| 6.138 | 3.404 |
| 6.139 | 3.406 |
| 6.14 | 3.408 |
| 6.141 | 3.41 |
| 6.142 | 3.412 |
| 6.143 | 3.414 |
| 6.144 | 3.416 |
| 6.145 | 3.418 |
| 6.146 | 3.421 |
| 6.147 | 3.423 |
| 6.148 | 3.425 |
| 6.149 | 3.427 |
| 6.15 | 3.429 |
| 6.151 | 3.431 |
| 6.152 | 3.433 |
| 6.153 | 3.435 |
| 6.154 | 3.437 |
| 6.155 | 3.44 |
| 6.156 | 3.442 |
| 6.157 | 3.444 |
| 6.158 | 3.446 |
| 6.159 | 3.448 |
| 6.16 | 3.45 |
| 6.161 | 3.452 |
| 6.162 | 3.454 |
| 6.163 | 3.457 |
| 6.164 | 3.459 |
| 6.165 | 3.461 |
| 6.166 | 3.463 |
| 6.167 | 3.465 |
| 6.168 | 3.467 |
| 6.169 | 3.469 |
| 6.17 | 3.472 |
| 6.171 | 3.474 |
| 6.172 | 3.476 |
| 6.173 | 3.478 |
| 6.174 | 3.48 |
| 6.175 | 3.482 |
| 6.176 | 3.484 |
| 6.177 | 3.486 |
| 6.178 | 3.489 |
| 6.179 | 3.491 |
| 6.18 | 3.493 |
| 6.181 | 3.495 |
| 6.182 | 3.497 |
| 6.183 | 3.499 |
| 6.184 | 3.501 |
| 6.185 | 3.504 |
| 6.186 | 3.506 |
| 6.187 | 3.508 |
| 6.188 | 3.51 |
| 6.189 | 3.512 |
| 6.19 | 3.514 |
| 6.191 | 3.516 |
| 6.192 | 3.519 |
| 6.193 | 3.521 |
| 6.194 | 3.523 |
| 6.195 | 3.525 |
| 6.196 | 3.527 |
| 6.197 | 3.529 |
| 6.198 | 3.531 |
| 6.199 | 3.534 |
| 6.2 | 3.536 |
| 6.201 | 3.538 |
| 6.202 | 3.54 |
| 6.203 | 3.542 |
| 6.204 | 3.544 |
| 6.205 | 3.546 |
| 6.206 | 3.549 |
| 6.207 | 3.551 |
| 6.208 | 3.553 |
| 6.209 | 3.555 |
| 6.21 | 3.557 |
| 6.211 | 3.559 |
| 6.212 | 3.562 |
| 6.213 | 3.564 |
| 6.214 | 3.566 |
| 6.215 | 3.568 |
| 6.216 | 3.57 |
| 6.217 | 3.572 |
| 6.218 | 3.575 |
| 6.219 | 3.577 |
| 6.22 | 3.579 |
| 6.221 | 3.581 |
| 6.222 | 3.583 |
| 6.223 | 3.585 |
| 6.224 | 3.587 |
| 6.225 | 3.59 |
| 6.226 | 3.592 |
| 6.227 | 3.594 |
| 6.228 | 3.596 |
| 6.229 | 3.598 |
| 6.23 | 3.6 |
| 6.231 | 3.603 |
| 6.232 | 3.605 |
| 6.233 | 3.607 |
| 6.234 | 3.609 |
| 6.235 | 3.611 |
| 6.236 | 3.614 |
| 6.237 | 3.616 |
| 6.238 | 3.618 |
| 6.239 | 3.62 |
| 6.24 | 3.622 |
| 6.241 | 3.624 |
| 6.242 | 3.627 |
| 6.243 | 3.629 |
| 6.244 | 3.631 |
| 6.245 | 3.633 |
| 6.246 | 3.635 |
| 6.247 | 3.637 |
| 6.248 | 3.64 |
| 6.249 | 3.642 |
| 6.25 | 3.644 |
| 6.251 | 3.646 |
| 6.252 | 3.648 |
| 6.253 | 3.65 |
| 6.254 | 3.653 |
| 6.255 | 3.655 |
| 6.256 | 3.657 |
| 6.257 | 3.659 |
| 6.258 | 3.661 |
| 6.259 | 3.664 |
| 6.26 | 3.666 |
| 6.261 | 3.668 |
| 6.262 | 3.67 |
| 6.263 | 3.672 |
| 6.264 | 3.675 |
| 6.265 | 3.677 |
| 6.266 | 3.679 |
| 6.267 | 3.681 |
| 6.268 | 3.683 |
| 6.269 | 3.685 |
| 6.27 | 3.688 |
| 6.271 | 3.69 |
| 6.272 | 3.692 |
| 6.273 | 3.694 |
| 6.274 | 3.696 |
| 6.275 | 3.699 |
| 6.276 | 3.701 |
| 6.277 | 3.703 |
| 6.278 | 3.705 |
| 6.279 | 3.707 |
| 6.28 | 3.71 |
| 6.281 | 3.712 |
| 6.282 | 3.714 |
| 6.283 | 3.716 |
| 6.284 | 3.718 |
| 6.285 | 3.721 |
| 6.286 | 3.723 |
| 6.287 | 3.725 |
| 6.288 | 3.727 |
| 6.289 | 3.729 |
| 6.29 | 3.732 |
| 6.291 | 3.734 |
| 6.292 | 3.736 |
| 6.293 | 3.738 |
| 6.294 | 3.74 |
| 6.295 | 3.743 |
| 6.296 | 3.745 |
| 6.297 | 3.747 |
| 6.298 | 3.749 |
| 6.299 | 3.751 |
| 6.3 | 3.754 |
| 6.301 | 3.756 |
| 6.302 | 3.758 |
| 6.303 | 3.76 |
| 6.304 | 3.762 |
| 6.305 | 3.765 |
| 6.306 | 3.767 |
| 6.307 | 3.769 |
| 6.308 | 3.771 |
| 6.309 | 3.774 |
| 6.31 | 3.776 |
| 6.311 | 3.778 |
| 6.312 | 3.78 |
| 6.313 | 3.782 |
| 6.314 | 3.785 |
| 6.315 | 3.787 |
| 6.316 | 3.789 |
| 6.317 | 3.791 |
| 6.318 | 3.794 |
| 6.319 | 3.796 |
| 6.32 | 3.798 |
| 6.321 | 3.8 |
| 6.322 | 3.802 |
| 6.323 | 3.805 |
| 6.324 | 3.807 |
| 6.325 | 3.809 |
| 6.326 | 3.811 |
| 6.327 | 3.814 |
| 6.328 | 3.816 |
| 6.329 | 3.818 |
| 6.33 | 3.82 |
| 6.331 | 3.822 |
| 6.332 | 3.825 |
| 6.333 | 3.827 |
| 6.334 | 3.829 |
| 6.335 | 3.831 |
| 6.336 | 3.834 |
| 6.337 | 3.836 |
| 6.338 | 3.838 |
| 6.339 | 3.84 |
| 6.34 | 3.842 |
| 6.341 | 3.845 |
| 6.342 | 3.847 |
| 6.343 | 3.849 |
| 6.344 | 3.851 |
| 6.345 | 3.854 |
| 6.346 | 3.856 |
| 6.347 | 3.858 |
| 6.348 | 3.86 |
| 6.349 | 3.863 |
| 6.35 | 3.865 |
| 6.351 | 3.867 |
| 6.352 | 3.869 |
| 6.353 | 3.872 |
| 6.354 | 3.874 |
| 6.355 | 3.876 |
| 6.356 | 3.878 |
| 6.357 | 3.881 |
| 6.358 | 3.883 |
| 6.359 | 3.885 |
| 6.36 | 3.887 |
| 6.361 | 3.89 |
| 6.362 | 3.892 |
| 6.363 | 3.894 |
| 6.364 | 3.896 |
| 6.365 | 3.898 |
| 6.366 | 3.901 |
| 6.367 | 3.903 |
| 6.368 | 3.905 |
| 6.369 | 3.908 |
| 6.37 | 3.91 |
| 6.371 | 3.912 |
| 6.372 | 3.914 |
| 6.373 | 3.917 |
| 6.374 | 3.919 |
| 6.375 | 3.921 |
| 6.376 | 3.923 |
| 6.377 | 3.926 |
| 6.378 | 3.928 |
| 6.379 | 3.93 |
| 6.38 | 3.932 |
| 6.381 | 3.935 |
| 6.382 | 3.937 |
| 6.383 | 3.939 |
| 6.384 | 3.941 |
| 6.385 | 3.944 |
| 6.386 | 3.946 |
| 6.387 | 3.948 |
| 6.388 | 3.95 |
| 6.389 | 3.953 |
| 6.39 | 3.955 |
| 6.391 | 3.957 |
| 6.392 | 3.959 |
| 6.393 | 3.962 |
| 6.394 | 3.964 |
| 6.395 | 3.966 |
| 6.396 | 3.968 |
| 6.397 | 3.971 |
| 6.398 | 3.973 |
| 6.399 | 3.975 |
| 6.4 | 3.978 |
| 6.401 | 3.98 |
| 6.402 | 3.982 |
| 6.403 | 3.984 |
| 6.404 | 3.987 |
| 6.405 | 3.989 |
| 6.406 | 3.991 |
| 6.407 | 3.993 |
| 6.408 | 3.996 |
| 6.409 | 3.998 |
| 6.41 | 4 |
| 6.411 | 4.003 |
| 6.412 | 4.005 |
| 6.413 | 4.007 |
| 6.414 | 4.009 |
| 6.415 | 4.012 |
| 6.416 | 4.014 |
| 6.417 | 4.016 |
| 6.418 | 4.019 |
| 6.419 | 4.021 |
| 6.42 | 4.023 |
| 6.421 | 4.025 |
| 6.422 | 4.028 |
| 6.423 | 4.03 |
| 6.424 | 4.032 |
| 6.425 | 4.035 |
| 6.426 | 4.037 |
| 6.427 | 4.039 |
| 6.428 | 4.041 |
| 6.429 | 4.044 |
| 6.43 | 4.046 |
| 6.431 | 4.048 |
| 6.432 | 4.051 |
| 6.433 | 4.053 |
| 6.434 | 4.055 |
| 6.435 | 4.057 |
| 6.436 | 4.06 |
| 6.437 | 4.062 |
| 6.438 | 4.064 |
| 6.439 | 4.067 |
| 6.44 | 4.069 |
| 6.441 | 4.071 |
| 6.442 | 4.073 |
| 6.443 | 4.076 |
| 6.444 | 4.078 |
| 6.445 | 4.08 |
| 6.446 | 4.083 |
| 6.447 | 4.085 |
| 6.448 | 4.087 |
| 6.449 | 4.09 |
| 6.45 | 4.092 |
| 6.451 | 4.094 |
| 6.452 | 4.096 |
| 6.453 | 4.099 |
| 6.454 | 4.101 |
| 6.455 | 4.103 |
| 6.456 | 4.106 |
| 6.457 | 4.108 |
| 6.458 | 4.11 |
| 6.459 | 4.113 |
| 6.46 | 4.115 |
| 6.461 | 4.117 |
| 6.462 | 4.12 |
| 6.463 | 4.122 |
| 6.464 | 4.124 |
| 6.465 | 4.126 |
| 6.466 | 4.129 |
| 6.467 | 4.131 |
| 6.468 | 4.133 |
| 6.469 | 4.136 |
| 6.47 | 4.138 |
| 6.471 | 4.14 |
| 6.472 | 4.143 |
| 6.473 | 4.145 |
| 6.474 | 4.147 |
| 6.475 | 4.15 |
| 6.476 | 4.152 |
| 6.477 | 4.154 |
| 6.478 | 4.157 |
| 6.479 | 4.159 |
| 6.48 | 4.161 |
| 6.481 | 4.164 |
| 6.482 | 4.166 |
| 6.483 | 4.168 |
| 6.484 | 4.17 |
| 6.485 | 4.173 |
| 6.486 | 4.175 |
| 6.487 | 4.177 |
| 6.488 | 4.18 |
| 6.489 | 4.182 |
| 6.49 | 4.184 |
| 6.491 | 4.187 |
| 6.492 | 4.189 |
| 6.493 | 4.191 |
| 6.494 | 4.194 |
| 6.495 | 4.196 |
| 6.496 | 4.198 |
| 6.497 | 4.201 |
| 6.498 | 4.203 |
| 6.499 | 4.205 |
| 6.5 | 4.208 |
| 6.501 | 4.21 |
| 6.502 | 4.212 |
| 6.503 | 4.215 |
| 6.504 | 4.217 |
| 6.505 | 4.219 |
| 6.506 | 4.222 |
| 6.507 | 4.224 |
| 6.508 | 4.226 |
| 6.509 | 4.229 |
| 6.51 | 4.231 |
| 6.511 | 4.233 |
| 6.512 | 4.236 |
| 6.513 | 4.238 |
| 6.514 | 4.24 |
| 6.515 | 4.243 |
| 6.516 | 4.245 |
| 6.517 | 4.247 |
| 6.518 | 4.25 |
| 6.519 | 4.252 |
| 6.52 | 4.255 |
| 6.521 | 4.257 |
| 6.522 | 4.259 |
| 6.523 | 4.262 |
| 6.524 | 4.264 |
| 6.525 | 4.266 |
| 6.526 | 4.269 |
| 6.527 | 4.271 |
| 6.528 | 4.273 |
| 6.529 | 4.276 |
| 6.53 | 4.278 |
| 6.531 | 4.28 |
| 6.532 | 4.283 |
| 6.533 | 4.285 |
| 6.534 | 4.287 |
| 6.535 | 4.29 |
| 6.536 | 4.292 |
| 6.537 | 4.294 |
| 6.538 | 4.297 |
| 6.539 | 4.299 |
| 6.54 | 4.302 |
| 6.541 | 4.304 |
| 6.542 | 4.306 |
| 6.543 | 4.309 |
| 6.544 | 4.311 |
| 6.545 | 4.313 |
| 6.546 | 4.316 |
| 6.547 | 4.318 |
| 6.548 | 4.32 |
| 6.549 | 4.323 |
| 6.55 | 4.325 |
| 6.551 | 4.328 |
| 6.552 | 4.33 |
| 6.553 | 4.332 |
| 6.554 | 4.335 |
| 6.555 | 4.337 |
| 6.556 | 4.339 |
| 6.557 | 4.342 |
| 6.558 | 4.344 |
| 6.559 | 4.346 |
| 6.56 | 4.349 |
| 6.561 | 4.351 |
| 6.562 | 4.354 |
| 6.563 | 4.356 |
| 6.564 | 4.358 |
| 6.565 | 4.361 |
| 6.566 | 4.363 |
| 6.567 | 4.365 |
| 6.568 | 4.368 |
| 6.569 | 4.37 |
| 6.57 | 4.373 |
| 6.571 | 4.375 |
| 6.572 | 4.377 |
| 6.573 | 4.38 |
| 6.574 | 4.382 |
| 6.575 | 4.385 |
| 6.576 | 4.387 |
| 6.577 | 4.389 |
| 6.578 | 4.392 |
| 6.579 | 4.394 |
| 6.58 | 4.396 |
| 6.581 | 4.399 |
| 6.582 | 4.401 |
| 6.583 | 4.404 |
| 6.584 | 4.406 |
| 6.585 | 4.408 |
| 6.586 | 4.411 |
| 6.587 | 4.413 |
| 6.588 | 4.416 |
| 6.589 | 4.418 |
| 6.59 | 4.42 |
| 6.591 | 4.423 |
| 6.592 | 4.425 |
| 6.593 | 4.427 |
| 6.594 | 4.43 |
| 6.595 | 4.432 |
| 6.596 | 4.435 |
| 6.597 | 4.437 |
| 6.598 | 4.439 |
| 6.599 | 4.442 |
| 6.6 | 4.444 |
| 6.601 | 4.447 |
| 6.602 | 4.449 |
| 6.603 | 4.451 |
| 6.604 | 4.454 |
| 6.605 | 4.456 |
| 6.606 | 4.459 |
| 6.607 | 4.461 |
| 6.608 | 4.463 |
| 6.609 | 4.466 |
| 6.61 | 4.468 |
| 6.611 | 4.471 |
| 6.612 | 4.473 |
| 6.613 | 4.475 |
| 6.614 | 4.478 |
| 6.615 | 4.48 |
| 6.616 | 4.483 |
| 6.617 | 4.485 |
| 6.618 | 4.488 |
| 6.619 | 4.49 |
| 6.62 | 4.492 |
| 6.621 | 4.495 |
| 6.622 | 4.497 |
| 6.623 | 4.5 |
| 6.624 | 4.502 |
| 6.625 | 4.504 |
| 6.626 | 4.507 |
| 6.627 | 4.509 |
| 6.628 | 4.512 |
| 6.629 | 4.514 |
| 6.63 | 4.516 |
| 6.631 | 4.519 |
| 6.632 | 4.521 |
| 6.633 | 4.524 |
| 6.634 | 4.526 |
| 6.635 | 4.529 |
| 6.636 | 4.531 |
| 6.637 | 4.533 |
| 6.638 | 4.536 |
| 6.639 | 4.538 |
| 6.64 | 4.541 |
| 6.641 | 4.543 |
| 6.642 | 4.546 |
| 6.643 | 4.548 |
| 6.644 | 4.55 |
| 6.645 | 4.553 |
| 6.646 | 4.555 |
| 6.647 | 4.558 |
| 6.648 | 4.56 |
| 6.649 | 4.563 |
| 6.65 | 4.565 |
| 6.651 | 4.567 |
| 6.652 | 4.57 |
| 6.653 | 4.572 |
| 6.654 | 4.575 |
| 6.655 | 4.577 |
| 6.656 | 4.58 |
| 6.657 | 4.582 |
| 6.658 | 4.584 |
| 6.659 | 4.587 |
| 6.66 | 4.589 |
| 6.661 | 4.592 |
| 6.662 | 4.594 |
| 6.663 | 4.597 |
| 6.664 | 4.599 |
| 6.665 | 4.602 |
| 6.666 | 4.604 |
| 6.667 | 4.606 |
| 6.668 | 4.609 |
| 6.669 | 4.611 |
| 6.67 | 4.614 |
| 6.671 | 4.616 |
| 6.672 | 4.619 |
| 6.673 | 4.621 |
| 6.674 | 4.624 |
| 6.675 | 4.626 |
| 6.676 | 4.628 |
| 6.677 | 4.631 |
| 6.678 | 4.633 |
| 6.679 | 4.636 |
| 6.68 | 4.638 |
| 6.681 | 4.641 |
| 6.682 | 4.643 |
| 6.683 | 4.646 |
| 6.684 | 4.648 |
| 6.685 | 4.65 |
| 6.686 | 4.653 |
| 6.687 | 4.655 |
| 6.688 | 4.658 |
| 6.689 | 4.66 |
| 6.69 | 4.663 |
| 6.691 | 4.665 |
| 6.692 | 4.668 |
| 6.693 | 4.67 |
| 6.694 | 4.673 |
| 6.695 | 4.675 |
| 6.696 | 4.677 |
| 6.697 | 4.68 |
| 6.698 | 4.682 |
| 6.699 | 4.685 |
| 6.7 | 4.687 |
| 6.701 | 4.69 |
| 6.702 | 4.692 |
| 6.703 | 4.695 |
| 6.704 | 4.697 |
| 6.705 | 4.7 |
| 6.706 | 4.702 |
| 6.707 | 4.705 |
| 6.708 | 4.707 |
| 6.709 | 4.71 |
| 6.71 | 4.712 |
| 6.711 | 4.714 |
| 6.712 | 4.717 |
| 6.713 | 4.719 |
| 6.714 | 4.722 |
| 6.715 | 4.724 |
| 6.716 | 4.727 |
| 6.717 | 4.729 |
| 6.718 | 4.732 |
| 6.719 | 4.734 |
| 6.72 | 4.737 |
| 6.721 | 4.739 |
| 6.722 | 4.742 |
| 6.723 | 4.744 |
| 6.724 | 4.747 |
| 6.725 | 4.749 |
| 6.726 | 4.752 |
| 6.727 | 4.754 |
| 6.728 | 4.757 |
| 6.729 | 4.759 |
| 6.73 | 4.762 |
| 6.731 | 4.764 |
| 6.732 | 4.767 |
| 6.733 | 4.769 |
| 6.734 | 4.772 |
| 6.735 | 4.774 |
| 6.736 | 4.776 |
| 6.737 | 4.779 |
| 6.738 | 4.781 |
| 6.739 | 4.784 |
| 6.74 | 4.786 |
| 6.741 | 4.789 |
| 6.742 | 4.791 |
| 6.743 | 4.794 |
| 6.744 | 4.796 |
| 6.745 | 4.799 |
| 6.746 | 4.801 |
| 6.747 | 4.804 |
| 6.748 | 4.806 |
| 6.749 | 4.809 |
| 6.75 | 4.811 |
| 6.751 | 4.814 |
| 6.752 | 4.816 |
| 6.753 | 4.819 |
| 6.754 | 4.821 |
| 6.755 | 4.824 |
| 6.756 | 4.826 |
| 6.757 | 4.829 |
| 6.758 | 4.831 |
| 6.759 | 4.834 |
| 6.76 | 4.836 |
| 6.761 | 4.839 |
| 6.762 | 4.841 |
| 6.763 | 4.844 |
| 6.764 | 4.846 |
| 6.765 | 4.849 |
| 6.766 | 4.851 |
| 6.767 | 4.854 |
| 6.768 | 4.856 |
| 6.769 | 4.859 |
| 6.77 | 4.862 |
| 6.771 | 4.864 |
| 6.772 | 4.867 |
| 6.773 | 4.869 |
| 6.774 | 4.872 |
| 6.775 | 4.874 |
| 6.776 | 4.877 |
| 6.777 | 4.879 |
| 6.778 | 4.882 |
| 6.779 | 4.884 |
| 6.78 | 4.887 |
| 6.781 | 4.889 |
| 6.782 | 4.892 |
| 6.783 | 4.894 |
| 6.784 | 4.897 |
| 6.785 | 4.899 |
| 6.786 | 4.902 |
| 6.787 | 4.904 |
| 6.788 | 4.907 |
| 6.789 | 4.909 |
| 6.79 | 4.912 |
| 6.791 | 4.914 |
| 6.792 | 4.917 |
| 6.793 | 4.919 |
| 6.794 | 4.922 |
| 6.795 | 4.925 |
| 6.796 | 4.927 |
| 6.797 | 4.93 |
| 6.798 | 4.932 |
| 6.799 | 4.935 |
| 6.8 | 4.937 |
| 6.801 | 4.94 |
| 6.802 | 4.942 |
| 6.803 | 4.945 |
| 6.804 | 4.947 |
| 6.805 | 4.95 |
| 6.806 | 4.952 |
| 6.807 | 4.955 |
| 6.808 | 4.957 |
| 6.809 | 4.96 |
| 6.81 | 4.963 |
| 6.811 | 4.965 |
| 6.812 | 4.968 |
| 6.813 | 4.97 |
| 6.814 | 4.973 |
| 6.815 | 4.975 |
| 6.816 | 4.978 |
| 6.817 | 4.98 |
| 6.818 | 4.983 |
| 6.819 | 4.985 |
| 6.82 | 4.988 |
| 6.821 | 4.991 |
| 6.822 | 4.993 |
| 6.823 | 4.996 |
| 6.824 | 4.998 |
| 6.825 | 5.001 |
| 6.826 | 5.003 |
| 6.827 | 5.006 |
| 6.828 | 5.008 |
| 6.829 | 5.011 |
| 6.83 | 5.014 |
| 6.831 | 5.016 |
| 6.832 | 5.019 |
| 6.833 | 5.021 |
| 6.834 | 5.024 |
| 6.835 | 5.026 |
| 6.836 | 5.029 |
| 6.837 | 5.031 |
| 6.838 | 5.034 |
| 6.839 | 5.037 |
| 6.84 | 5.039 |
| 6.841 | 5.042 |
| 6.842 | 5.044 |
| 6.843 | 5.047 |
| 6.844 | 5.049 |
| 6.845 | 5.052 |
| 6.846 | 5.054 |
| 6.847 | 5.057 |
| 6.848 | 5.06 |
| 6.849 | 5.062 |
| 6.85 | 5.065 |
| 6.851 | 5.067 |
| 6.852 | 5.07 |
| 6.853 | 5.072 |
| 6.854 | 5.075 |
| 6.855 | 5.078 |
| 6.856 | 5.08 |
| 6.857 | 5.083 |
| 6.858 | 5.085 |
| 6.859 | 5.088 |
| 6.86 | 5.09 |
| 6.861 | 5.093 |
| 6.862 | 5.096 |
| 6.863 | 5.098 |
| 6.864 | 5.101 |
| 6.865 | 5.103 |
| 6.866 | 5.106 |
| 6.867 | 5.108 |
| 6.868 | 5.111 |
| 6.869 | 5.114 |
| 6.87 | 5.116 |
| 6.871 | 5.119 |
| 6.872 | 5.121 |
| 6.873 | 5.124 |
| 6.874 | 5.127 |
| 6.875 | 5.129 |
| 6.876 | 5.132 |
| 6.877 | 5.134 |
| 6.878 | 5.137 |
| 6.879 | 5.14 |
| 6.88 | 5.142 |
| 6.881 | 5.145 |
| 6.882 | 5.147 |
| 6.883 | 5.15 |
| 6.884 | 5.152 |
| 6.885 | 5.155 |
| 6.886 | 5.158 |
| 6.887 | 5.16 |
| 6.888 | 5.163 |
| 6.889 | 5.165 |
| 6.89 | 5.168 |
| 6.891 | 5.171 |
| 6.892 | 5.173 |
| 6.893 | 5.176 |
| 6.894 | 5.178 |
| 6.895 | 5.181 |
| 6.896 | 5.184 |
| 6.897 | 5.186 |
| 6.898 | 5.189 |
| 6.899 | 5.191 |
| 6.9 | 5.194 |
| 6.901 | 5.197 |
| 6.902 | 5.199 |
| 6.903 | 5.202 |
| 6.904 | 5.204 |
| 6.905 | 5.207 |
| 6.906 | 5.21 |
| 6.907 | 5.212 |
| 6.908 | 5.215 |
| 6.909 | 5.217 |
| 6.91 | 5.22 |
| 6.911 | 5.223 |
| 6.912 | 5.225 |
| 6.913 | 5.228 |
| 6.914 | 5.231 |
| 6.915 | 5.233 |
| 6.916 | 5.236 |
| 6.917 | 5.238 |
| 6.918 | 5.241 |
| 6.919 | 5.244 |
| 6.92 | 5.246 |
| 6.921 | 5.249 |
| 6.922 | 5.251 |
| 6.923 | 5.254 |
| 6.924 | 5.257 |
| 6.925 | 5.259 |
| 6.926 | 5.262 |
| 6.927 | 5.265 |
| 6.928 | 5.267 |
| 6.929 | 5.27 |
| 6.93 | 5.272 |
| 6.931 | 5.275 |
| 6.932 | 5.278 |
| 6.933 | 5.28 |
| 6.934 | 5.283 |
| 6.935 | 5.286 |
| 6.936 | 5.288 |
| 6.937 | 5.291 |
| 6.938 | 5.293 |
| 6.939 | 5.296 |
| 6.94 | 5.299 |
| 6.941 | 5.301 |
| 6.942 | 5.304 |
| 6.943 | 5.307 |
| 6.944 | 5.309 |
| 6.945 | 5.312 |
| 6.946 | 5.315 |
| 6.947 | 5.317 |
| 6.948 | 5.32 |
| 6.949 | 5.322 |
| 6.95 | 5.325 |
| 6.951 | 5.328 |
| 6.952 | 5.33 |
| 6.953 | 5.333 |
| 6.954 | 5.336 |
| 6.955 | 5.338 |
| 6.956 | 5.341 |
| 6.957 | 5.344 |
| 6.958 | 5.346 |
| 6.959 | 5.349 |
| 6.96 | 5.352 |
| 6.961 | 5.354 |
| 6.962 | 5.357 |
| 6.963 | 5.359 |
| 6.964 | 5.362 |
| 6.965 | 5.365 |
| 6.966 | 5.367 |
| 6.967 | 5.37 |
| 6.968 | 5.373 |
| 6.969 | 5.375 |
| 6.97 | 5.378 |
| 6.971 | 5.381 |
| 6.972 | 5.383 |
| 6.973 | 5.386 |
| 6.974 | 5.389 |
| 6.975 | 5.391 |
| 6.976 | 5.394 |
| 6.977 | 5.397 |
| 6.978 | 5.399 |
| 6.979 | 5.402 |
| 6.98 | 5.405 |
| 6.981 | 5.407 |
| 6.982 | 5.41 |
| 6.983 | 5.413 |
| 6.984 | 5.415 |
| 6.985 | 5.418 |
| 6.986 | 5.421 |
| 6.987 | 5.423 |
| 6.988 | 5.426 |
| 6.989 | 5.429 |
| 6.99 | 5.431 |
| 6.991 | 5.434 |
| 6.992 | 5.437 |
| 6.993 | 5.439 |
| 6.994 | 5.442 |
| 6.995 | 5.445 |
| 6.996 | 5.447 |
| 6.997 | 5.45 |
| 6.998 | 5.453 |
| 6.999 | 5.455 |
| 7.0 | 5.458 |
| 7.001 | 5.461 |
| 7.002 | 5.463 |
| 7.003 | 5.466 |
| 7.004 | 5.469 |
| 7.005 | 5.471 |
| 7.006 | 5.474 |
| 7.007 | 5.477 |
| 7.008 | 5.479 |
| 7.009 | 5.482 |
| 7.01 | 5.485 |
| 7.011 | 5.487 |
| 7.012 | 5.49 |
| 7.013 | 5.493 |
| 7.014 | 5.496 |
| 7.015 | 5.498 |
| 7.016 | 5.501 |
| 7.017 | 5.504 |
| 7.018 | 5.506 |
| 7.019 | 5.509 |
| 7.02 | 5.512 |
| 7.021 | 5.514 |
| 7.022 | 5.517 |
| 7.023 | 5.52 |
| 7.024 | 5.522 |
| 7.025 | 5.525 |
| 7.026 | 5.528 |
| 7.027 | 5.531 |
| 7.028 | 5.533 |
| 7.029 | 5.536 |
| 7.03 | 5.539 |
| 7.031 | 5.541 |
| 7.032 | 5.544 |
| 7.033 | 5.547 |
| 7.034 | 5.549 |
| 7.035 | 5.552 |
| 7.036 | 5.555 |
| 7.037 | 5.558 |
| 7.038 | 5.56 |
| 7.039 | 5.563 |
| 7.04 | 5.566 |
| 7.041 | 5.568 |
| 7.042 | 5.571 |
| 7.043 | 5.574 |
| 7.044 | 5.576 |
| 7.045 | 5.579 |
| 7.046 | 5.582 |
| 7.047 | 5.585 |
| 7.048 | 5.587 |
| 7.049 | 5.59 |
| 7.05 | 5.593 |
| 7.051 | 5.595 |
| 7.052 | 5.598 |
| 7.053 | 5.601 |
| 7.054 | 5.604 |
| 7.055 | 5.606 |
| 7.056 | 5.609 |
| 7.057 | 5.612 |
| 7.058 | 5.614 |
| 7.059 | 5.617 |
| 7.06 | 5.62 |
| 7.061 | 5.623 |
| 7.062 | 5.625 |
| 7.063 | 5.628 |
| 7.064 | 5.631 |
| 7.065 | 5.634 |
| 7.066 | 5.636 |
| 7.067 | 5.639 |
| 7.068 | 5.642 |
| 7.069 | 5.644 |
| 7.07 | 5.647 |
| 7.071 | 5.65 |
| 7.072 | 5.653 |
| 7.073 | 5.655 |
| 7.074 | 5.658 |
| 7.075 | 5.661 |
| 7.076 | 5.664 |
| 7.077 | 5.666 |
| 7.078 | 5.669 |
| 7.079 | 5.672 |
| 7.08 | 5.675 |
| 7.081 | 5.677 |
| 7.082 | 5.68 |
| 7.083 | 5.683 |
| 7.084 | 5.685 |
| 7.085 | 5.688 |
| 7.086 | 5.691 |
| 7.087 | 5.694 |
| 7.088 | 5.696 |
| 7.089 | 5.699 |
| 7.09 | 5.702 |
| 7.091 | 5.705 |
| 7.092 | 5.707 |
| 7.093 | 5.71 |
| 7.094 | 5.713 |
| 7.095 | 5.716 |
| 7.096 | 5.718 |
| 7.097 | 5.721 |
| 7.098 | 5.724 |
| 7.099 | 5.727 |
| 7.1 | 5.729 |
| 7.101 | 5.732 |
| 7.102 | 5.735 |
| 7.103 | 5.738 |
| 7.104 | 5.74 |
| 7.105 | 5.743 |
| 7.106 | 5.746 |
| 7.107 | 5.749 |
| 7.108 | 5.751 |
| 7.109 | 5.754 |
| 7.11 | 5.757 |
| 7.111 | 5.76 |
| 7.112 | 5.762 |
| 7.113 | 5.765 |
| 7.114 | 5.768 |
| 7.115 | 5.771 |
| 7.116 | 5.774 |
| 7.117 | 5.776 |
| 7.118 | 5.779 |
| 7.119 | 5.782 |
| 7.12 | 5.785 |
| 7.121 | 5.787 |
| 7.122 | 5.79 |
| 7.123 | 5.793 |
| 7.124 | 5.796 |
| 7.125 | 5.798 |
| 7.126 | 5.801 |
| 7.127 | 5.804 |
| 7.128 | 5.807 |
| 7.129 | 5.81 |
| 7.13 | 5.812 |
| 7.131 | 5.815 |
| 7.132 | 5.818 |
| 7.133 | 5.821 |
| 7.134 | 5.823 |
| 7.135 | 5.826 |
| 7.136 | 5.829 |
| 7.137 | 5.832 |
| 7.138 | 5.835 |
| 7.139 | 5.837 |
| 7.14 | 5.84 |
| 7.141 | 5.843 |
| 7.142 | 5.846 |
| 7.143 | 5.848 |
| 7.144 | 5.851 |
| 7.145 | 5.854 |
| 7.146 | 5.857 |
| 7.147 | 5.86 |
| 7.148 | 5.862 |
| 7.149 | 5.865 |
| 7.15 | 5.868 |
| 7.151 | 5.871 |
| 7.152 | 5.874 |
| 7.153 | 5.876 |
| 7.154 | 5.879 |
| 7.155 | 5.882 |
| 7.156 | 5.885 |
| 7.157 | 5.887 |
| 7.158 | 5.89 |
| 7.159 | 5.893 |
| 7.16 | 5.896 |
| 7.161 | 5.899 |
| 7.162 | 5.901 |
| 7.163 | 5.904 |
| 7.164 | 5.907 |
| 7.165 | 5.91 |
| 7.166 | 5.913 |
| 7.167 | 5.915 |
| 7.168 | 5.918 |
| 7.169 | 5.921 |
| 7.17 | 5.924 |
| 7.171 | 5.927 |
| 7.172 | 5.93 |
| 7.173 | 5.932 |
| 7.174 | 5.935 |
| 7.175 | 5.938 |
| 7.176 | 5.941 |
| 7.177 | 5.944 |
| 7.178 | 5.946 |
| 7.179 | 5.949 |
| 7.18 | 5.952 |
| 7.181 | 5.955 |
| 7.182 | 5.958 |
| 7.183 | 5.96 |
| 7.184 | 5.963 |
| 7.185 | 5.966 |
| 7.186 | 5.969 |
| 7.187 | 5.972 |
| 7.188 | 5.975 |
| 7.189 | 5.977 |
| 7.19 | 5.98 |
| 7.191 | 5.983 |
| 7.192 | 5.986 |
| 7.193 | 5.989 |
| 7.194 | 5.991 |
| 7.195 | 5.994 |
| 7.196 | 5.997 |
| 7.197 | 6 |
| 7.198 | 6.003 |
| 7.199 | 6.006 |
| 7.2 | 6.008 |
| 7.201 | 6.011 |
| 7.202 | 6.014 |
| 7.203 | 6.017 |
| 7.204 | 6.02 |
| 7.205 | 6.023 |
| 7.206 | 6.025 |
| 7.207 | 6.028 |
| 7.208 | 6.031 |
| 7.209 | 6.034 |
| 7.21 | 6.037 |
| 7.211 | 6.04 |
| 7.212 | 6.042 |
| 7.213 | 6.045 |
| 7.214 | 6.048 |
| 7.215 | 6.051 |
| 7.216 | 6.054 |
| 7.217 | 6.057 |
| 7.218 | 6.059 |
| 7.219 | 6.062 |
| 7.22 | 6.065 |
| 7.221 | 6.068 |
| 7.222 | 6.071 |
| 7.223 | 6.074 |
| 7.224 | 6.077 |
| 7.225 | 6.079 |
| 7.226 | 6.082 |
| 7.227 | 6.085 |
| 7.228 | 6.088 |
| 7.229 | 6.091 |
| 7.23 | 6.094 |
| 7.231 | 6.096 |
| 7.232 | 6.099 |
| 7.233 | 6.102 |
| 7.234 | 6.105 |
| 7.235 | 6.108 |
| 7.236 | 6.111 |
| 7.237 | 6.114 |
| 7.238 | 6.116 |
| 7.239 | 6.119 |
| 7.24 | 6.122 |
| 7.241 | 6.125 |
| 7.242 | 6.128 |
| 7.243 | 6.131 |
| 7.244 | 6.134 |
| 7.245 | 6.137 |
| 7.246 | 6.139 |
| 7.247 | 6.142 |
| 7.248 | 6.145 |
| 7.249 | 6.148 |
| 7.25 | 6.151 |
| 7.251 | 6.154 |
| 7.252 | 6.157 |
| 7.253 | 6.159 |
| 7.254 | 6.162 |
| 7.255 | 6.165 |
| 7.256 | 6.168 |
| 7.257 | 6.171 |
| 7.258 | 6.174 |
| 7.259 | 6.177 |
| 7.26 | 6.18 |
| 7.261 | 6.182 |
| 7.262 | 6.185 |
| 7.263 | 6.188 |
| 7.264 | 6.191 |
| 7.265 | 6.194 |
| 7.266 | 6.197 |
| 7.267 | 6.2 |
| 7.268 | 6.203 |
| 7.269 | 6.206 |
| 7.27 | 6.208 |
| 7.271 | 6.211 |
| 7.272 | 6.214 |
| 7.273 | 6.217 |
| 7.274 | 6.22 |
| 7.275 | 6.223 |
| 7.276 | 6.226 |
| 7.277 | 6.229 |
| 7.278 | 6.231 |
| 7.279 | 6.234 |
| 7.28 | 6.237 |
| 7.281 | 6.24 |
| 7.282 | 6.243 |
| 7.283 | 6.246 |
| 7.284 | 6.249 |
| 7.285 | 6.252 |
| 7.286 | 6.255 |
| 7.287 | 6.258 |
| 7.288 | 6.26 |
| 7.289 | 6.263 |
| 7.29 | 6.266 |
| 7.291 | 6.269 |
| 7.292 | 6.272 |
| 7.293 | 6.275 |
| 7.294 | 6.278 |
| 7.295 | 6.281 |
| 7.296 | 6.284 |
| 7.297 | 6.287 |
| 7.298 | 6.289 |
| 7.299 | 6.292 |
| 7.3 | 6.295 |
| 7.301 | 6.298 |
| 7.302 | 6.301 |
| 7.303 | 6.304 |
| 7.304 | 6.307 |
| 7.305 | 6.31 |
| 7.306 | 6.313 |
| 7.307 | 6.316 |
| 7.308 | 6.319 |
| 7.309 | 6.322 |
| 7.31 | 6.324 |
| 7.311 | 6.327 |
| 7.312 | 6.33 |
| 7.313 | 6.333 |
| 7.314 | 6.336 |
| 7.315 | 6.339 |
| 7.316 | 6.342 |
| 7.317 | 6.345 |
| 7.318 | 6.348 |
| 7.319 | 6.351 |
| 7.32 | 6.354 |
| 7.321 | 6.357 |
| 7.322 | 6.359 |
| 7.323 | 6.362 |
| 7.324 | 6.365 |
| 7.325 | 6.368 |
| 7.326 | 6.371 |
| 7.327 | 6.374 |
| 7.328 | 6.377 |
| 7.329 | 6.38 |
| 7.33 | 6.383 |
| 7.331 | 6.386 |
| 7.332 | 6.389 |
| 7.333 | 6.392 |
| 7.334 | 6.395 |
| 7.335 | 6.398 |
| 7.336 | 6.401 |
| 7.337 | 6.403 |
| 7.338 | 6.406 |
| 7.339 | 6.409 |
| 7.34 | 6.412 |
| 7.341 | 6.415 |
| 7.342 | 6.418 |
| 7.343 | 6.421 |
| 7.344 | 6.424 |
| 7.345 | 6.427 |
| 7.346 | 6.43 |
| 7.347 | 6.433 |
| 7.348 | 6.436 |
| 7.349 | 6.439 |
| 7.35 | 6.442 |
| 7.351 | 6.445 |
| 7.352 | 6.448 |
| 7.353 | 6.451 |
| 7.354 | 6.454 |
| 7.355 | 6.457 |
| 7.356 | 6.459 |
| 7.357 | 6.462 |
| 7.358 | 6.465 |
| 7.359 | 6.468 |
| 7.36 | 6.471 |
| 7.361 | 6.474 |
| 7.362 | 6.477 |
| 7.363 | 6.48 |
| 7.364 | 6.483 |
| 7.365 | 6.486 |
| 7.366 | 6.489 |
| 7.367 | 6.492 |
| 7.368 | 6.495 |
| 7.369 | 6.498 |
| 7.37 | 6.501 |
| 7.371 | 6.504 |
| 7.372 | 6.507 |
| 7.373 | 6.51 |
| 7.374 | 6.513 |
| 7.375 | 6.516 |
| 7.376 | 6.519 |
| 7.377 | 6.522 |
| 7.378 | 6.525 |
| 7.379 | 6.528 |
| 7.38 | 6.531 |
| 7.381 | 6.534 |
| 7.382 | 6.537 |
| 7.383 | 6.54 |
| 7.384 | 6.543 |
| 7.385 | 6.546 |
| 7.386 | 6.548 |
| 7.387 | 6.551 |
| 7.388 | 6.554 |
| 7.389 | 6.557 |
| 7.39 | 6.56 |
| 7.391 | 6.563 |
| 7.392 | 6.566 |
| 7.393 | 6.569 |
| 7.394 | 6.572 |
| 7.395 | 6.575 |
| 7.396 | 6.578 |
| 7.397 | 6.581 |
| 7.398 | 6.584 |
| 7.399 | 6.587 |
| 7.4 | 6.59 |
| 7.401 | 6.593 |
| 7.402 | 6.596 |
| 7.403 | 6.599 |
| 7.404 | 6.602 |
| 7.405 | 6.605 |
| 7.406 | 6.608 |
| 7.407 | 6.611 |
| 7.408 | 6.614 |
| 7.409 | 6.617 |
| 7.41 | 6.62 |
| 7.411 | 6.623 |
| 7.412 | 6.626 |
| 7.413 | 6.629 |
| 7.414 | 6.632 |
| 7.415 | 6.635 |
| 7.416 | 6.638 |
| 7.417 | 6.641 |
| 7.418 | 6.644 |
| 7.419 | 6.647 |
| 7.42 | 6.65 |
| 7.421 | 6.653 |
| 7.422 | 6.656 |
| 7.423 | 6.659 |
| 7.424 | 6.662 |
| 7.425 | 6.665 |
| 7.426 | 6.668 |
| 7.427 | 6.671 |
| 7.428 | 6.674 |
| 7.429 | 6.677 |
| 7.43 | 6.68 |
| 7.431 | 6.683 |
| 7.432 | 6.686 |
| 7.433 | 6.689 |
| 7.434 | 6.692 |
| 7.435 | 6.696 |
| 7.436 | 6.699 |
| 7.437 | 6.702 |
| 7.438 | 6.705 |
| 7.439 | 6.708 |
| 7.44 | 6.711 |
| 7.441 | 6.714 |
| 7.442 | 6.717 |
| 7.443 | 6.72 |
| 7.444 | 6.723 |
| 7.445 | 6.726 |
| 7.446 | 6.729 |
| 7.447 | 6.732 |
| 7.448 | 6.735 |
| 7.449 | 6.738 |
| 7.45 | 6.741 |
| 7.451 | 6.744 |
| 7.452 | 6.747 |
| 7.453 | 6.75 |
| 7.454 | 6.753 |
| 7.455 | 6.756 |
| 7.456 | 6.759 |
| 7.457 | 6.762 |
| 7.458 | 6.765 |
| 7.459 | 6.768 |
| 7.46 | 6.771 |
| 7.461 | 6.774 |
| 7.462 | 6.777 |
| 7.463 | 6.78 |
| 7.464 | 6.783 |
| 7.465 | 6.787 |
| 7.466 | 6.79 |
| 7.467 | 6.793 |
| 7.468 | 6.796 |
| 7.469 | 6.799 |
| 7.47 | 6.802 |
| 7.471 | 6.805 |
| 7.472 | 6.808 |
| 7.473 | 6.811 |
| 7.474 | 6.814 |
| 7.475 | 6.817 |
| 7.476 | 6.82 |
| 7.477 | 6.823 |
| 7.478 | 6.826 |
| 7.479 | 6.829 |
| 7.48 | 6.832 |
| 7.481 | 6.835 |
| 7.482 | 6.838 |
| 7.483 | 6.842 |
| 7.484 | 6.845 |
| 7.485 | 6.848 |
| 7.486 | 6.851 |
| 7.487 | 6.854 |
| 7.488 | 6.857 |
| 7.489 | 6.86 |
| 7.49 | 6.863 |
| 7.491 | 6.866 |
| 7.492 | 6.869 |
| 7.493 | 6.872 |
| 7.494 | 6.875 |
| 7.495 | 6.878 |
| 7.496 | 6.881 |
| 7.497 | 6.884 |
| 7.498 | 6.888 |
| 7.499 | 6.891 |
| 7.5 | 6.894 |
| 7.501 | 6.897 |
| 7.502 | 6.9 |
| 7.503 | 6.903 |
| 7.504 | 6.906 |
| 7.505 | 6.909 |
| 7.506 | 6.912 |
| 7.507 | 6.915 |
| 7.508 | 6.918 |
| 7.509 | 6.921 |
| 7.51 | 6.924 |
| 7.511 | 6.928 |
| 7.512 | 6.931 |
| 7.513 | 6.934 |
| 7.514 | 6.937 |
| 7.515 | 6.94 |
| 7.516 | 6.943 |
| 7.517 | 6.946 |
| 7.518 | 6.949 |
| 7.519 | 6.952 |
| 7.52 | 6.955 |
| 7.521 | 6.958 |
| 7.522 | 6.962 |
| 7.523 | 6.965 |
| 7.524 | 6.968 |
| 7.525 | 6.971 |
| 7.526 | 6.974 |
| 7.527 | 6.977 |
| 7.528 | 6.98 |
| 7.529 | 6.983 |
| 7.53 | 6.986 |
| 7.531 | 6.989 |
| 7.532 | 6.993 |
| 7.533 | 6.996 |
| 7.534 | 6.999 |
| 7.535 | 7.002 |
| 7.536 | 7.005 |
| 7.537 | 7.008 |
| 7.538 | 7.011 |
| 7.539 | 7.014 |
| 7.54 | 7.017 |
| 7.541 | 7.021 |
| 7.542 | 7.024 |
| 7.543 | 7.027 |
| 7.544 | 7.03 |
| 7.545 | 7.033 |
| 7.546 | 7.036 |
| 7.547 | 7.039 |
| 7.548 | 7.042 |
| 7.549 | 7.046 |
| 7.55 | 7.049 |
| 7.551 | 7.052 |
| 7.552 | 7.055 |
| 7.553 | 7.058 |
| 7.554 | 7.061 |
| 7.555 | 7.064 |
| 7.556 | 7.067 |
| 7.557 | 7.07 |
| 7.558 | 7.074 |
| 7.559 | 7.077 |
| 7.56 | 7.08 |
| 7.561 | 7.083 |
| 7.562 | 7.086 |
| 7.563 | 7.089 |
| 7.564 | 7.092 |
| 7.565 | 7.096 |
| 7.566 | 7.099 |
| 7.567 | 7.102 |
| 7.568 | 7.105 |
| 7.569 | 7.108 |
| 7.57 | 7.111 |
| 7.571 | 7.114 |
| 7.572 | 7.117 |
| 7.573 | 7.121 |
| 7.574 | 7.124 |
| 7.575 | 7.127 |
| 7.576 | 7.13 |
| 7.577 | 7.133 |
| 7.578 | 7.136 |
| 7.579 | 7.139 |
| 7.58 | 7.143 |
| 7.581 | 7.146 |
| 7.582 | 7.149 |
| 7.583 | 7.152 |
| 7.584 | 7.155 |
| 7.585 | 7.158 |
| 7.586 | 7.162 |
| 7.587 | 7.165 |
| 7.588 | 7.168 |
| 7.589 | 7.171 |
| 7.59 | 7.174 |
| 7.591 | 7.177 |
| 7.592 | 7.18 |
| 7.593 | 7.184 |
| 7.594 | 7.187 |
| 7.595 | 7.19 |
| 7.596 | 7.193 |
| 7.597 | 7.196 |
| 7.598 | 7.199 |
| 7.599 | 7.203 |
| 7.6 | 7.206 |
| 7.601 | 7.209 |
| 7.602 | 7.212 |
| 7.603 | 7.215 |
| 7.604 | 7.218 |
| 7.605 | 7.222 |
| 7.606 | 7.225 |
| 7.607 | 7.228 |
| 7.608 | 7.231 |
| 7.609 | 7.234 |
| 7.61 | 7.237 |
| 7.611 | 7.241 |
| 7.612 | 7.244 |
| 7.613 | 7.247 |
| 7.614 | 7.25 |
| 7.615 | 7.253 |
| 7.616 | 7.257 |
| 7.617 | 7.26 |
| 7.618 | 7.263 |
| 7.619 | 7.266 |
| 7.62 | 7.269 |
| 7.621 | 7.272 |
| 7.622 | 7.276 |
| 7.623 | 7.279 |
| 7.624 | 7.282 |
| 7.625 | 7.285 |
| 7.626 | 7.288 |
| 7.627 | 7.292 |
| 7.628 | 7.295 |
| 7.629 | 7.298 |
| 7.63 | 7.301 |
| 7.631 | 7.304 |
| 7.632 | 7.308 |
| 7.633 | 7.311 |
| 7.634 | 7.314 |
| 7.635 | 7.317 |
| 7.636 | 7.32 |
| 7.637 | 7.323 |
| 7.638 | 7.327 |
| 7.639 | 7.33 |
| 7.64 | 7.333 |
| 7.641 | 7.336 |
| 7.642 | 7.339 |
| 7.643 | 7.343 |
| 7.644 | 7.346 |
| 7.645 | 7.349 |
| 7.646 | 7.352 |
| 7.647 | 7.356 |
| 7.648 | 7.359 |
| 7.649 | 7.362 |
| 7.65 | 7.365 |
| 7.651 | 7.368 |
| 7.652 | 7.372 |
| 7.653 | 7.375 |
| 7.654 | 7.378 |
| 7.655 | 7.381 |
| 7.656 | 7.384 |
| 7.657 | 7.388 |
| 7.658 | 7.391 |
| 7.659 | 7.394 |
| 7.66 | 7.397 |
| 7.661 | 7.4 |
| 7.662 | 7.404 |
| 7.663 | 7.407 |
| 7.664 | 7.41 |
| 7.665 | 7.413 |
| 7.666 | 7.417 |
| 7.667 | 7.42 |
| 7.668 | 7.423 |
| 7.669 | 7.426 |
| 7.67 | 7.43 |
| 7.671 | 7.433 |
| 7.672 | 7.436 |
| 7.673 | 7.439 |
| 7.674 | 7.442 |
| 7.675 | 7.446 |
| 7.676 | 7.449 |
| 7.677 | 7.452 |
| 7.678 | 7.455 |
| 7.679 | 7.459 |
| 7.68 | 7.462 |
| 7.681 | 7.465 |
| 7.682 | 7.468 |
| 7.683 | 7.472 |
| 7.684 | 7.475 |
| 7.685 | 7.478 |
| 7.686 | 7.481 |
| 7.687 | 7.485 |
| 7.688 | 7.488 |
| 7.689 | 7.491 |
| 7.69 | 7.494 |
| 7.691 | 7.498 |
| 7.692 | 7.501 |
| 7.693 | 7.504 |
| 7.694 | 7.507 |
| 7.695 | 7.511 |
| 7.696 | 7.514 |
| 7.697 | 7.517 |
| 7.698 | 7.52 |
| 7.699 | 7.524 |
| 7.7 | 7.527 |
| 7.701 | 7.53 |
| 7.702 | 7.533 |
| 7.703 | 7.537 |
| 7.704 | 7.54 |
| 7.705 | 7.543 |
| 7.706 | 7.546 |
| 7.707 | 7.55 |
| 7.708 | 7.553 |
| 7.709 | 7.556 |
| 7.71 | 7.559 |
| 7.711 | 7.563 |
| 7.712 | 7.566 |
| 7.713 | 7.569 |
| 7.714 | 7.572 |
| 7.715 | 7.576 |
| 7.716 | 7.579 |
| 7.717 | 7.582 |
| 7.718 | 7.586 |
| 7.719 | 7.589 |
| 7.72 | 7.592 |
| 7.721 | 7.595 |
| 7.722 | 7.599 |
| 7.723 | 7.602 |
| 7.724 | 7.605 |
| 7.725 | 7.608 |
| 7.726 | 7.612 |
| 7.727 | 7.615 |
| 7.728 | 7.618 |
| 7.729 | 7.622 |
| 7.73 | 7.625 |
| 7.731 | 7.628 |
| 7.732 | 7.631 |
| 7.733 | 7.635 |
| 7.734 | 7.638 |
| 7.735 | 7.641 |
| 7.736 | 7.645 |
| 7.737 | 7.648 |
| 7.738 | 7.651 |
| 7.739 | 7.654 |
| 7.74 | 7.658 |
| 7.741 | 7.661 |
| 7.742 | 7.664 |
| 7.743 | 7.668 |
| 7.744 | 7.671 |
| 7.745 | 7.674 |
| 7.746 | 7.678 |
| 7.747 | 7.681 |
| 7.748 | 7.684 |
| 7.749 | 7.687 |
| 7.75 | 7.691 |
| 7.751 | 7.694 |
| 7.752 | 7.697 |
| 7.753 | 7.701 |
| 7.754 | 7.704 |
| 7.755 | 7.707 |
| 7.756 | 7.711 |
| 7.757 | 7.714 |
| 7.758 | 7.717 |
| 7.759 | 7.721 |
| 7.76 | 7.724 |
| 7.761 | 7.727 |
| 7.762 | 7.73 |
| 7.763 | 7.734 |
| 7.764 | 7.737 |
| 7.765 | 7.74 |
| 7.766 | 7.744 |
| 7.767 | 7.747 |
| 7.768 | 7.75 |
| 7.769 | 7.754 |
| 7.77 | 7.757 |
| 7.771 | 7.76 |
| 7.772 | 7.764 |
| 7.773 | 7.767 |
| 7.774 | 7.77 |
| 7.775 | 7.774 |
| 7.776 | 7.777 |
| 7.777 | 7.78 |
| 7.778 | 7.784 |
| 7.779 | 7.787 |
| 7.78 | 7.79 |
| 7.781 | 7.794 |
| 7.782 | 7.797 |
| 7.783 | 7.8 |
| 7.784 | 7.804 |
| 7.785 | 7.807 |
| 7.786 | 7.81 |
| 7.787 | 7.814 |
| 7.788 | 7.817 |
| 7.789 | 7.82 |
| 7.79 | 7.824 |
| 7.791 | 7.827 |
| 7.792 | 7.83 |
| 7.793 | 7.834 |
| 7.794 | 7.837 |
| 7.795 | 7.84 |
| 7.796 | 7.844 |
| 7.797 | 7.847 |
| 7.798 | 7.85 |
| 7.799 | 7.854 |
| 7.8 | 7.857 |
| 7.801 | 7.86 |
| 7.802 | 7.864 |
| 7.803 | 7.867 |
| 7.804 | 7.87 |
| 7.805 | 7.874 |
| 7.806 | 7.877 |
| 7.807 | 7.881 |
| 7.808 | 7.884 |
| 7.809 | 7.887 |
| 7.81 | 7.891 |
| 7.811 | 7.894 |
| 7.812 | 7.897 |
| 7.813 | 7.901 |
| 7.814 | 7.904 |
| 7.815 | 7.907 |
| 7.816 | 7.911 |
| 7.817 | 7.914 |
| 7.818 | 7.918 |
| 7.819 | 7.921 |
| 7.82 | 7.924 |
| 7.821 | 7.928 |
| 7.822 | 7.931 |
| 7.823 | 7.934 |
| 7.824 | 7.938 |
| 7.825 | 7.941 |
| 7.826 | 7.945 |
| 7.827 | 7.948 |
| 7.828 | 7.951 |
| 7.829 | 7.955 |
| 7.83 | 7.958 |
| 7.831 | 7.961 |
| 7.832 | 7.965 |
| 7.833 | 7.968 |
| 7.834 | 7.972 |
| 7.835 | 7.975 |
| 7.836 | 7.978 |
| 7.837 | 7.982 |
| 7.838 | 7.985 |
| 7.839 | 7.988 |
| 7.84 | 7.992 |
| 7.841 | 7.995 |
| 7.842 | 7.999 |
| 7.843 | 8.002 |
| 7.844 | 8.005 |
| 7.845 | 8.009 |
| 7.846 | 8.012 |
| 7.847 | 8.016 |
| 7.848 | 8.019 |
| 7.849 | 8.022 |
| 7.85 | 8.026 |
| 7.851 | 8.029 |
| 7.852 | 8.033 |
| 7.853 | 8.036 |
| 7.854 | 8.039 |
| 7.855 | 8.043 |
| 7.856 | 8.046 |
| 7.857 | 8.05 |
| 7.858 | 8.053 |
| 7.859 | 8.056 |
| 7.86 | 8.06 |
| 7.861 | 8.063 |
| 7.862 | 8.067 |
| 7.863 | 8.07 |
| 7.864 | 8.073 |
| 7.865 | 8.077 |
| 7.866 | 8.08 |
| 7.867 | 8.084 |
| 7.868 | 8.087 |
| 7.869 | 8.091 |
| 7.87 | 8.094 |
| 7.871 | 8.097 |
| 7.872 | 8.101 |
| 7.873 | 8.104 |
| 7.874 | 8.108 |
| 7.875 | 8.111 |
| 7.876 | 8.115 |
| 7.877 | 8.118 |
| 7.878 | 8.121 |
| 7.879 | 8.125 |
| 7.88 | 8.128 |
| 7.881 | 8.132 |
| 7.882 | 8.135 |
| 7.883 | 8.139 |
| 7.884 | 8.142 |
| 7.885 | 8.145 |
| 7.886 | 8.149 |
| 7.887 | 8.152 |
| 7.888 | 8.156 |
| 7.889 | 8.159 |
| 7.89 | 8.163 |
| 7.891 | 8.166 |
| 7.892 | 8.169 |
| 7.893 | 8.173 |
| 7.894 | 8.176 |
| 7.895 | 8.18 |
| 7.896 | 8.183 |
| 7.897 | 8.187 |
| 7.898 | 8.19 |
| 7.899 | 8.194 |
| 7.9 | 8.197 |
| 7.901 | 8.2 |
| 7.902 | 8.204 |
| 7.903 | 8.207 |
| 7.904 | 8.211 |
| 7.905 | 8.214 |
| 7.906 | 8.218 |
| 7.907 | 8.221 |
| 7.908 | 8.225 |
| 7.909 | 8.228 |
| 7.91 | 8.232 |
| 7.911 | 8.235 |
| 7.912 | 8.238 |
| 7.913 | 8.242 |
| 7.914 | 8.245 |
| 7.915 | 8.249 |
| 7.916 | 8.252 |
| 7.917 | 8.256 |
| 7.918 | 8.259 |
| 7.919 | 8.263 |
| 7.92 | 8.266 |
| 7.921 | 8.27 |
| 7.922 | 8.273 |
| 7.923 | 8.277 |
| 7.924 | 8.28 |
| 7.925 | 8.283 |
| 7.926 | 8.287 |
| 7.927 | 8.29 |
| 7.928 | 8.294 |
| 7.929 | 8.297 |
| 7.93 | 8.301 |
| 7.931 | 8.304 |
| 7.932 | 8.308 |
| 7.933 | 8.311 |
| 7.934 | 8.315 |
| 7.935 | 8.318 |
| 7.936 | 8.322 |
| 7.937 | 8.325 |
| 7.938 | 8.329 |
| 7.939 | 8.332 |
| 7.94 | 8.336 |
| 7.941 | 8.339 |
| 7.942 | 8.343 |
| 7.943 | 8.346 |
| 7.944 | 8.35 |
| 7.945 | 8.353 |
| 7.946 | 8.357 |
| 7.947 | 8.36 |
| 7.948 | 8.364 |
| 7.949 | 8.367 |
| 7.95 | 8.371 |
| 7.951 | 8.374 |
| 7.952 | 8.378 |
| 7.953 | 8.381 |
| 7.954 | 8.385 |
| 7.955 | 8.388 |
| 7.956 | 8.392 |
| 7.957 | 8.395 |
| 7.958 | 8.399 |
| 7.959 | 8.402 |
| 7.96 | 8.406 |
| 7.961 | 8.409 |
| 7.962 | 8.413 |
| 7.963 | 8.416 |
| 7.964 | 8.42 |
| 7.965 | 8.423 |
| 7.966 | 8.427 |
| 7.967 | 8.43 |
| 7.968 | 8.434 |
| 7.969 | 8.437 |
| 7.97 | 8.441 |
| 7.971 | 8.444 |
| 7.972 | 8.448 |
| 7.973 | 8.451 |
| 7.974 | 8.455 |
| 7.975 | 8.458 |
| 7.976 | 8.462 |
| 7.977 | 8.465 |
| 7.978 | 8.469 |
| 7.979 | 8.472 |
| 7.98 | 8.476 |
| 7.981 | 8.48 |
| 7.982 | 8.483 |
| 7.983 | 8.487 |
| 7.984 | 8.49 |
| 7.985 | 8.494 |
| 7.986 | 8.497 |
| 7.987 | 8.501 |
| 7.988 | 8.504 |
| 7.989 | 8.508 |
| 7.99 | 8.511 |
| 7.991 | 8.515 |
| 7.992 | 8.518 |
| 7.993 | 8.522 |
| 7.994 | 8.526 |
| 7.995 | 8.529 |
| 7.996 | 8.533 |
| 7.997 | 8.536 |
| 7.998 | 8.54 |
| 7.999 | 8.543 |
| 8.0 | 8.547 |